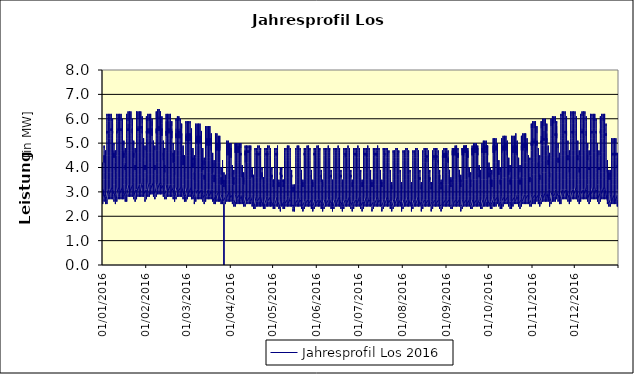
| Category | Jahresprofil Los 2016 |
|---|---|
| 01/01/2016 | 3 |
| 01/01/2016 | 2.9 |
| 01/01/2016 | 2.8 |
| 01/01/2016 | 2.7 |
| 01/01/2016 | 2.6 |
| 01/01/2016 | 2.5 |
| 01/01/2016 | 2.5 |
| 01/01/2016 | 2.5 |
| 01/01/2016 | 2.6 |
| 01/01/2016 | 2.7 |
| 01/01/2016 | 3 |
| 01/01/2016 | 3.2 |
| 01/01/2016 | 3.4 |
| 01/01/2016 | 3.5 |
| 01/01/2016 | 3.5 |
| 01/01/2016 | 3.6 |
| 01/01/2016 | 4 |
| 01/01/2016 | 4.1 |
| 01/01/2016 | 4.2 |
| 01/01/2016 | 4.1 |
| 01/01/2016 | 3.8 |
| 01/01/2016 | 3.5 |
| 01/01/2016 | 3.3 |
| 01/01/2016 | 3 |
| 02/01/2016 | 3.1 |
| 02/01/2016 | 2.8 |
| 02/01/2016 | 2.7 |
| 02/01/2016 | 2.6 |
| 02/01/2016 | 2.6 |
| 02/01/2016 | 2.6 |
| 02/01/2016 | 2.7 |
| 02/01/2016 | 3 |
| 02/01/2016 | 3.5 |
| 02/01/2016 | 3.9 |
| 02/01/2016 | 4.3 |
| 02/01/2016 | 4.4 |
| 02/01/2016 | 4.5 |
| 02/01/2016 | 4.3 |
| 02/01/2016 | 4.2 |
| 02/01/2016 | 4.3 |
| 02/01/2016 | 4.7 |
| 02/01/2016 | 4.9 |
| 02/01/2016 | 4.8 |
| 02/01/2016 | 4.7 |
| 02/01/2016 | 4.2 |
| 02/01/2016 | 3.8 |
| 02/01/2016 | 3.5 |
| 02/01/2016 | 3.2 |
| 03/01/2016 | 2.9 |
| 03/01/2016 | 2.7 |
| 03/01/2016 | 2.6 |
| 03/01/2016 | 2.5 |
| 03/01/2016 | 2.5 |
| 03/01/2016 | 2.5 |
| 03/01/2016 | 2.6 |
| 03/01/2016 | 2.8 |
| 03/01/2016 | 3.1 |
| 03/01/2016 | 3.4 |
| 03/01/2016 | 3.7 |
| 03/01/2016 | 3.9 |
| 03/01/2016 | 4 |
| 03/01/2016 | 3.9 |
| 03/01/2016 | 3.9 |
| 03/01/2016 | 3.9 |
| 03/01/2016 | 4.3 |
| 03/01/2016 | 4.6 |
| 03/01/2016 | 4.7 |
| 03/01/2016 | 4.5 |
| 03/01/2016 | 4.2 |
| 03/01/2016 | 3.8 |
| 03/01/2016 | 3.6 |
| 03/01/2016 | 3.3 |
| 04/01/2016 | 2.9 |
| 04/01/2016 | 2.7 |
| 04/01/2016 | 2.6 |
| 04/01/2016 | 2.5 |
| 04/01/2016 | 2.7 |
| 04/01/2016 | 3 |
| 04/01/2016 | 3.7 |
| 04/01/2016 | 4.5 |
| 04/01/2016 | 4.9 |
| 04/01/2016 | 5.1 |
| 04/01/2016 | 5.3 |
| 04/01/2016 | 5.4 |
| 04/01/2016 | 5.5 |
| 04/01/2016 | 5.4 |
| 04/01/2016 | 5.4 |
| 04/01/2016 | 5.5 |
| 04/01/2016 | 5.9 |
| 04/01/2016 | 6.2 |
| 04/01/2016 | 6.1 |
| 04/01/2016 | 5.8 |
| 04/01/2016 | 5.1 |
| 04/01/2016 | 4.5 |
| 04/01/2016 | 4 |
| 04/01/2016 | 3.5 |
| 05/01/2016 | 3.1 |
| 05/01/2016 | 2.8 |
| 05/01/2016 | 2.7 |
| 05/01/2016 | 2.7 |
| 05/01/2016 | 2.8 |
| 05/01/2016 | 3.1 |
| 05/01/2016 | 3.8 |
| 05/01/2016 | 4.6 |
| 05/01/2016 | 5 |
| 05/01/2016 | 5.2 |
| 05/01/2016 | 5.4 |
| 05/01/2016 | 5.5 |
| 05/01/2016 | 5.5 |
| 05/01/2016 | 5.5 |
| 05/01/2016 | 5.5 |
| 05/01/2016 | 5.5 |
| 05/01/2016 | 5.9 |
| 05/01/2016 | 6.2 |
| 05/01/2016 | 6.1 |
| 05/01/2016 | 5.9 |
| 05/01/2016 | 5.2 |
| 05/01/2016 | 4.5 |
| 05/01/2016 | 4 |
| 05/01/2016 | 3.5 |
| 06/01/2016 | 3.1 |
| 06/01/2016 | 2.9 |
| 06/01/2016 | 2.7 |
| 06/01/2016 | 2.7 |
| 06/01/2016 | 2.8 |
| 06/01/2016 | 3.1 |
| 06/01/2016 | 3.8 |
| 06/01/2016 | 4.6 |
| 06/01/2016 | 5 |
| 06/01/2016 | 5.2 |
| 06/01/2016 | 5.4 |
| 06/01/2016 | 5.5 |
| 06/01/2016 | 5.5 |
| 06/01/2016 | 5.5 |
| 06/01/2016 | 5.5 |
| 06/01/2016 | 5.5 |
| 06/01/2016 | 5.9 |
| 06/01/2016 | 6.2 |
| 06/01/2016 | 6.1 |
| 06/01/2016 | 5.9 |
| 06/01/2016 | 5.2 |
| 06/01/2016 | 4.5 |
| 06/01/2016 | 4 |
| 06/01/2016 | 3.5 |
| 07/01/2016 | 3.2 |
| 07/01/2016 | 2.9 |
| 07/01/2016 | 2.7 |
| 07/01/2016 | 2.7 |
| 07/01/2016 | 2.8 |
| 07/01/2016 | 3.1 |
| 07/01/2016 | 3.8 |
| 07/01/2016 | 4.6 |
| 07/01/2016 | 5 |
| 07/01/2016 | 5.3 |
| 07/01/2016 | 5.4 |
| 07/01/2016 | 5.5 |
| 07/01/2016 | 5.6 |
| 07/01/2016 | 5.5 |
| 07/01/2016 | 5.5 |
| 07/01/2016 | 5.6 |
| 07/01/2016 | 5.9 |
| 07/01/2016 | 6.2 |
| 07/01/2016 | 6.2 |
| 07/01/2016 | 5.9 |
| 07/01/2016 | 5.2 |
| 07/01/2016 | 4.5 |
| 07/01/2016 | 4 |
| 07/01/2016 | 3.6 |
| 08/01/2016 | 3.2 |
| 08/01/2016 | 2.9 |
| 08/01/2016 | 2.8 |
| 08/01/2016 | 2.7 |
| 08/01/2016 | 2.8 |
| 08/01/2016 | 3.1 |
| 08/01/2016 | 3.8 |
| 08/01/2016 | 4.6 |
| 08/01/2016 | 5 |
| 08/01/2016 | 5.3 |
| 08/01/2016 | 5.4 |
| 08/01/2016 | 5.5 |
| 08/01/2016 | 5.5 |
| 08/01/2016 | 5.4 |
| 08/01/2016 | 5.4 |
| 08/01/2016 | 5.4 |
| 08/01/2016 | 5.8 |
| 08/01/2016 | 6 |
| 08/01/2016 | 5.9 |
| 08/01/2016 | 5.6 |
| 08/01/2016 | 4.9 |
| 08/01/2016 | 4.3 |
| 08/01/2016 | 3.9 |
| 08/01/2016 | 3.5 |
| 09/01/2016 | 3.1 |
| 09/01/2016 | 2.9 |
| 09/01/2016 | 2.8 |
| 09/01/2016 | 2.7 |
| 09/01/2016 | 2.6 |
| 09/01/2016 | 2.7 |
| 09/01/2016 | 2.9 |
| 09/01/2016 | 3.3 |
| 09/01/2016 | 3.7 |
| 09/01/2016 | 4.1 |
| 09/01/2016 | 4.4 |
| 09/01/2016 | 4.6 |
| 09/01/2016 | 4.6 |
| 09/01/2016 | 4.4 |
| 09/01/2016 | 4.4 |
| 09/01/2016 | 4.4 |
| 09/01/2016 | 4.7 |
| 09/01/2016 | 5 |
| 09/01/2016 | 5 |
| 09/01/2016 | 4.9 |
| 09/01/2016 | 4.4 |
| 09/01/2016 | 3.9 |
| 09/01/2016 | 3.6 |
| 09/01/2016 | 3.3 |
| 10/01/2016 | 3 |
| 10/01/2016 | 2.7 |
| 10/01/2016 | 2.6 |
| 10/01/2016 | 2.6 |
| 10/01/2016 | 2.5 |
| 10/01/2016 | 2.5 |
| 10/01/2016 | 2.6 |
| 10/01/2016 | 2.9 |
| 10/01/2016 | 3.2 |
| 10/01/2016 | 3.5 |
| 10/01/2016 | 3.7 |
| 10/01/2016 | 3.9 |
| 10/01/2016 | 4 |
| 10/01/2016 | 3.9 |
| 10/01/2016 | 3.9 |
| 10/01/2016 | 3.9 |
| 10/01/2016 | 4.2 |
| 10/01/2016 | 4.6 |
| 10/01/2016 | 4.7 |
| 10/01/2016 | 4.6 |
| 10/01/2016 | 4.2 |
| 10/01/2016 | 3.9 |
| 10/01/2016 | 3.6 |
| 10/01/2016 | 3.3 |
| 11/01/2016 | 3 |
| 11/01/2016 | 2.7 |
| 11/01/2016 | 2.6 |
| 11/01/2016 | 2.6 |
| 11/01/2016 | 2.7 |
| 11/01/2016 | 3 |
| 11/01/2016 | 3.8 |
| 11/01/2016 | 4.5 |
| 11/01/2016 | 5 |
| 11/01/2016 | 5.2 |
| 11/01/2016 | 5.4 |
| 11/01/2016 | 5.5 |
| 11/01/2016 | 5.5 |
| 11/01/2016 | 5.4 |
| 11/01/2016 | 5.4 |
| 11/01/2016 | 5.5 |
| 11/01/2016 | 5.8 |
| 11/01/2016 | 6.2 |
| 11/01/2016 | 6.1 |
| 11/01/2016 | 5.9 |
| 11/01/2016 | 5.2 |
| 11/01/2016 | 4.5 |
| 11/01/2016 | 4 |
| 11/01/2016 | 3.5 |
| 12/01/2016 | 3.2 |
| 12/01/2016 | 2.9 |
| 12/01/2016 | 2.8 |
| 12/01/2016 | 2.7 |
| 12/01/2016 | 2.8 |
| 12/01/2016 | 3.1 |
| 12/01/2016 | 3.9 |
| 12/01/2016 | 4.6 |
| 12/01/2016 | 5.1 |
| 12/01/2016 | 5.3 |
| 12/01/2016 | 5.4 |
| 12/01/2016 | 5.5 |
| 12/01/2016 | 5.6 |
| 12/01/2016 | 5.5 |
| 12/01/2016 | 5.5 |
| 12/01/2016 | 5.5 |
| 12/01/2016 | 5.9 |
| 12/01/2016 | 6.2 |
| 12/01/2016 | 6.2 |
| 12/01/2016 | 5.9 |
| 12/01/2016 | 5.2 |
| 12/01/2016 | 4.5 |
| 12/01/2016 | 4.1 |
| 12/01/2016 | 3.6 |
| 13/01/2016 | 3.2 |
| 13/01/2016 | 2.9 |
| 13/01/2016 | 2.8 |
| 13/01/2016 | 2.7 |
| 13/01/2016 | 2.8 |
| 13/01/2016 | 3.2 |
| 13/01/2016 | 3.9 |
| 13/01/2016 | 4.7 |
| 13/01/2016 | 5.1 |
| 13/01/2016 | 5.3 |
| 13/01/2016 | 5.5 |
| 13/01/2016 | 5.6 |
| 13/01/2016 | 5.6 |
| 13/01/2016 | 5.5 |
| 13/01/2016 | 5.5 |
| 13/01/2016 | 5.5 |
| 13/01/2016 | 5.9 |
| 13/01/2016 | 6.2 |
| 13/01/2016 | 6.2 |
| 13/01/2016 | 5.9 |
| 13/01/2016 | 5.2 |
| 13/01/2016 | 4.5 |
| 13/01/2016 | 4.1 |
| 13/01/2016 | 3.6 |
| 14/01/2016 | 3.2 |
| 14/01/2016 | 2.9 |
| 14/01/2016 | 2.8 |
| 14/01/2016 | 2.7 |
| 14/01/2016 | 2.8 |
| 14/01/2016 | 3.2 |
| 14/01/2016 | 3.9 |
| 14/01/2016 | 4.7 |
| 14/01/2016 | 5.1 |
| 14/01/2016 | 5.3 |
| 14/01/2016 | 5.5 |
| 14/01/2016 | 5.6 |
| 14/01/2016 | 5.6 |
| 14/01/2016 | 5.5 |
| 14/01/2016 | 5.5 |
| 14/01/2016 | 5.6 |
| 14/01/2016 | 5.9 |
| 14/01/2016 | 6.2 |
| 14/01/2016 | 6.2 |
| 14/01/2016 | 5.9 |
| 14/01/2016 | 5.2 |
| 14/01/2016 | 4.6 |
| 14/01/2016 | 4.1 |
| 14/01/2016 | 3.6 |
| 15/01/2016 | 3.2 |
| 15/01/2016 | 2.9 |
| 15/01/2016 | 2.8 |
| 15/01/2016 | 2.7 |
| 15/01/2016 | 2.9 |
| 15/01/2016 | 3.2 |
| 15/01/2016 | 3.9 |
| 15/01/2016 | 4.7 |
| 15/01/2016 | 5.1 |
| 15/01/2016 | 5.3 |
| 15/01/2016 | 5.5 |
| 15/01/2016 | 5.6 |
| 15/01/2016 | 5.6 |
| 15/01/2016 | 5.4 |
| 15/01/2016 | 5.4 |
| 15/01/2016 | 5.4 |
| 15/01/2016 | 5.7 |
| 15/01/2016 | 6 |
| 15/01/2016 | 6 |
| 15/01/2016 | 5.7 |
| 15/01/2016 | 5 |
| 15/01/2016 | 4.3 |
| 15/01/2016 | 3.9 |
| 15/01/2016 | 3.6 |
| 16/01/2016 | 3.2 |
| 16/01/2016 | 2.9 |
| 16/01/2016 | 2.8 |
| 16/01/2016 | 2.7 |
| 16/01/2016 | 2.7 |
| 16/01/2016 | 2.7 |
| 16/01/2016 | 2.9 |
| 16/01/2016 | 3.3 |
| 16/01/2016 | 3.7 |
| 16/01/2016 | 4.2 |
| 16/01/2016 | 4.5 |
| 16/01/2016 | 4.6 |
| 16/01/2016 | 4.6 |
| 16/01/2016 | 4.5 |
| 16/01/2016 | 4.4 |
| 16/01/2016 | 4.4 |
| 16/01/2016 | 4.7 |
| 16/01/2016 | 5 |
| 16/01/2016 | 5.1 |
| 16/01/2016 | 4.9 |
| 16/01/2016 | 4.4 |
| 16/01/2016 | 3.9 |
| 16/01/2016 | 3.6 |
| 16/01/2016 | 3.3 |
| 17/01/2016 | 3 |
| 17/01/2016 | 2.8 |
| 17/01/2016 | 2.7 |
| 17/01/2016 | 2.6 |
| 17/01/2016 | 2.6 |
| 17/01/2016 | 2.6 |
| 17/01/2016 | 2.7 |
| 17/01/2016 | 2.9 |
| 17/01/2016 | 3.2 |
| 17/01/2016 | 3.5 |
| 17/01/2016 | 3.8 |
| 17/01/2016 | 4 |
| 17/01/2016 | 4.1 |
| 17/01/2016 | 4 |
| 17/01/2016 | 3.9 |
| 17/01/2016 | 3.9 |
| 17/01/2016 | 4.2 |
| 17/01/2016 | 4.6 |
| 17/01/2016 | 4.8 |
| 17/01/2016 | 4.6 |
| 17/01/2016 | 4.2 |
| 17/01/2016 | 3.9 |
| 17/01/2016 | 3.7 |
| 17/01/2016 | 3.3 |
| 18/01/2016 | 3 |
| 18/01/2016 | 2.8 |
| 18/01/2016 | 2.7 |
| 18/01/2016 | 2.6 |
| 18/01/2016 | 2.8 |
| 18/01/2016 | 3.1 |
| 18/01/2016 | 3.9 |
| 18/01/2016 | 4.6 |
| 18/01/2016 | 5 |
| 18/01/2016 | 5.2 |
| 18/01/2016 | 5.4 |
| 18/01/2016 | 5.5 |
| 18/01/2016 | 5.5 |
| 18/01/2016 | 5.5 |
| 18/01/2016 | 5.5 |
| 18/01/2016 | 5.5 |
| 18/01/2016 | 5.7 |
| 18/01/2016 | 6.2 |
| 18/01/2016 | 6.2 |
| 18/01/2016 | 5.9 |
| 18/01/2016 | 5.2 |
| 18/01/2016 | 4.5 |
| 18/01/2016 | 4.1 |
| 18/01/2016 | 3.6 |
| 19/01/2016 | 3.2 |
| 19/01/2016 | 2.9 |
| 19/01/2016 | 2.8 |
| 19/01/2016 | 2.8 |
| 19/01/2016 | 2.9 |
| 19/01/2016 | 3.2 |
| 19/01/2016 | 3.9 |
| 19/01/2016 | 4.7 |
| 19/01/2016 | 5.1 |
| 19/01/2016 | 5.3 |
| 19/01/2016 | 5.5 |
| 19/01/2016 | 5.6 |
| 19/01/2016 | 5.6 |
| 19/01/2016 | 5.5 |
| 19/01/2016 | 5.5 |
| 19/01/2016 | 5.5 |
| 19/01/2016 | 5.8 |
| 19/01/2016 | 6.2 |
| 19/01/2016 | 6.3 |
| 19/01/2016 | 5.9 |
| 19/01/2016 | 5.2 |
| 19/01/2016 | 4.6 |
| 19/01/2016 | 4.1 |
| 19/01/2016 | 3.6 |
| 20/01/2016 | 3.3 |
| 20/01/2016 | 3 |
| 20/01/2016 | 2.8 |
| 20/01/2016 | 2.8 |
| 20/01/2016 | 2.9 |
| 20/01/2016 | 3.2 |
| 20/01/2016 | 4 |
| 20/01/2016 | 4.7 |
| 20/01/2016 | 5.1 |
| 20/01/2016 | 5.4 |
| 20/01/2016 | 5.5 |
| 20/01/2016 | 5.6 |
| 20/01/2016 | 5.6 |
| 20/01/2016 | 5.6 |
| 20/01/2016 | 5.5 |
| 20/01/2016 | 5.5 |
| 20/01/2016 | 5.8 |
| 20/01/2016 | 6.2 |
| 20/01/2016 | 6.3 |
| 20/01/2016 | 6 |
| 20/01/2016 | 5.2 |
| 20/01/2016 | 4.6 |
| 20/01/2016 | 4.1 |
| 20/01/2016 | 3.6 |
| 21/01/2016 | 3.3 |
| 21/01/2016 | 3 |
| 21/01/2016 | 2.8 |
| 21/01/2016 | 2.8 |
| 21/01/2016 | 2.9 |
| 21/01/2016 | 3.2 |
| 21/01/2016 | 4 |
| 21/01/2016 | 4.7 |
| 21/01/2016 | 5.2 |
| 21/01/2016 | 5.4 |
| 21/01/2016 | 5.5 |
| 21/01/2016 | 5.6 |
| 21/01/2016 | 5.6 |
| 21/01/2016 | 5.6 |
| 21/01/2016 | 5.6 |
| 21/01/2016 | 5.6 |
| 21/01/2016 | 5.8 |
| 21/01/2016 | 6.2 |
| 21/01/2016 | 6.3 |
| 21/01/2016 | 6 |
| 21/01/2016 | 5.3 |
| 21/01/2016 | 4.6 |
| 21/01/2016 | 4.1 |
| 21/01/2016 | 3.7 |
| 22/01/2016 | 3.3 |
| 22/01/2016 | 3 |
| 22/01/2016 | 2.9 |
| 22/01/2016 | 2.8 |
| 22/01/2016 | 2.9 |
| 22/01/2016 | 3.2 |
| 22/01/2016 | 4 |
| 22/01/2016 | 4.7 |
| 22/01/2016 | 5.2 |
| 22/01/2016 | 5.4 |
| 22/01/2016 | 5.5 |
| 22/01/2016 | 5.6 |
| 22/01/2016 | 5.6 |
| 22/01/2016 | 5.5 |
| 22/01/2016 | 5.4 |
| 22/01/2016 | 5.4 |
| 22/01/2016 | 5.6 |
| 22/01/2016 | 6 |
| 22/01/2016 | 6 |
| 22/01/2016 | 5.7 |
| 22/01/2016 | 5 |
| 22/01/2016 | 4.4 |
| 22/01/2016 | 4 |
| 22/01/2016 | 3.6 |
| 23/01/2016 | 3.3 |
| 23/01/2016 | 3 |
| 23/01/2016 | 2.8 |
| 23/01/2016 | 2.8 |
| 23/01/2016 | 2.7 |
| 23/01/2016 | 2.8 |
| 23/01/2016 | 3 |
| 23/01/2016 | 3.4 |
| 23/01/2016 | 3.8 |
| 23/01/2016 | 4.2 |
| 23/01/2016 | 4.5 |
| 23/01/2016 | 4.6 |
| 23/01/2016 | 4.6 |
| 23/01/2016 | 4.5 |
| 23/01/2016 | 4.4 |
| 23/01/2016 | 4.4 |
| 23/01/2016 | 4.6 |
| 23/01/2016 | 5 |
| 23/01/2016 | 5.1 |
| 23/01/2016 | 4.9 |
| 23/01/2016 | 4.4 |
| 23/01/2016 | 4 |
| 23/01/2016 | 3.7 |
| 23/01/2016 | 3.4 |
| 24/01/2016 | 3.1 |
| 24/01/2016 | 2.8 |
| 24/01/2016 | 2.7 |
| 24/01/2016 | 2.6 |
| 24/01/2016 | 2.6 |
| 24/01/2016 | 2.6 |
| 24/01/2016 | 2.7 |
| 24/01/2016 | 3 |
| 24/01/2016 | 3.2 |
| 24/01/2016 | 3.6 |
| 24/01/2016 | 3.8 |
| 24/01/2016 | 4 |
| 24/01/2016 | 4.1 |
| 24/01/2016 | 4 |
| 24/01/2016 | 3.9 |
| 24/01/2016 | 3.9 |
| 24/01/2016 | 4.1 |
| 24/01/2016 | 4.6 |
| 24/01/2016 | 4.8 |
| 24/01/2016 | 4.6 |
| 24/01/2016 | 4.3 |
| 24/01/2016 | 3.9 |
| 24/01/2016 | 3.7 |
| 24/01/2016 | 3.4 |
| 25/01/2016 | 3.1 |
| 25/01/2016 | 2.9 |
| 25/01/2016 | 2.7 |
| 25/01/2016 | 2.7 |
| 25/01/2016 | 2.8 |
| 25/01/2016 | 3.1 |
| 25/01/2016 | 3.9 |
| 25/01/2016 | 4.7 |
| 25/01/2016 | 5.1 |
| 25/01/2016 | 5.3 |
| 25/01/2016 | 5.5 |
| 25/01/2016 | 5.6 |
| 25/01/2016 | 5.6 |
| 25/01/2016 | 5.5 |
| 25/01/2016 | 5.5 |
| 25/01/2016 | 5.5 |
| 25/01/2016 | 5.7 |
| 25/01/2016 | 6.2 |
| 25/01/2016 | 6.3 |
| 25/01/2016 | 5.9 |
| 25/01/2016 | 5.2 |
| 25/01/2016 | 4.6 |
| 25/01/2016 | 4.1 |
| 25/01/2016 | 3.6 |
| 26/01/2016 | 3.3 |
| 26/01/2016 | 3 |
| 26/01/2016 | 2.9 |
| 26/01/2016 | 2.8 |
| 26/01/2016 | 2.9 |
| 26/01/2016 | 3.2 |
| 26/01/2016 | 4 |
| 26/01/2016 | 4.8 |
| 26/01/2016 | 5.2 |
| 26/01/2016 | 5.4 |
| 26/01/2016 | 5.5 |
| 26/01/2016 | 5.6 |
| 26/01/2016 | 5.6 |
| 26/01/2016 | 5.6 |
| 26/01/2016 | 5.5 |
| 26/01/2016 | 5.5 |
| 26/01/2016 | 5.7 |
| 26/01/2016 | 6.2 |
| 26/01/2016 | 6.3 |
| 26/01/2016 | 6 |
| 26/01/2016 | 5.3 |
| 26/01/2016 | 4.6 |
| 26/01/2016 | 4.1 |
| 26/01/2016 | 3.7 |
| 27/01/2016 | 3.3 |
| 27/01/2016 | 3 |
| 27/01/2016 | 2.9 |
| 27/01/2016 | 2.8 |
| 27/01/2016 | 2.9 |
| 27/01/2016 | 3.3 |
| 27/01/2016 | 4 |
| 27/01/2016 | 4.8 |
| 27/01/2016 | 5.2 |
| 27/01/2016 | 5.4 |
| 27/01/2016 | 5.6 |
| 27/01/2016 | 5.7 |
| 27/01/2016 | 5.7 |
| 27/01/2016 | 5.6 |
| 27/01/2016 | 5.6 |
| 27/01/2016 | 5.5 |
| 27/01/2016 | 5.7 |
| 27/01/2016 | 6.2 |
| 27/01/2016 | 6.3 |
| 27/01/2016 | 6 |
| 27/01/2016 | 5.3 |
| 27/01/2016 | 4.6 |
| 27/01/2016 | 4.2 |
| 27/01/2016 | 3.7 |
| 28/01/2016 | 3.3 |
| 28/01/2016 | 3 |
| 28/01/2016 | 2.9 |
| 28/01/2016 | 2.8 |
| 28/01/2016 | 2.9 |
| 28/01/2016 | 3.3 |
| 28/01/2016 | 4 |
| 28/01/2016 | 4.8 |
| 28/01/2016 | 5.2 |
| 28/01/2016 | 5.4 |
| 28/01/2016 | 5.6 |
| 28/01/2016 | 5.7 |
| 28/01/2016 | 5.7 |
| 28/01/2016 | 5.6 |
| 28/01/2016 | 5.6 |
| 28/01/2016 | 5.6 |
| 28/01/2016 | 5.7 |
| 28/01/2016 | 6.2 |
| 28/01/2016 | 6.3 |
| 28/01/2016 | 6 |
| 28/01/2016 | 5.3 |
| 28/01/2016 | 4.6 |
| 28/01/2016 | 4.2 |
| 28/01/2016 | 3.7 |
| 29/01/2016 | 3.4 |
| 29/01/2016 | 3.1 |
| 29/01/2016 | 2.9 |
| 29/01/2016 | 2.8 |
| 29/01/2016 | 2.9 |
| 29/01/2016 | 3.3 |
| 29/01/2016 | 4 |
| 29/01/2016 | 4.8 |
| 29/01/2016 | 5.2 |
| 29/01/2016 | 5.4 |
| 29/01/2016 | 5.6 |
| 29/01/2016 | 5.7 |
| 29/01/2016 | 5.6 |
| 29/01/2016 | 5.5 |
| 29/01/2016 | 5.4 |
| 29/01/2016 | 5.4 |
| 29/01/2016 | 5.5 |
| 29/01/2016 | 6 |
| 29/01/2016 | 6.1 |
| 29/01/2016 | 5.8 |
| 29/01/2016 | 5.1 |
| 29/01/2016 | 4.4 |
| 29/01/2016 | 4 |
| 29/01/2016 | 3.6 |
| 30/01/2016 | 3.3 |
| 30/01/2016 | 3 |
| 30/01/2016 | 2.9 |
| 30/01/2016 | 2.8 |
| 30/01/2016 | 2.8 |
| 30/01/2016 | 2.8 |
| 30/01/2016 | 3.1 |
| 30/01/2016 | 3.4 |
| 30/01/2016 | 3.8 |
| 30/01/2016 | 4.3 |
| 30/01/2016 | 4.5 |
| 30/01/2016 | 4.7 |
| 30/01/2016 | 4.7 |
| 30/01/2016 | 4.5 |
| 30/01/2016 | 4.4 |
| 30/01/2016 | 4.4 |
| 30/01/2016 | 4.5 |
| 30/01/2016 | 5 |
| 30/01/2016 | 5.2 |
| 30/01/2016 | 5 |
| 30/01/2016 | 4.5 |
| 30/01/2016 | 4 |
| 30/01/2016 | 3.7 |
| 30/01/2016 | 3.4 |
| 31/01/2016 | 3.1 |
| 31/01/2016 | 2.9 |
| 31/01/2016 | 2.8 |
| 31/01/2016 | 2.7 |
| 31/01/2016 | 2.6 |
| 31/01/2016 | 2.7 |
| 31/01/2016 | 2.8 |
| 31/01/2016 | 3 |
| 31/01/2016 | 3.3 |
| 31/01/2016 | 3.6 |
| 31/01/2016 | 3.8 |
| 31/01/2016 | 4 |
| 31/01/2016 | 4.1 |
| 31/01/2016 | 4 |
| 31/01/2016 | 3.9 |
| 31/01/2016 | 3.9 |
| 31/01/2016 | 4.1 |
| 31/01/2016 | 4.6 |
| 31/01/2016 | 4.9 |
| 31/01/2016 | 4.7 |
| 31/01/2016 | 4.3 |
| 31/01/2016 | 4 |
| 31/01/2016 | 3.8 |
| 31/01/2016 | 3.4 |
| 01/02/2016 | 3.1 |
| 01/02/2016 | 2.9 |
| 01/02/2016 | 2.8 |
| 01/02/2016 | 2.7 |
| 01/02/2016 | 2.8 |
| 01/02/2016 | 3.1 |
| 01/02/2016 | 3.8 |
| 01/02/2016 | 4.5 |
| 01/02/2016 | 4.9 |
| 01/02/2016 | 5.2 |
| 01/02/2016 | 5.4 |
| 01/02/2016 | 5.5 |
| 01/02/2016 | 5.5 |
| 01/02/2016 | 5.5 |
| 01/02/2016 | 5.4 |
| 01/02/2016 | 5.4 |
| 01/02/2016 | 5.5 |
| 01/02/2016 | 6 |
| 01/02/2016 | 6.1 |
| 01/02/2016 | 5.9 |
| 01/02/2016 | 5.2 |
| 01/02/2016 | 4.6 |
| 01/02/2016 | 4.1 |
| 01/02/2016 | 3.7 |
| 02/02/2016 | 3.3 |
| 02/02/2016 | 3 |
| 02/02/2016 | 2.9 |
| 02/02/2016 | 2.8 |
| 02/02/2016 | 2.9 |
| 02/02/2016 | 3.2 |
| 02/02/2016 | 3.9 |
| 02/02/2016 | 4.6 |
| 02/02/2016 | 5 |
| 02/02/2016 | 5.3 |
| 02/02/2016 | 5.5 |
| 02/02/2016 | 5.6 |
| 02/02/2016 | 5.6 |
| 02/02/2016 | 5.5 |
| 02/02/2016 | 5.5 |
| 02/02/2016 | 5.4 |
| 02/02/2016 | 5.5 |
| 02/02/2016 | 6.1 |
| 02/02/2016 | 6.2 |
| 02/02/2016 | 5.9 |
| 02/02/2016 | 5.2 |
| 02/02/2016 | 4.6 |
| 02/02/2016 | 4.1 |
| 02/02/2016 | 3.7 |
| 03/02/2016 | 3.4 |
| 03/02/2016 | 3.1 |
| 03/02/2016 | 2.9 |
| 03/02/2016 | 2.8 |
| 03/02/2016 | 3 |
| 03/02/2016 | 3.3 |
| 03/02/2016 | 3.9 |
| 03/02/2016 | 4.6 |
| 03/02/2016 | 5.1 |
| 03/02/2016 | 5.3 |
| 03/02/2016 | 5.5 |
| 03/02/2016 | 5.6 |
| 03/02/2016 | 5.6 |
| 03/02/2016 | 5.5 |
| 03/02/2016 | 5.5 |
| 03/02/2016 | 5.4 |
| 03/02/2016 | 5.5 |
| 03/02/2016 | 6.1 |
| 03/02/2016 | 6.2 |
| 03/02/2016 | 5.9 |
| 03/02/2016 | 5.2 |
| 03/02/2016 | 4.6 |
| 03/02/2016 | 4.2 |
| 03/02/2016 | 3.7 |
| 04/02/2016 | 3.4 |
| 04/02/2016 | 3.1 |
| 04/02/2016 | 2.9 |
| 04/02/2016 | 2.9 |
| 04/02/2016 | 3 |
| 04/02/2016 | 3.3 |
| 04/02/2016 | 3.9 |
| 04/02/2016 | 4.6 |
| 04/02/2016 | 5.1 |
| 04/02/2016 | 5.3 |
| 04/02/2016 | 5.5 |
| 04/02/2016 | 5.6 |
| 04/02/2016 | 5.6 |
| 04/02/2016 | 5.6 |
| 04/02/2016 | 5.5 |
| 04/02/2016 | 5.4 |
| 04/02/2016 | 5.5 |
| 04/02/2016 | 6.1 |
| 04/02/2016 | 6.2 |
| 04/02/2016 | 6 |
| 04/02/2016 | 5.2 |
| 04/02/2016 | 4.6 |
| 04/02/2016 | 4.2 |
| 04/02/2016 | 3.7 |
| 05/02/2016 | 3.4 |
| 05/02/2016 | 3.1 |
| 05/02/2016 | 2.9 |
| 05/02/2016 | 2.9 |
| 05/02/2016 | 3 |
| 05/02/2016 | 3.3 |
| 05/02/2016 | 3.9 |
| 05/02/2016 | 4.6 |
| 05/02/2016 | 5.1 |
| 05/02/2016 | 5.3 |
| 05/02/2016 | 5.5 |
| 05/02/2016 | 5.6 |
| 05/02/2016 | 5.6 |
| 05/02/2016 | 5.5 |
| 05/02/2016 | 5.4 |
| 05/02/2016 | 5.3 |
| 05/02/2016 | 5.3 |
| 05/02/2016 | 5.9 |
| 05/02/2016 | 6 |
| 05/02/2016 | 5.7 |
| 05/02/2016 | 5 |
| 05/02/2016 | 4.4 |
| 05/02/2016 | 4 |
| 05/02/2016 | 3.7 |
| 06/02/2016 | 3.4 |
| 06/02/2016 | 3.1 |
| 06/02/2016 | 2.9 |
| 06/02/2016 | 2.8 |
| 06/02/2016 | 2.8 |
| 06/02/2016 | 2.8 |
| 06/02/2016 | 3 |
| 06/02/2016 | 3.3 |
| 06/02/2016 | 3.7 |
| 06/02/2016 | 4.2 |
| 06/02/2016 | 4.5 |
| 06/02/2016 | 4.6 |
| 06/02/2016 | 4.6 |
| 06/02/2016 | 4.5 |
| 06/02/2016 | 4.4 |
| 06/02/2016 | 4.3 |
| 06/02/2016 | 4.3 |
| 06/02/2016 | 4.9 |
| 06/02/2016 | 5.1 |
| 06/02/2016 | 4.9 |
| 06/02/2016 | 4.4 |
| 06/02/2016 | 4 |
| 06/02/2016 | 3.7 |
| 06/02/2016 | 3.5 |
| 07/02/2016 | 3.2 |
| 07/02/2016 | 2.9 |
| 07/02/2016 | 2.8 |
| 07/02/2016 | 2.7 |
| 07/02/2016 | 2.7 |
| 07/02/2016 | 2.7 |
| 07/02/2016 | 2.8 |
| 07/02/2016 | 3 |
| 07/02/2016 | 3.3 |
| 07/02/2016 | 3.6 |
| 07/02/2016 | 3.9 |
| 07/02/2016 | 4.1 |
| 07/02/2016 | 4.1 |
| 07/02/2016 | 4 |
| 07/02/2016 | 3.9 |
| 07/02/2016 | 3.9 |
| 07/02/2016 | 4 |
| 07/02/2016 | 4.6 |
| 07/02/2016 | 4.9 |
| 07/02/2016 | 4.7 |
| 07/02/2016 | 4.3 |
| 07/02/2016 | 4 |
| 07/02/2016 | 3.8 |
| 07/02/2016 | 3.5 |
| 08/02/2016 | 3.2 |
| 08/02/2016 | 2.9 |
| 08/02/2016 | 2.8 |
| 08/02/2016 | 2.8 |
| 08/02/2016 | 2.9 |
| 08/02/2016 | 3.2 |
| 08/02/2016 | 4 |
| 08/02/2016 | 4.8 |
| 08/02/2016 | 5.2 |
| 08/02/2016 | 5.4 |
| 08/02/2016 | 5.5 |
| 08/02/2016 | 5.6 |
| 08/02/2016 | 5.6 |
| 08/02/2016 | 5.6 |
| 08/02/2016 | 5.5 |
| 08/02/2016 | 5.4 |
| 08/02/2016 | 5.5 |
| 08/02/2016 | 6.1 |
| 08/02/2016 | 6.3 |
| 08/02/2016 | 6 |
| 08/02/2016 | 5.3 |
| 08/02/2016 | 4.7 |
| 08/02/2016 | 4.2 |
| 08/02/2016 | 3.7 |
| 09/02/2016 | 3.4 |
| 09/02/2016 | 3.1 |
| 09/02/2016 | 2.9 |
| 09/02/2016 | 2.9 |
| 09/02/2016 | 3 |
| 09/02/2016 | 3.3 |
| 09/02/2016 | 4.1 |
| 09/02/2016 | 4.8 |
| 09/02/2016 | 5.2 |
| 09/02/2016 | 5.5 |
| 09/02/2016 | 5.6 |
| 09/02/2016 | 5.7 |
| 09/02/2016 | 5.7 |
| 09/02/2016 | 5.6 |
| 09/02/2016 | 5.5 |
| 09/02/2016 | 5.5 |
| 09/02/2016 | 5.5 |
| 09/02/2016 | 6.1 |
| 09/02/2016 | 6.4 |
| 09/02/2016 | 6 |
| 09/02/2016 | 5.3 |
| 09/02/2016 | 4.7 |
| 09/02/2016 | 4.2 |
| 09/02/2016 | 3.7 |
| 10/02/2016 | 3.4 |
| 10/02/2016 | 3.1 |
| 10/02/2016 | 2.9 |
| 10/02/2016 | 2.9 |
| 10/02/2016 | 3 |
| 10/02/2016 | 3.3 |
| 10/02/2016 | 4.1 |
| 10/02/2016 | 4.9 |
| 10/02/2016 | 5.3 |
| 10/02/2016 | 5.5 |
| 10/02/2016 | 5.6 |
| 10/02/2016 | 5.7 |
| 10/02/2016 | 5.7 |
| 10/02/2016 | 5.6 |
| 10/02/2016 | 5.5 |
| 10/02/2016 | 5.5 |
| 10/02/2016 | 5.5 |
| 10/02/2016 | 6.1 |
| 10/02/2016 | 6.4 |
| 10/02/2016 | 6 |
| 10/02/2016 | 5.3 |
| 10/02/2016 | 4.7 |
| 10/02/2016 | 4.2 |
| 10/02/2016 | 3.7 |
| 11/02/2016 | 3.4 |
| 11/02/2016 | 3.1 |
| 11/02/2016 | 2.9 |
| 11/02/2016 | 2.9 |
| 11/02/2016 | 3 |
| 11/02/2016 | 3.3 |
| 11/02/2016 | 4.1 |
| 11/02/2016 | 4.8 |
| 11/02/2016 | 5.2 |
| 11/02/2016 | 5.5 |
| 11/02/2016 | 5.6 |
| 11/02/2016 | 5.7 |
| 11/02/2016 | 5.7 |
| 11/02/2016 | 5.6 |
| 11/02/2016 | 5.5 |
| 11/02/2016 | 5.5 |
| 11/02/2016 | 5.5 |
| 11/02/2016 | 6.1 |
| 11/02/2016 | 6.3 |
| 11/02/2016 | 6 |
| 11/02/2016 | 5.3 |
| 11/02/2016 | 4.7 |
| 11/02/2016 | 4.2 |
| 11/02/2016 | 3.7 |
| 12/02/2016 | 3.4 |
| 12/02/2016 | 3.1 |
| 12/02/2016 | 2.9 |
| 12/02/2016 | 2.9 |
| 12/02/2016 | 3 |
| 12/02/2016 | 3.3 |
| 12/02/2016 | 4.1 |
| 12/02/2016 | 4.8 |
| 12/02/2016 | 5.2 |
| 12/02/2016 | 5.4 |
| 12/02/2016 | 5.6 |
| 12/02/2016 | 5.6 |
| 12/02/2016 | 5.6 |
| 12/02/2016 | 5.5 |
| 12/02/2016 | 5.4 |
| 12/02/2016 | 5.3 |
| 12/02/2016 | 5.3 |
| 12/02/2016 | 5.8 |
| 12/02/2016 | 6.1 |
| 12/02/2016 | 5.8 |
| 12/02/2016 | 5.1 |
| 12/02/2016 | 4.4 |
| 12/02/2016 | 4 |
| 12/02/2016 | 3.6 |
| 13/02/2016 | 3.3 |
| 13/02/2016 | 3.1 |
| 13/02/2016 | 2.9 |
| 13/02/2016 | 2.8 |
| 13/02/2016 | 2.8 |
| 13/02/2016 | 2.9 |
| 13/02/2016 | 3.1 |
| 13/02/2016 | 3.4 |
| 13/02/2016 | 3.8 |
| 13/02/2016 | 4.2 |
| 13/02/2016 | 4.5 |
| 13/02/2016 | 4.6 |
| 13/02/2016 | 4.6 |
| 13/02/2016 | 4.5 |
| 13/02/2016 | 4.4 |
| 13/02/2016 | 4.3 |
| 13/02/2016 | 4.3 |
| 13/02/2016 | 4.8 |
| 13/02/2016 | 5.1 |
| 13/02/2016 | 5 |
| 13/02/2016 | 4.5 |
| 13/02/2016 | 4 |
| 13/02/2016 | 3.7 |
| 13/02/2016 | 3.4 |
| 14/02/2016 | 3.1 |
| 14/02/2016 | 2.9 |
| 14/02/2016 | 2.8 |
| 14/02/2016 | 2.7 |
| 14/02/2016 | 2.7 |
| 14/02/2016 | 2.7 |
| 14/02/2016 | 2.8 |
| 14/02/2016 | 3 |
| 14/02/2016 | 3.3 |
| 14/02/2016 | 3.6 |
| 14/02/2016 | 3.8 |
| 14/02/2016 | 4 |
| 14/02/2016 | 4.1 |
| 14/02/2016 | 4 |
| 14/02/2016 | 3.9 |
| 14/02/2016 | 3.8 |
| 14/02/2016 | 3.9 |
| 14/02/2016 | 4.4 |
| 14/02/2016 | 4.8 |
| 14/02/2016 | 4.7 |
| 14/02/2016 | 4.3 |
| 14/02/2016 | 3.9 |
| 14/02/2016 | 3.7 |
| 14/02/2016 | 3.4 |
| 15/02/2016 | 3.1 |
| 15/02/2016 | 2.9 |
| 15/02/2016 | 2.8 |
| 15/02/2016 | 2.7 |
| 15/02/2016 | 2.8 |
| 15/02/2016 | 3.2 |
| 15/02/2016 | 4 |
| 15/02/2016 | 4.7 |
| 15/02/2016 | 5.1 |
| 15/02/2016 | 5.3 |
| 15/02/2016 | 5.4 |
| 15/02/2016 | 5.5 |
| 15/02/2016 | 5.5 |
| 15/02/2016 | 5.4 |
| 15/02/2016 | 5.4 |
| 15/02/2016 | 5.3 |
| 15/02/2016 | 5.3 |
| 15/02/2016 | 5.9 |
| 15/02/2016 | 6.2 |
| 15/02/2016 | 6 |
| 15/02/2016 | 5.2 |
| 15/02/2016 | 4.6 |
| 15/02/2016 | 4.1 |
| 15/02/2016 | 3.6 |
| 16/02/2016 | 3.3 |
| 16/02/2016 | 3 |
| 16/02/2016 | 2.9 |
| 16/02/2016 | 2.8 |
| 16/02/2016 | 2.9 |
| 16/02/2016 | 3.3 |
| 16/02/2016 | 4 |
| 16/02/2016 | 4.7 |
| 16/02/2016 | 5.2 |
| 16/02/2016 | 5.4 |
| 16/02/2016 | 5.5 |
| 16/02/2016 | 5.6 |
| 16/02/2016 | 5.6 |
| 16/02/2016 | 5.5 |
| 16/02/2016 | 5.4 |
| 16/02/2016 | 5.4 |
| 16/02/2016 | 5.4 |
| 16/02/2016 | 5.9 |
| 16/02/2016 | 6.2 |
| 16/02/2016 | 6 |
| 16/02/2016 | 5.3 |
| 16/02/2016 | 4.6 |
| 16/02/2016 | 4.1 |
| 16/02/2016 | 3.7 |
| 17/02/2016 | 3.3 |
| 17/02/2016 | 3 |
| 17/02/2016 | 2.9 |
| 17/02/2016 | 2.8 |
| 17/02/2016 | 2.9 |
| 17/02/2016 | 3.3 |
| 17/02/2016 | 4 |
| 17/02/2016 | 4.8 |
| 17/02/2016 | 5.2 |
| 17/02/2016 | 5.4 |
| 17/02/2016 | 5.5 |
| 17/02/2016 | 5.6 |
| 17/02/2016 | 5.6 |
| 17/02/2016 | 5.5 |
| 17/02/2016 | 5.4 |
| 17/02/2016 | 5.4 |
| 17/02/2016 | 5.4 |
| 17/02/2016 | 5.9 |
| 17/02/2016 | 6.2 |
| 17/02/2016 | 6 |
| 17/02/2016 | 5.3 |
| 17/02/2016 | 4.6 |
| 17/02/2016 | 4.1 |
| 17/02/2016 | 3.7 |
| 18/02/2016 | 3.3 |
| 18/02/2016 | 3 |
| 18/02/2016 | 2.9 |
| 18/02/2016 | 2.8 |
| 18/02/2016 | 2.9 |
| 18/02/2016 | 3.3 |
| 18/02/2016 | 4 |
| 18/02/2016 | 4.7 |
| 18/02/2016 | 5.2 |
| 18/02/2016 | 5.4 |
| 18/02/2016 | 5.5 |
| 18/02/2016 | 5.6 |
| 18/02/2016 | 5.6 |
| 18/02/2016 | 5.5 |
| 18/02/2016 | 5.4 |
| 18/02/2016 | 5.4 |
| 18/02/2016 | 5.4 |
| 18/02/2016 | 5.8 |
| 18/02/2016 | 6.2 |
| 18/02/2016 | 6 |
| 18/02/2016 | 5.3 |
| 18/02/2016 | 4.6 |
| 18/02/2016 | 4.1 |
| 18/02/2016 | 3.7 |
| 19/02/2016 | 3.3 |
| 19/02/2016 | 3 |
| 19/02/2016 | 2.9 |
| 19/02/2016 | 2.8 |
| 19/02/2016 | 2.9 |
| 19/02/2016 | 3.3 |
| 19/02/2016 | 4 |
| 19/02/2016 | 4.7 |
| 19/02/2016 | 5.1 |
| 19/02/2016 | 5.4 |
| 19/02/2016 | 5.5 |
| 19/02/2016 | 5.5 |
| 19/02/2016 | 5.5 |
| 19/02/2016 | 5.4 |
| 19/02/2016 | 5.3 |
| 19/02/2016 | 5.2 |
| 19/02/2016 | 5.2 |
| 19/02/2016 | 5.6 |
| 19/02/2016 | 5.9 |
| 19/02/2016 | 5.7 |
| 19/02/2016 | 5 |
| 19/02/2016 | 4.4 |
| 19/02/2016 | 4 |
| 19/02/2016 | 3.6 |
| 20/02/2016 | 3.2 |
| 20/02/2016 | 3 |
| 20/02/2016 | 2.9 |
| 20/02/2016 | 2.8 |
| 20/02/2016 | 2.7 |
| 20/02/2016 | 2.8 |
| 20/02/2016 | 3 |
| 20/02/2016 | 3.3 |
| 20/02/2016 | 3.8 |
| 20/02/2016 | 4.2 |
| 20/02/2016 | 4.4 |
| 20/02/2016 | 4.6 |
| 20/02/2016 | 4.5 |
| 20/02/2016 | 4.4 |
| 20/02/2016 | 4.3 |
| 20/02/2016 | 4.2 |
| 20/02/2016 | 4.2 |
| 20/02/2016 | 4.6 |
| 20/02/2016 | 5 |
| 20/02/2016 | 4.9 |
| 20/02/2016 | 4.4 |
| 20/02/2016 | 3.9 |
| 20/02/2016 | 3.6 |
| 20/02/2016 | 3.3 |
| 21/02/2016 | 3.1 |
| 21/02/2016 | 2.8 |
| 21/02/2016 | 2.7 |
| 21/02/2016 | 2.6 |
| 21/02/2016 | 2.6 |
| 21/02/2016 | 2.6 |
| 21/02/2016 | 2.7 |
| 21/02/2016 | 2.9 |
| 21/02/2016 | 3.2 |
| 21/02/2016 | 3.5 |
| 21/02/2016 | 3.7 |
| 21/02/2016 | 3.9 |
| 21/02/2016 | 4 |
| 21/02/2016 | 3.9 |
| 21/02/2016 | 3.8 |
| 21/02/2016 | 3.7 |
| 21/02/2016 | 3.8 |
| 21/02/2016 | 4.2 |
| 21/02/2016 | 4.7 |
| 21/02/2016 | 4.6 |
| 21/02/2016 | 4.2 |
| 21/02/2016 | 3.9 |
| 21/02/2016 | 3.7 |
| 21/02/2016 | 3.3 |
| 22/02/2016 | 3.1 |
| 22/02/2016 | 2.8 |
| 22/02/2016 | 2.7 |
| 22/02/2016 | 2.7 |
| 22/02/2016 | 2.8 |
| 22/02/2016 | 3.1 |
| 22/02/2016 | 3.9 |
| 22/02/2016 | 4.6 |
| 22/02/2016 | 5 |
| 22/02/2016 | 5.2 |
| 22/02/2016 | 5.4 |
| 22/02/2016 | 5.4 |
| 22/02/2016 | 5.4 |
| 22/02/2016 | 5.3 |
| 22/02/2016 | 5.3 |
| 22/02/2016 | 5.2 |
| 22/02/2016 | 5.2 |
| 22/02/2016 | 5.6 |
| 22/02/2016 | 6 |
| 22/02/2016 | 5.9 |
| 22/02/2016 | 5.2 |
| 22/02/2016 | 4.5 |
| 22/02/2016 | 4 |
| 22/02/2016 | 3.6 |
| 23/02/2016 | 3.2 |
| 23/02/2016 | 3 |
| 23/02/2016 | 2.8 |
| 23/02/2016 | 2.8 |
| 23/02/2016 | 2.9 |
| 23/02/2016 | 3.2 |
| 23/02/2016 | 4 |
| 23/02/2016 | 4.7 |
| 23/02/2016 | 5.1 |
| 23/02/2016 | 5.3 |
| 23/02/2016 | 5.4 |
| 23/02/2016 | 5.5 |
| 23/02/2016 | 5.5 |
| 23/02/2016 | 5.4 |
| 23/02/2016 | 5.3 |
| 23/02/2016 | 5.2 |
| 23/02/2016 | 5.2 |
| 23/02/2016 | 5.7 |
| 23/02/2016 | 6.1 |
| 23/02/2016 | 5.9 |
| 23/02/2016 | 5.2 |
| 23/02/2016 | 4.5 |
| 23/02/2016 | 4.1 |
| 23/02/2016 | 3.6 |
| 24/02/2016 | 3.2 |
| 24/02/2016 | 3 |
| 24/02/2016 | 2.8 |
| 24/02/2016 | 2.8 |
| 24/02/2016 | 2.9 |
| 24/02/2016 | 3.2 |
| 24/02/2016 | 4 |
| 24/02/2016 | 4.7 |
| 24/02/2016 | 5.1 |
| 24/02/2016 | 5.3 |
| 24/02/2016 | 5.4 |
| 24/02/2016 | 5.5 |
| 24/02/2016 | 5.5 |
| 24/02/2016 | 5.4 |
| 24/02/2016 | 5.3 |
| 24/02/2016 | 5.2 |
| 24/02/2016 | 5.2 |
| 24/02/2016 | 5.6 |
| 24/02/2016 | 6.1 |
| 24/02/2016 | 5.9 |
| 24/02/2016 | 5.2 |
| 24/02/2016 | 4.5 |
| 24/02/2016 | 4.1 |
| 24/02/2016 | 3.6 |
| 25/02/2016 | 3.2 |
| 25/02/2016 | 3 |
| 25/02/2016 | 2.8 |
| 25/02/2016 | 2.8 |
| 25/02/2016 | 2.9 |
| 25/02/2016 | 3.2 |
| 25/02/2016 | 4 |
| 25/02/2016 | 4.7 |
| 25/02/2016 | 5.1 |
| 25/02/2016 | 5.3 |
| 25/02/2016 | 5.4 |
| 25/02/2016 | 5.5 |
| 25/02/2016 | 5.5 |
| 25/02/2016 | 5.4 |
| 25/02/2016 | 5.3 |
| 25/02/2016 | 5.2 |
| 25/02/2016 | 5.2 |
| 25/02/2016 | 5.6 |
| 25/02/2016 | 6 |
| 25/02/2016 | 5.9 |
| 25/02/2016 | 5.2 |
| 25/02/2016 | 4.5 |
| 25/02/2016 | 4.1 |
| 25/02/2016 | 3.6 |
| 26/02/2016 | 3.2 |
| 26/02/2016 | 3 |
| 26/02/2016 | 2.8 |
| 26/02/2016 | 2.8 |
| 26/02/2016 | 2.9 |
| 26/02/2016 | 3.2 |
| 26/02/2016 | 3.9 |
| 26/02/2016 | 4.6 |
| 26/02/2016 | 5 |
| 26/02/2016 | 5.3 |
| 26/02/2016 | 5.4 |
| 26/02/2016 | 5.4 |
| 26/02/2016 | 5.4 |
| 26/02/2016 | 5.3 |
| 26/02/2016 | 5.2 |
| 26/02/2016 | 5.1 |
| 26/02/2016 | 5 |
| 26/02/2016 | 5.4 |
| 26/02/2016 | 5.8 |
| 26/02/2016 | 5.6 |
| 26/02/2016 | 5 |
| 26/02/2016 | 4.3 |
| 26/02/2016 | 3.9 |
| 26/02/2016 | 3.5 |
| 27/02/2016 | 3.2 |
| 27/02/2016 | 3 |
| 27/02/2016 | 2.8 |
| 27/02/2016 | 2.7 |
| 27/02/2016 | 2.7 |
| 27/02/2016 | 2.8 |
| 27/02/2016 | 3 |
| 27/02/2016 | 3.3 |
| 27/02/2016 | 3.7 |
| 27/02/2016 | 4.1 |
| 27/02/2016 | 4.4 |
| 27/02/2016 | 4.5 |
| 27/02/2016 | 4.4 |
| 27/02/2016 | 4.3 |
| 27/02/2016 | 4.2 |
| 27/02/2016 | 4.1 |
| 27/02/2016 | 4.1 |
| 27/02/2016 | 4.4 |
| 27/02/2016 | 4.9 |
| 27/02/2016 | 4.9 |
| 27/02/2016 | 4.4 |
| 27/02/2016 | 3.9 |
| 27/02/2016 | 3.6 |
| 27/02/2016 | 3.3 |
| 28/02/2016 | 3 |
| 28/02/2016 | 2.8 |
| 28/02/2016 | 2.7 |
| 28/02/2016 | 2.6 |
| 28/02/2016 | 2.6 |
| 28/02/2016 | 2.6 |
| 28/02/2016 | 2.7 |
| 28/02/2016 | 2.9 |
| 28/02/2016 | 3.1 |
| 28/02/2016 | 3.5 |
| 28/02/2016 | 3.7 |
| 28/02/2016 | 3.8 |
| 28/02/2016 | 3.9 |
| 28/02/2016 | 3.8 |
| 28/02/2016 | 3.7 |
| 28/02/2016 | 3.6 |
| 28/02/2016 | 3.7 |
| 28/02/2016 | 4 |
| 28/02/2016 | 4.5 |
| 28/02/2016 | 4.5 |
| 28/02/2016 | 4.2 |
| 28/02/2016 | 3.8 |
| 28/02/2016 | 3.6 |
| 28/02/2016 | 3.3 |
| 29/02/2016 | 3 |
| 29/02/2016 | 2.8 |
| 29/02/2016 | 2.7 |
| 29/02/2016 | 2.6 |
| 29/02/2016 | 2.8 |
| 29/02/2016 | 3.1 |
| 29/02/2016 | 3.8 |
| 29/02/2016 | 4.5 |
| 29/02/2016 | 4.9 |
| 29/02/2016 | 5.1 |
| 29/02/2016 | 5.3 |
| 29/02/2016 | 5.3 |
| 29/02/2016 | 5.3 |
| 29/02/2016 | 5.2 |
| 29/02/2016 | 5.2 |
| 29/02/2016 | 5.1 |
| 29/02/2016 | 5.1 |
| 29/02/2016 | 5.4 |
| 29/02/2016 | 5.9 |
| 29/02/2016 | 5.8 |
| 29/02/2016 | 5.1 |
| 29/02/2016 | 4.5 |
| 29/02/2016 | 4 |
| 29/02/2016 | 3.5 |
| 01/03/2016 | 3.2 |
| 01/03/2016 | 2.9 |
| 01/03/2016 | 2.8 |
| 01/03/2016 | 2.7 |
| 01/03/2016 | 2.9 |
| 01/03/2016 | 3.2 |
| 01/03/2016 | 3.9 |
| 01/03/2016 | 4.6 |
| 01/03/2016 | 5 |
| 01/03/2016 | 5.2 |
| 01/03/2016 | 5.3 |
| 01/03/2016 | 5.4 |
| 01/03/2016 | 5.4 |
| 01/03/2016 | 5.3 |
| 01/03/2016 | 5.2 |
| 01/03/2016 | 5.1 |
| 01/03/2016 | 5.1 |
| 01/03/2016 | 5.4 |
| 01/03/2016 | 5.9 |
| 01/03/2016 | 5.9 |
| 01/03/2016 | 5.2 |
| 01/03/2016 | 4.5 |
| 01/03/2016 | 4 |
| 01/03/2016 | 3.5 |
| 02/03/2016 | 3.2 |
| 02/03/2016 | 2.9 |
| 02/03/2016 | 2.8 |
| 02/03/2016 | 2.8 |
| 02/03/2016 | 2.9 |
| 02/03/2016 | 3.2 |
| 02/03/2016 | 3.9 |
| 02/03/2016 | 4.6 |
| 02/03/2016 | 5 |
| 02/03/2016 | 5.2 |
| 02/03/2016 | 5.3 |
| 02/03/2016 | 5.4 |
| 02/03/2016 | 5.4 |
| 02/03/2016 | 5.3 |
| 02/03/2016 | 5.2 |
| 02/03/2016 | 5.1 |
| 02/03/2016 | 5.1 |
| 02/03/2016 | 5.4 |
| 02/03/2016 | 5.9 |
| 02/03/2016 | 5.8 |
| 02/03/2016 | 5.2 |
| 02/03/2016 | 4.5 |
| 02/03/2016 | 4 |
| 02/03/2016 | 3.5 |
| 03/03/2016 | 3.2 |
| 03/03/2016 | 2.9 |
| 03/03/2016 | 2.8 |
| 03/03/2016 | 2.8 |
| 03/03/2016 | 2.9 |
| 03/03/2016 | 3.2 |
| 03/03/2016 | 3.9 |
| 03/03/2016 | 4.6 |
| 03/03/2016 | 5 |
| 03/03/2016 | 5.2 |
| 03/03/2016 | 5.3 |
| 03/03/2016 | 5.4 |
| 03/03/2016 | 5.4 |
| 03/03/2016 | 5.3 |
| 03/03/2016 | 5.2 |
| 03/03/2016 | 5.1 |
| 03/03/2016 | 5.1 |
| 03/03/2016 | 5.4 |
| 03/03/2016 | 5.9 |
| 03/03/2016 | 5.8 |
| 03/03/2016 | 5.2 |
| 03/03/2016 | 4.5 |
| 03/03/2016 | 4 |
| 03/03/2016 | 3.5 |
| 04/03/2016 | 3.2 |
| 04/03/2016 | 2.9 |
| 04/03/2016 | 2.8 |
| 04/03/2016 | 2.7 |
| 04/03/2016 | 2.9 |
| 04/03/2016 | 3.2 |
| 04/03/2016 | 3.9 |
| 04/03/2016 | 4.5 |
| 04/03/2016 | 5 |
| 04/03/2016 | 5.2 |
| 04/03/2016 | 5.3 |
| 04/03/2016 | 5.3 |
| 04/03/2016 | 5.3 |
| 04/03/2016 | 5.2 |
| 04/03/2016 | 5.1 |
| 04/03/2016 | 4.9 |
| 04/03/2016 | 4.9 |
| 04/03/2016 | 5.2 |
| 04/03/2016 | 5.6 |
| 04/03/2016 | 5.6 |
| 04/03/2016 | 4.9 |
| 04/03/2016 | 4.2 |
| 04/03/2016 | 3.8 |
| 04/03/2016 | 3.4 |
| 05/03/2016 | 3.1 |
| 05/03/2016 | 2.9 |
| 05/03/2016 | 2.8 |
| 05/03/2016 | 2.7 |
| 05/03/2016 | 2.7 |
| 05/03/2016 | 2.8 |
| 05/03/2016 | 2.9 |
| 05/03/2016 | 3.2 |
| 05/03/2016 | 3.6 |
| 05/03/2016 | 4 |
| 05/03/2016 | 4.3 |
| 05/03/2016 | 4.4 |
| 05/03/2016 | 4.3 |
| 05/03/2016 | 4.2 |
| 05/03/2016 | 4.1 |
| 05/03/2016 | 4 |
| 05/03/2016 | 4 |
| 05/03/2016 | 4.2 |
| 05/03/2016 | 4.7 |
| 05/03/2016 | 4.8 |
| 05/03/2016 | 4.3 |
| 05/03/2016 | 3.8 |
| 05/03/2016 | 3.5 |
| 05/03/2016 | 3.2 |
| 06/03/2016 | 2.9 |
| 06/03/2016 | 2.7 |
| 06/03/2016 | 2.6 |
| 06/03/2016 | 2.6 |
| 06/03/2016 | 2.5 |
| 06/03/2016 | 2.6 |
| 06/03/2016 | 2.6 |
| 06/03/2016 | 2.8 |
| 06/03/2016 | 3.1 |
| 06/03/2016 | 3.4 |
| 06/03/2016 | 3.6 |
| 06/03/2016 | 3.8 |
| 06/03/2016 | 3.8 |
| 06/03/2016 | 3.7 |
| 06/03/2016 | 3.6 |
| 06/03/2016 | 3.5 |
| 06/03/2016 | 3.6 |
| 06/03/2016 | 3.9 |
| 06/03/2016 | 4.4 |
| 06/03/2016 | 4.5 |
| 06/03/2016 | 4.1 |
| 06/03/2016 | 3.8 |
| 06/03/2016 | 3.6 |
| 06/03/2016 | 3.2 |
| 07/03/2016 | 2.9 |
| 07/03/2016 | 2.7 |
| 07/03/2016 | 2.6 |
| 07/03/2016 | 2.6 |
| 07/03/2016 | 2.7 |
| 07/03/2016 | 3.1 |
| 07/03/2016 | 3.8 |
| 07/03/2016 | 4.4 |
| 07/03/2016 | 4.8 |
| 07/03/2016 | 5 |
| 07/03/2016 | 5.2 |
| 07/03/2016 | 5.2 |
| 07/03/2016 | 5.2 |
| 07/03/2016 | 5.1 |
| 07/03/2016 | 5.1 |
| 07/03/2016 | 5 |
| 07/03/2016 | 5 |
| 07/03/2016 | 5.2 |
| 07/03/2016 | 5.8 |
| 07/03/2016 | 5.8 |
| 07/03/2016 | 5.1 |
| 07/03/2016 | 4.4 |
| 07/03/2016 | 3.9 |
| 07/03/2016 | 3.4 |
| 08/03/2016 | 3.1 |
| 08/03/2016 | 2.9 |
| 08/03/2016 | 2.7 |
| 08/03/2016 | 2.7 |
| 08/03/2016 | 2.8 |
| 08/03/2016 | 3.2 |
| 08/03/2016 | 3.9 |
| 08/03/2016 | 4.5 |
| 08/03/2016 | 4.9 |
| 08/03/2016 | 5.1 |
| 08/03/2016 | 5.2 |
| 08/03/2016 | 5.3 |
| 08/03/2016 | 5.3 |
| 08/03/2016 | 5.2 |
| 08/03/2016 | 5.1 |
| 08/03/2016 | 5 |
| 08/03/2016 | 5 |
| 08/03/2016 | 5.2 |
| 08/03/2016 | 5.8 |
| 08/03/2016 | 5.8 |
| 08/03/2016 | 5.1 |
| 08/03/2016 | 4.4 |
| 08/03/2016 | 3.9 |
| 08/03/2016 | 3.4 |
| 09/03/2016 | 3.1 |
| 09/03/2016 | 2.9 |
| 09/03/2016 | 2.8 |
| 09/03/2016 | 2.7 |
| 09/03/2016 | 2.8 |
| 09/03/2016 | 3.2 |
| 09/03/2016 | 3.9 |
| 09/03/2016 | 4.5 |
| 09/03/2016 | 4.9 |
| 09/03/2016 | 5.1 |
| 09/03/2016 | 5.2 |
| 09/03/2016 | 5.3 |
| 09/03/2016 | 5.3 |
| 09/03/2016 | 5.2 |
| 09/03/2016 | 5.1 |
| 09/03/2016 | 5 |
| 09/03/2016 | 5 |
| 09/03/2016 | 5.2 |
| 09/03/2016 | 5.8 |
| 09/03/2016 | 5.8 |
| 09/03/2016 | 5.1 |
| 09/03/2016 | 4.4 |
| 09/03/2016 | 3.9 |
| 09/03/2016 | 3.5 |
| 10/03/2016 | 3.1 |
| 10/03/2016 | 2.9 |
| 10/03/2016 | 2.8 |
| 10/03/2016 | 2.7 |
| 10/03/2016 | 2.8 |
| 10/03/2016 | 3.2 |
| 10/03/2016 | 3.8 |
| 10/03/2016 | 4.5 |
| 10/03/2016 | 4.9 |
| 10/03/2016 | 5.1 |
| 10/03/2016 | 5.2 |
| 10/03/2016 | 5.3 |
| 10/03/2016 | 5.3 |
| 10/03/2016 | 5.2 |
| 10/03/2016 | 5.1 |
| 10/03/2016 | 5 |
| 10/03/2016 | 5 |
| 10/03/2016 | 5.2 |
| 10/03/2016 | 5.7 |
| 10/03/2016 | 5.8 |
| 10/03/2016 | 5.1 |
| 10/03/2016 | 4.4 |
| 10/03/2016 | 3.9 |
| 10/03/2016 | 3.5 |
| 11/03/2016 | 3.1 |
| 11/03/2016 | 2.9 |
| 11/03/2016 | 2.7 |
| 11/03/2016 | 2.7 |
| 11/03/2016 | 2.8 |
| 11/03/2016 | 3.1 |
| 11/03/2016 | 3.8 |
| 11/03/2016 | 4.4 |
| 11/03/2016 | 4.9 |
| 11/03/2016 | 5.1 |
| 11/03/2016 | 5.2 |
| 11/03/2016 | 5.2 |
| 11/03/2016 | 5.2 |
| 11/03/2016 | 5 |
| 11/03/2016 | 4.9 |
| 11/03/2016 | 4.8 |
| 11/03/2016 | 4.8 |
| 11/03/2016 | 5 |
| 11/03/2016 | 5.5 |
| 11/03/2016 | 5.5 |
| 11/03/2016 | 4.9 |
| 11/03/2016 | 4.2 |
| 11/03/2016 | 3.8 |
| 11/03/2016 | 3.4 |
| 12/03/2016 | 3.1 |
| 12/03/2016 | 2.9 |
| 12/03/2016 | 2.7 |
| 12/03/2016 | 2.7 |
| 12/03/2016 | 2.6 |
| 12/03/2016 | 2.7 |
| 12/03/2016 | 2.9 |
| 12/03/2016 | 3.1 |
| 12/03/2016 | 3.6 |
| 12/03/2016 | 4 |
| 12/03/2016 | 4.2 |
| 12/03/2016 | 4.3 |
| 12/03/2016 | 4.3 |
| 12/03/2016 | 4.1 |
| 12/03/2016 | 4 |
| 12/03/2016 | 3.9 |
| 12/03/2016 | 3.9 |
| 12/03/2016 | 4.1 |
| 12/03/2016 | 4.6 |
| 12/03/2016 | 4.8 |
| 12/03/2016 | 4.3 |
| 12/03/2016 | 3.8 |
| 12/03/2016 | 3.5 |
| 12/03/2016 | 3.2 |
| 13/03/2016 | 2.9 |
| 13/03/2016 | 2.7 |
| 13/03/2016 | 2.6 |
| 13/03/2016 | 2.5 |
| 13/03/2016 | 2.5 |
| 13/03/2016 | 2.5 |
| 13/03/2016 | 2.6 |
| 13/03/2016 | 2.7 |
| 13/03/2016 | 3 |
| 13/03/2016 | 3.3 |
| 13/03/2016 | 3.5 |
| 13/03/2016 | 3.7 |
| 13/03/2016 | 3.7 |
| 13/03/2016 | 3.6 |
| 13/03/2016 | 3.5 |
| 13/03/2016 | 3.5 |
| 13/03/2016 | 3.5 |
| 13/03/2016 | 3.7 |
| 13/03/2016 | 4.3 |
| 13/03/2016 | 4.4 |
| 13/03/2016 | 4.1 |
| 13/03/2016 | 3.7 |
| 13/03/2016 | 3.5 |
| 13/03/2016 | 3.2 |
| 14/03/2016 | 2.9 |
| 14/03/2016 | 2.7 |
| 14/03/2016 | 2.6 |
| 14/03/2016 | 2.6 |
| 14/03/2016 | 2.7 |
| 14/03/2016 | 3 |
| 14/03/2016 | 3.7 |
| 14/03/2016 | 4.3 |
| 14/03/2016 | 4.8 |
| 14/03/2016 | 5 |
| 14/03/2016 | 5.1 |
| 14/03/2016 | 5.1 |
| 14/03/2016 | 5.1 |
| 14/03/2016 | 5 |
| 14/03/2016 | 5 |
| 14/03/2016 | 4.9 |
| 14/03/2016 | 4.8 |
| 14/03/2016 | 5 |
| 14/03/2016 | 5.6 |
| 14/03/2016 | 5.7 |
| 14/03/2016 | 5 |
| 14/03/2016 | 4.3 |
| 14/03/2016 | 3.9 |
| 14/03/2016 | 3.4 |
| 15/03/2016 | 3 |
| 15/03/2016 | 2.8 |
| 15/03/2016 | 2.7 |
| 15/03/2016 | 2.7 |
| 15/03/2016 | 2.8 |
| 15/03/2016 | 3.1 |
| 15/03/2016 | 3.8 |
| 15/03/2016 | 4.4 |
| 15/03/2016 | 4.8 |
| 15/03/2016 | 5 |
| 15/03/2016 | 5.1 |
| 15/03/2016 | 5.2 |
| 15/03/2016 | 5.2 |
| 15/03/2016 | 5.1 |
| 15/03/2016 | 5 |
| 15/03/2016 | 4.9 |
| 15/03/2016 | 4.9 |
| 15/03/2016 | 5 |
| 15/03/2016 | 5.6 |
| 15/03/2016 | 5.7 |
| 15/03/2016 | 5 |
| 15/03/2016 | 4.3 |
| 15/03/2016 | 3.9 |
| 15/03/2016 | 3.4 |
| 16/03/2016 | 3.1 |
| 16/03/2016 | 2.8 |
| 16/03/2016 | 2.7 |
| 16/03/2016 | 2.7 |
| 16/03/2016 | 2.8 |
| 16/03/2016 | 3.1 |
| 16/03/2016 | 3.8 |
| 16/03/2016 | 4.4 |
| 16/03/2016 | 4.8 |
| 16/03/2016 | 5 |
| 16/03/2016 | 5.1 |
| 16/03/2016 | 5.2 |
| 16/03/2016 | 5.2 |
| 16/03/2016 | 5.1 |
| 16/03/2016 | 5 |
| 16/03/2016 | 4.9 |
| 16/03/2016 | 4.9 |
| 16/03/2016 | 5 |
| 16/03/2016 | 5.6 |
| 16/03/2016 | 5.7 |
| 16/03/2016 | 5 |
| 16/03/2016 | 4.3 |
| 16/03/2016 | 3.9 |
| 16/03/2016 | 3.4 |
| 17/03/2016 | 3.1 |
| 17/03/2016 | 2.8 |
| 17/03/2016 | 2.7 |
| 17/03/2016 | 2.7 |
| 17/03/2016 | 2.8 |
| 17/03/2016 | 3.1 |
| 17/03/2016 | 3.8 |
| 17/03/2016 | 4.4 |
| 17/03/2016 | 4.8 |
| 17/03/2016 | 5 |
| 17/03/2016 | 5.1 |
| 17/03/2016 | 5.2 |
| 17/03/2016 | 5.2 |
| 17/03/2016 | 5.1 |
| 17/03/2016 | 5 |
| 17/03/2016 | 4.9 |
| 17/03/2016 | 4.9 |
| 17/03/2016 | 5 |
| 17/03/2016 | 5.6 |
| 17/03/2016 | 5.7 |
| 17/03/2016 | 5 |
| 17/03/2016 | 4.3 |
| 17/03/2016 | 3.9 |
| 17/03/2016 | 3.4 |
| 18/03/2016 | 3.1 |
| 18/03/2016 | 2.8 |
| 18/03/2016 | 2.7 |
| 18/03/2016 | 2.7 |
| 18/03/2016 | 2.8 |
| 18/03/2016 | 3.1 |
| 18/03/2016 | 3.7 |
| 18/03/2016 | 4.4 |
| 18/03/2016 | 4.8 |
| 18/03/2016 | 5 |
| 18/03/2016 | 5.1 |
| 18/03/2016 | 5.2 |
| 18/03/2016 | 5.1 |
| 18/03/2016 | 5 |
| 18/03/2016 | 4.9 |
| 18/03/2016 | 4.7 |
| 18/03/2016 | 4.7 |
| 18/03/2016 | 4.8 |
| 18/03/2016 | 5.3 |
| 18/03/2016 | 5.4 |
| 18/03/2016 | 4.8 |
| 18/03/2016 | 4.1 |
| 18/03/2016 | 3.7 |
| 18/03/2016 | 3.3 |
| 19/03/2016 | 3 |
| 19/03/2016 | 2.8 |
| 19/03/2016 | 2.7 |
| 19/03/2016 | 2.6 |
| 19/03/2016 | 2.6 |
| 19/03/2016 | 2.7 |
| 19/03/2016 | 2.8 |
| 19/03/2016 | 3.1 |
| 19/03/2016 | 3.5 |
| 19/03/2016 | 3.9 |
| 19/03/2016 | 4.1 |
| 19/03/2016 | 4.2 |
| 19/03/2016 | 4.2 |
| 19/03/2016 | 4 |
| 19/03/2016 | 3.9 |
| 19/03/2016 | 3.8 |
| 19/03/2016 | 3.8 |
| 19/03/2016 | 4 |
| 19/03/2016 | 4.5 |
| 19/03/2016 | 4.6 |
| 19/03/2016 | 4.2 |
| 19/03/2016 | 3.7 |
| 19/03/2016 | 3.4 |
| 19/03/2016 | 3.1 |
| 20/03/2016 | 2.8 |
| 20/03/2016 | 2.6 |
| 20/03/2016 | 2.5 |
| 20/03/2016 | 2.5 |
| 20/03/2016 | 2.5 |
| 20/03/2016 | 2.5 |
| 20/03/2016 | 2.5 |
| 20/03/2016 | 2.7 |
| 20/03/2016 | 3 |
| 20/03/2016 | 3.3 |
| 20/03/2016 | 3.5 |
| 20/03/2016 | 3.6 |
| 20/03/2016 | 3.7 |
| 20/03/2016 | 3.6 |
| 20/03/2016 | 3.5 |
| 20/03/2016 | 3.4 |
| 20/03/2016 | 3.4 |
| 20/03/2016 | 3.6 |
| 20/03/2016 | 4.2 |
| 20/03/2016 | 4.3 |
| 20/03/2016 | 4 |
| 20/03/2016 | 3.7 |
| 20/03/2016 | 3.4 |
| 20/03/2016 | 3.1 |
| 21/03/2016 | 2.8 |
| 21/03/2016 | 2.6 |
| 21/03/2016 | 2.5 |
| 21/03/2016 | 2.5 |
| 21/03/2016 | 2.6 |
| 21/03/2016 | 2.9 |
| 21/03/2016 | 3.5 |
| 21/03/2016 | 4 |
| 21/03/2016 | 4.5 |
| 21/03/2016 | 4.8 |
| 21/03/2016 | 4.9 |
| 21/03/2016 | 5 |
| 21/03/2016 | 5 |
| 21/03/2016 | 4.9 |
| 21/03/2016 | 4.8 |
| 21/03/2016 | 4.7 |
| 21/03/2016 | 4.7 |
| 21/03/2016 | 4.8 |
| 21/03/2016 | 5.3 |
| 21/03/2016 | 5.4 |
| 21/03/2016 | 4.8 |
| 21/03/2016 | 4.2 |
| 21/03/2016 | 3.7 |
| 21/03/2016 | 3.3 |
| 22/03/2016 | 3 |
| 22/03/2016 | 2.7 |
| 22/03/2016 | 2.6 |
| 22/03/2016 | 2.6 |
| 22/03/2016 | 2.7 |
| 22/03/2016 | 3 |
| 22/03/2016 | 3.6 |
| 22/03/2016 | 4.1 |
| 22/03/2016 | 4.6 |
| 22/03/2016 | 4.8 |
| 22/03/2016 | 4.9 |
| 22/03/2016 | 5 |
| 22/03/2016 | 5 |
| 22/03/2016 | 4.9 |
| 22/03/2016 | 4.8 |
| 22/03/2016 | 4.7 |
| 22/03/2016 | 4.7 |
| 22/03/2016 | 4.9 |
| 22/03/2016 | 5.3 |
| 22/03/2016 | 5.4 |
| 22/03/2016 | 4.8 |
| 22/03/2016 | 4.2 |
| 22/03/2016 | 3.7 |
| 22/03/2016 | 3.3 |
| 23/03/2016 | 3 |
| 23/03/2016 | 2.8 |
| 23/03/2016 | 2.6 |
| 23/03/2016 | 2.6 |
| 23/03/2016 | 2.7 |
| 23/03/2016 | 3 |
| 23/03/2016 | 3.6 |
| 23/03/2016 | 4.1 |
| 23/03/2016 | 4.6 |
| 23/03/2016 | 4.8 |
| 23/03/2016 | 5 |
| 23/03/2016 | 5 |
| 23/03/2016 | 5 |
| 23/03/2016 | 4.9 |
| 23/03/2016 | 4.8 |
| 23/03/2016 | 4.7 |
| 23/03/2016 | 4.7 |
| 23/03/2016 | 4.9 |
| 23/03/2016 | 5.3 |
| 23/03/2016 | 5.3 |
| 23/03/2016 | 4.8 |
| 23/03/2016 | 4.2 |
| 23/03/2016 | 3.7 |
| 23/03/2016 | 3.3 |
| 24/03/2016 | 3 |
| 24/03/2016 | 2.8 |
| 24/03/2016 | 2.6 |
| 24/03/2016 | 2.6 |
| 24/03/2016 | 2.7 |
| 24/03/2016 | 3 |
| 24/03/2016 | 3.5 |
| 24/03/2016 | 4.1 |
| 24/03/2016 | 4.6 |
| 24/03/2016 | 4.8 |
| 24/03/2016 | 5 |
| 24/03/2016 | 5 |
| 24/03/2016 | 5 |
| 24/03/2016 | 4.9 |
| 24/03/2016 | 4.8 |
| 24/03/2016 | 4.7 |
| 24/03/2016 | 4.7 |
| 24/03/2016 | 4.9 |
| 24/03/2016 | 5.3 |
| 24/03/2016 | 5.3 |
| 24/03/2016 | 4.8 |
| 24/03/2016 | 4.2 |
| 24/03/2016 | 3.7 |
| 24/03/2016 | 3.3 |
| 25/03/2016 | 2.8 |
| 25/03/2016 | 2.6 |
| 25/03/2016 | 2.5 |
| 25/03/2016 | 2.5 |
| 25/03/2016 | 2.5 |
| 25/03/2016 | 2.5 |
| 25/03/2016 | 2.5 |
| 25/03/2016 | 2.7 |
| 25/03/2016 | 3 |
| 25/03/2016 | 3.3 |
| 25/03/2016 | 3.5 |
| 25/03/2016 | 3.6 |
| 25/03/2016 | 3.6 |
| 25/03/2016 | 3.4 |
| 25/03/2016 | 3.3 |
| 25/03/2016 | 3.3 |
| 25/03/2016 | 3.3 |
| 25/03/2016 | 3.4 |
| 25/03/2016 | 3.8 |
| 25/03/2016 | 4 |
| 25/03/2016 | 3.7 |
| 25/03/2016 | 3.4 |
| 25/03/2016 | 3.2 |
| 25/03/2016 | 3 |
| 26/03/2016 | 2.9 |
| 26/03/2016 | 2.7 |
| 26/03/2016 | 2.6 |
| 26/03/2016 | 2.5 |
| 26/03/2016 | 2.5 |
| 26/03/2016 | 2.6 |
| 26/03/2016 | 2.6 |
| 26/03/2016 | 2.9 |
| 26/03/2016 | 3.3 |
| 26/03/2016 | 3.7 |
| 26/03/2016 | 4 |
| 26/03/2016 | 4.1 |
| 26/03/2016 | 4 |
| 26/03/2016 | 3.9 |
| 26/03/2016 | 3.8 |
| 26/03/2016 | 3.7 |
| 26/03/2016 | 3.7 |
| 26/03/2016 | 3.8 |
| 26/03/2016 | 4.2 |
| 26/03/2016 | 4.3 |
| 26/03/2016 | 4 |
| 26/03/2016 | 3.6 |
| 26/03/2016 | 3.3 |
| 26/03/2016 | 3 |
| 27/03/2016 | 2.8 |
| 27/03/2016 | 2.6 |
| 27/03/2016 | 0 |
| 27/03/2016 | 2.5 |
| 27/03/2016 | 2.5 |
| 27/03/2016 | 2.5 |
| 27/03/2016 | 2.5 |
| 27/03/2016 | 2.6 |
| 27/03/2016 | 2.9 |
| 27/03/2016 | 3.2 |
| 27/03/2016 | 3.4 |
| 27/03/2016 | 3.5 |
| 27/03/2016 | 3.5 |
| 27/03/2016 | 3.4 |
| 27/03/2016 | 3.2 |
| 27/03/2016 | 3.2 |
| 27/03/2016 | 3.2 |
| 27/03/2016 | 3.2 |
| 27/03/2016 | 3.5 |
| 27/03/2016 | 3.7 |
| 27/03/2016 | 3.8 |
| 27/03/2016 | 3.5 |
| 27/03/2016 | 3.3 |
| 27/03/2016 | 3 |
| 28/03/2016 | 2.8 |
| 28/03/2016 | 2.6 |
| 28/03/2016 | 2.5 |
| 28/03/2016 | 2.5 |
| 28/03/2016 | 2.5 |
| 28/03/2016 | 2.5 |
| 28/03/2016 | 2.5 |
| 28/03/2016 | 2.6 |
| 28/03/2016 | 2.9 |
| 28/03/2016 | 3.2 |
| 28/03/2016 | 3.4 |
| 28/03/2016 | 3.5 |
| 28/03/2016 | 3.5 |
| 28/03/2016 | 3.4 |
| 28/03/2016 | 3.2 |
| 28/03/2016 | 3.2 |
| 28/03/2016 | 3.1 |
| 28/03/2016 | 3.2 |
| 28/03/2016 | 3.4 |
| 28/03/2016 | 3.7 |
| 28/03/2016 | 3.7 |
| 28/03/2016 | 3.5 |
| 28/03/2016 | 3.3 |
| 28/03/2016 | 3 |
| 29/03/2016 | 3 |
| 29/03/2016 | 2.7 |
| 29/03/2016 | 2.6 |
| 29/03/2016 | 2.6 |
| 29/03/2016 | 2.7 |
| 29/03/2016 | 3 |
| 29/03/2016 | 3.5 |
| 29/03/2016 | 4.1 |
| 29/03/2016 | 4.5 |
| 29/03/2016 | 4.8 |
| 29/03/2016 | 5 |
| 29/03/2016 | 5 |
| 29/03/2016 | 5 |
| 29/03/2016 | 4.9 |
| 29/03/2016 | 4.8 |
| 29/03/2016 | 4.7 |
| 29/03/2016 | 4.6 |
| 29/03/2016 | 4.5 |
| 29/03/2016 | 4.9 |
| 29/03/2016 | 5.1 |
| 29/03/2016 | 4.8 |
| 29/03/2016 | 4.3 |
| 29/03/2016 | 3.8 |
| 29/03/2016 | 3.3 |
| 30/03/2016 | 3 |
| 30/03/2016 | 2.7 |
| 30/03/2016 | 2.6 |
| 30/03/2016 | 2.6 |
| 30/03/2016 | 2.7 |
| 30/03/2016 | 3 |
| 30/03/2016 | 3.5 |
| 30/03/2016 | 4.1 |
| 30/03/2016 | 4.5 |
| 30/03/2016 | 4.8 |
| 30/03/2016 | 5 |
| 30/03/2016 | 5 |
| 30/03/2016 | 5 |
| 30/03/2016 | 4.9 |
| 30/03/2016 | 4.8 |
| 30/03/2016 | 4.7 |
| 30/03/2016 | 4.6 |
| 30/03/2016 | 4.5 |
| 30/03/2016 | 4.8 |
| 30/03/2016 | 5.1 |
| 30/03/2016 | 4.8 |
| 30/03/2016 | 4.3 |
| 30/03/2016 | 3.8 |
| 30/03/2016 | 3.3 |
| 31/03/2016 | 3 |
| 31/03/2016 | 2.7 |
| 31/03/2016 | 2.6 |
| 31/03/2016 | 2.6 |
| 31/03/2016 | 2.7 |
| 31/03/2016 | 3 |
| 31/03/2016 | 3.5 |
| 31/03/2016 | 4.1 |
| 31/03/2016 | 4.5 |
| 31/03/2016 | 4.8 |
| 31/03/2016 | 5 |
| 31/03/2016 | 5 |
| 31/03/2016 | 5 |
| 31/03/2016 | 4.9 |
| 31/03/2016 | 4.8 |
| 31/03/2016 | 4.7 |
| 31/03/2016 | 4.6 |
| 31/03/2016 | 4.5 |
| 31/03/2016 | 4.8 |
| 31/03/2016 | 5 |
| 31/03/2016 | 4.8 |
| 31/03/2016 | 4.3 |
| 31/03/2016 | 3.8 |
| 31/03/2016 | 3.3 |
| 01/04/2016 | 3 |
| 01/04/2016 | 2.7 |
| 01/04/2016 | 2.6 |
| 01/04/2016 | 2.6 |
| 01/04/2016 | 2.7 |
| 01/04/2016 | 2.9 |
| 01/04/2016 | 3.5 |
| 01/04/2016 | 4 |
| 01/04/2016 | 4.5 |
| 01/04/2016 | 4.8 |
| 01/04/2016 | 4.9 |
| 01/04/2016 | 5 |
| 01/04/2016 | 5 |
| 01/04/2016 | 4.8 |
| 01/04/2016 | 4.7 |
| 01/04/2016 | 4.6 |
| 01/04/2016 | 4.4 |
| 01/04/2016 | 4.4 |
| 01/04/2016 | 4.6 |
| 01/04/2016 | 4.8 |
| 01/04/2016 | 4.6 |
| 01/04/2016 | 4 |
| 01/04/2016 | 3.6 |
| 01/04/2016 | 3.3 |
| 02/04/2016 | 2.9 |
| 02/04/2016 | 2.7 |
| 02/04/2016 | 2.6 |
| 02/04/2016 | 2.5 |
| 02/04/2016 | 2.5 |
| 02/04/2016 | 2.6 |
| 02/04/2016 | 2.6 |
| 02/04/2016 | 2.8 |
| 02/04/2016 | 3.3 |
| 02/04/2016 | 3.7 |
| 02/04/2016 | 4 |
| 02/04/2016 | 4.1 |
| 02/04/2016 | 4.1 |
| 02/04/2016 | 3.9 |
| 02/04/2016 | 3.8 |
| 02/04/2016 | 3.7 |
| 02/04/2016 | 3.6 |
| 02/04/2016 | 3.6 |
| 02/04/2016 | 3.8 |
| 02/04/2016 | 4.1 |
| 02/04/2016 | 4 |
| 02/04/2016 | 3.6 |
| 02/04/2016 | 3.3 |
| 02/04/2016 | 3 |
| 03/04/2016 | 2.7 |
| 03/04/2016 | 2.6 |
| 03/04/2016 | 2.5 |
| 03/04/2016 | 2.4 |
| 03/04/2016 | 2.4 |
| 03/04/2016 | 2.4 |
| 03/04/2016 | 2.5 |
| 03/04/2016 | 2.6 |
| 03/04/2016 | 2.9 |
| 03/04/2016 | 3.2 |
| 03/04/2016 | 3.4 |
| 03/04/2016 | 3.6 |
| 03/04/2016 | 3.6 |
| 03/04/2016 | 3.5 |
| 03/04/2016 | 3.4 |
| 03/04/2016 | 3.3 |
| 03/04/2016 | 3.3 |
| 03/04/2016 | 3.4 |
| 03/04/2016 | 3.7 |
| 03/04/2016 | 3.8 |
| 03/04/2016 | 3.9 |
| 03/04/2016 | 3.7 |
| 03/04/2016 | 3.4 |
| 03/04/2016 | 3 |
| 04/04/2016 | 2.7 |
| 04/04/2016 | 2.5 |
| 04/04/2016 | 2.5 |
| 04/04/2016 | 2.4 |
| 04/04/2016 | 2.6 |
| 04/04/2016 | 2.9 |
| 04/04/2016 | 3.5 |
| 04/04/2016 | 4.1 |
| 04/04/2016 | 4.6 |
| 04/04/2016 | 4.8 |
| 04/04/2016 | 4.9 |
| 04/04/2016 | 5 |
| 04/04/2016 | 5 |
| 04/04/2016 | 4.9 |
| 04/04/2016 | 4.8 |
| 04/04/2016 | 4.7 |
| 04/04/2016 | 4.6 |
| 04/04/2016 | 4.6 |
| 04/04/2016 | 4.8 |
| 04/04/2016 | 5 |
| 04/04/2016 | 4.8 |
| 04/04/2016 | 4.3 |
| 04/04/2016 | 3.7 |
| 04/04/2016 | 3.2 |
| 05/04/2016 | 2.9 |
| 05/04/2016 | 2.7 |
| 05/04/2016 | 2.6 |
| 05/04/2016 | 2.5 |
| 05/04/2016 | 2.7 |
| 05/04/2016 | 3 |
| 05/04/2016 | 3.6 |
| 05/04/2016 | 4.2 |
| 05/04/2016 | 4.6 |
| 05/04/2016 | 4.9 |
| 05/04/2016 | 5 |
| 05/04/2016 | 5 |
| 05/04/2016 | 5 |
| 05/04/2016 | 4.9 |
| 05/04/2016 | 4.8 |
| 05/04/2016 | 4.7 |
| 05/04/2016 | 4.6 |
| 05/04/2016 | 4.6 |
| 05/04/2016 | 4.8 |
| 05/04/2016 | 5 |
| 05/04/2016 | 4.8 |
| 05/04/2016 | 4.3 |
| 05/04/2016 | 3.7 |
| 05/04/2016 | 3.3 |
| 06/04/2016 | 2.9 |
| 06/04/2016 | 2.7 |
| 06/04/2016 | 2.6 |
| 06/04/2016 | 2.5 |
| 06/04/2016 | 2.7 |
| 06/04/2016 | 3 |
| 06/04/2016 | 3.6 |
| 06/04/2016 | 4.2 |
| 06/04/2016 | 4.7 |
| 06/04/2016 | 4.9 |
| 06/04/2016 | 5 |
| 06/04/2016 | 5 |
| 06/04/2016 | 5 |
| 06/04/2016 | 4.9 |
| 06/04/2016 | 4.8 |
| 06/04/2016 | 4.7 |
| 06/04/2016 | 4.6 |
| 06/04/2016 | 4.6 |
| 06/04/2016 | 4.8 |
| 06/04/2016 | 4.9 |
| 06/04/2016 | 4.8 |
| 06/04/2016 | 4.3 |
| 06/04/2016 | 3.7 |
| 06/04/2016 | 3.3 |
| 07/04/2016 | 2.9 |
| 07/04/2016 | 2.7 |
| 07/04/2016 | 2.6 |
| 07/04/2016 | 2.5 |
| 07/04/2016 | 2.7 |
| 07/04/2016 | 3 |
| 07/04/2016 | 3.6 |
| 07/04/2016 | 4.2 |
| 07/04/2016 | 4.6 |
| 07/04/2016 | 4.9 |
| 07/04/2016 | 5 |
| 07/04/2016 | 5 |
| 07/04/2016 | 5 |
| 07/04/2016 | 4.9 |
| 07/04/2016 | 4.8 |
| 07/04/2016 | 4.7 |
| 07/04/2016 | 4.7 |
| 07/04/2016 | 4.6 |
| 07/04/2016 | 4.8 |
| 07/04/2016 | 4.9 |
| 07/04/2016 | 4.8 |
| 07/04/2016 | 4.3 |
| 07/04/2016 | 3.7 |
| 07/04/2016 | 3.3 |
| 08/04/2016 | 2.9 |
| 08/04/2016 | 2.7 |
| 08/04/2016 | 2.6 |
| 08/04/2016 | 2.5 |
| 08/04/2016 | 2.6 |
| 08/04/2016 | 2.9 |
| 08/04/2016 | 3.6 |
| 08/04/2016 | 4.2 |
| 08/04/2016 | 4.6 |
| 08/04/2016 | 4.8 |
| 08/04/2016 | 5 |
| 08/04/2016 | 5 |
| 08/04/2016 | 5 |
| 08/04/2016 | 4.8 |
| 08/04/2016 | 4.7 |
| 08/04/2016 | 4.6 |
| 08/04/2016 | 4.5 |
| 08/04/2016 | 4.5 |
| 08/04/2016 | 4.6 |
| 08/04/2016 | 4.6 |
| 08/04/2016 | 4.5 |
| 08/04/2016 | 4.1 |
| 08/04/2016 | 3.6 |
| 08/04/2016 | 3.2 |
| 09/04/2016 | 2.9 |
| 09/04/2016 | 2.6 |
| 09/04/2016 | 2.5 |
| 09/04/2016 | 2.5 |
| 09/04/2016 | 2.5 |
| 09/04/2016 | 2.5 |
| 09/04/2016 | 2.7 |
| 09/04/2016 | 2.9 |
| 09/04/2016 | 3.4 |
| 09/04/2016 | 3.7 |
| 09/04/2016 | 4 |
| 09/04/2016 | 4.1 |
| 09/04/2016 | 4.1 |
| 09/04/2016 | 3.9 |
| 09/04/2016 | 3.8 |
| 09/04/2016 | 3.7 |
| 09/04/2016 | 3.6 |
| 09/04/2016 | 3.6 |
| 09/04/2016 | 3.8 |
| 09/04/2016 | 4 |
| 09/04/2016 | 4 |
| 09/04/2016 | 3.6 |
| 09/04/2016 | 3.3 |
| 09/04/2016 | 3 |
| 09/04/2016 | 2.7 |
| 10/04/2016 | 2.5 |
| 10/04/2016 | 2.4 |
| 10/04/2016 | 2.4 |
| 10/04/2016 | 2.4 |
| 10/04/2016 | 2.4 |
| 10/04/2016 | 2.4 |
| 10/04/2016 | 2.6 |
| 10/04/2016 | 2.9 |
| 10/04/2016 | 3.1 |
| 10/04/2016 | 3.3 |
| 10/04/2016 | 3.5 |
| 10/04/2016 | 3.6 |
| 10/04/2016 | 3.4 |
| 10/04/2016 | 3.3 |
| 10/04/2016 | 3.3 |
| 10/04/2016 | 3.3 |
| 10/04/2016 | 3.3 |
| 10/04/2016 | 3.5 |
| 10/04/2016 | 3.7 |
| 10/04/2016 | 3.8 |
| 10/04/2016 | 3.6 |
| 10/04/2016 | 3.3 |
| 10/04/2016 | 3 |
| 10/04/2016 | 2.7 |
| 11/04/2016 | 2.5 |
| 11/04/2016 | 2.4 |
| 11/04/2016 | 2.4 |
| 11/04/2016 | 2.5 |
| 11/04/2016 | 2.8 |
| 11/04/2016 | 3.5 |
| 11/04/2016 | 4.1 |
| 11/04/2016 | 4.5 |
| 11/04/2016 | 4.7 |
| 11/04/2016 | 4.8 |
| 11/04/2016 | 4.9 |
| 11/04/2016 | 4.9 |
| 11/04/2016 | 4.8 |
| 11/04/2016 | 4.7 |
| 11/04/2016 | 4.6 |
| 11/04/2016 | 4.5 |
| 11/04/2016 | 4.6 |
| 11/04/2016 | 4.7 |
| 11/04/2016 | 4.7 |
| 11/04/2016 | 4.7 |
| 11/04/2016 | 4.2 |
| 11/04/2016 | 3.6 |
| 11/04/2016 | 3.2 |
| 11/04/2016 | 2.8 |
| 12/04/2016 | 2.6 |
| 12/04/2016 | 2.5 |
| 12/04/2016 | 2.5 |
| 12/04/2016 | 2.6 |
| 12/04/2016 | 2.9 |
| 12/04/2016 | 3.5 |
| 12/04/2016 | 4.1 |
| 12/04/2016 | 4.6 |
| 12/04/2016 | 4.8 |
| 12/04/2016 | 4.9 |
| 12/04/2016 | 4.9 |
| 12/04/2016 | 4.9 |
| 12/04/2016 | 4.8 |
| 12/04/2016 | 4.7 |
| 12/04/2016 | 4.7 |
| 12/04/2016 | 4.6 |
| 12/04/2016 | 4.6 |
| 12/04/2016 | 4.7 |
| 12/04/2016 | 4.7 |
| 12/04/2016 | 4.7 |
| 12/04/2016 | 4.2 |
| 12/04/2016 | 3.6 |
| 12/04/2016 | 3.2 |
| 12/04/2016 | 2.8 |
| 13/04/2016 | 2.6 |
| 13/04/2016 | 2.5 |
| 13/04/2016 | 2.5 |
| 13/04/2016 | 2.6 |
| 13/04/2016 | 2.9 |
| 13/04/2016 | 3.5 |
| 13/04/2016 | 4.2 |
| 13/04/2016 | 4.6 |
| 13/04/2016 | 4.8 |
| 13/04/2016 | 4.9 |
| 13/04/2016 | 4.9 |
| 13/04/2016 | 4.9 |
| 13/04/2016 | 4.8 |
| 13/04/2016 | 4.7 |
| 13/04/2016 | 4.7 |
| 13/04/2016 | 4.6 |
| 13/04/2016 | 4.6 |
| 13/04/2016 | 4.7 |
| 13/04/2016 | 4.7 |
| 13/04/2016 | 4.6 |
| 13/04/2016 | 4.2 |
| 13/04/2016 | 3.7 |
| 13/04/2016 | 3.2 |
| 13/04/2016 | 2.8 |
| 14/04/2016 | 2.6 |
| 14/04/2016 | 2.5 |
| 14/04/2016 | 2.5 |
| 14/04/2016 | 2.6 |
| 14/04/2016 | 2.9 |
| 14/04/2016 | 3.5 |
| 14/04/2016 | 4.1 |
| 14/04/2016 | 4.6 |
| 14/04/2016 | 4.8 |
| 14/04/2016 | 4.9 |
| 14/04/2016 | 4.9 |
| 14/04/2016 | 4.9 |
| 14/04/2016 | 4.8 |
| 14/04/2016 | 4.8 |
| 14/04/2016 | 4.7 |
| 14/04/2016 | 4.6 |
| 14/04/2016 | 4.6 |
| 14/04/2016 | 4.6 |
| 14/04/2016 | 4.7 |
| 14/04/2016 | 4.6 |
| 14/04/2016 | 4.2 |
| 14/04/2016 | 3.6 |
| 14/04/2016 | 3.2 |
| 14/04/2016 | 2.8 |
| 15/04/2016 | 2.6 |
| 15/04/2016 | 2.5 |
| 15/04/2016 | 2.5 |
| 15/04/2016 | 2.6 |
| 15/04/2016 | 2.9 |
| 15/04/2016 | 3.5 |
| 15/04/2016 | 4.1 |
| 15/04/2016 | 4.6 |
| 15/04/2016 | 4.8 |
| 15/04/2016 | 4.9 |
| 15/04/2016 | 4.9 |
| 15/04/2016 | 4.9 |
| 15/04/2016 | 4.7 |
| 15/04/2016 | 4.6 |
| 15/04/2016 | 4.5 |
| 15/04/2016 | 4.4 |
| 15/04/2016 | 4.4 |
| 15/04/2016 | 4.4 |
| 15/04/2016 | 4.4 |
| 15/04/2016 | 4.4 |
| 15/04/2016 | 4 |
| 15/04/2016 | 3.5 |
| 15/04/2016 | 3.1 |
| 15/04/2016 | 2.8 |
| 16/04/2016 | 2.6 |
| 16/04/2016 | 2.5 |
| 16/04/2016 | 2.4 |
| 16/04/2016 | 2.4 |
| 16/04/2016 | 2.5 |
| 16/04/2016 | 2.6 |
| 16/04/2016 | 2.9 |
| 16/04/2016 | 3.3 |
| 16/04/2016 | 3.7 |
| 16/04/2016 | 3.9 |
| 16/04/2016 | 4 |
| 16/04/2016 | 4 |
| 16/04/2016 | 3.8 |
| 16/04/2016 | 3.7 |
| 16/04/2016 | 3.6 |
| 16/04/2016 | 3.6 |
| 16/04/2016 | 3.6 |
| 16/04/2016 | 3.7 |
| 16/04/2016 | 3.8 |
| 16/04/2016 | 3.9 |
| 16/04/2016 | 3.6 |
| 16/04/2016 | 3.2 |
| 16/04/2016 | 2.9 |
| 16/04/2016 | 2.6 |
| 17/04/2016 | 2.4 |
| 17/04/2016 | 2.4 |
| 17/04/2016 | 2.3 |
| 17/04/2016 | 2.3 |
| 17/04/2016 | 2.3 |
| 17/04/2016 | 2.4 |
| 17/04/2016 | 2.5 |
| 17/04/2016 | 2.8 |
| 17/04/2016 | 3.1 |
| 17/04/2016 | 3.3 |
| 17/04/2016 | 3.4 |
| 17/04/2016 | 3.5 |
| 17/04/2016 | 3.4 |
| 17/04/2016 | 3.3 |
| 17/04/2016 | 3.2 |
| 17/04/2016 | 3.2 |
| 17/04/2016 | 3.3 |
| 17/04/2016 | 3.4 |
| 17/04/2016 | 3.5 |
| 17/04/2016 | 3.7 |
| 17/04/2016 | 3.5 |
| 17/04/2016 | 3.2 |
| 17/04/2016 | 2.9 |
| 17/04/2016 | 2.6 |
| 18/04/2016 | 2.4 |
| 18/04/2016 | 2.3 |
| 18/04/2016 | 2.3 |
| 18/04/2016 | 2.5 |
| 18/04/2016 | 2.8 |
| 18/04/2016 | 3.4 |
| 18/04/2016 | 4 |
| 18/04/2016 | 4.4 |
| 18/04/2016 | 4.6 |
| 18/04/2016 | 4.8 |
| 18/04/2016 | 4.8 |
| 18/04/2016 | 4.8 |
| 18/04/2016 | 4.7 |
| 18/04/2016 | 4.6 |
| 18/04/2016 | 4.6 |
| 18/04/2016 | 4.5 |
| 18/04/2016 | 4.5 |
| 18/04/2016 | 4.5 |
| 18/04/2016 | 4.5 |
| 18/04/2016 | 4.5 |
| 18/04/2016 | 4.1 |
| 18/04/2016 | 3.6 |
| 18/04/2016 | 3.1 |
| 18/04/2016 | 2.8 |
| 19/04/2016 | 2.5 |
| 19/04/2016 | 2.4 |
| 19/04/2016 | 2.4 |
| 19/04/2016 | 2.6 |
| 19/04/2016 | 2.9 |
| 19/04/2016 | 3.4 |
| 19/04/2016 | 4.1 |
| 19/04/2016 | 4.5 |
| 19/04/2016 | 4.7 |
| 19/04/2016 | 4.8 |
| 19/04/2016 | 4.8 |
| 19/04/2016 | 4.8 |
| 19/04/2016 | 4.8 |
| 19/04/2016 | 4.7 |
| 19/04/2016 | 4.6 |
| 19/04/2016 | 4.5 |
| 19/04/2016 | 4.6 |
| 19/04/2016 | 4.5 |
| 19/04/2016 | 4.5 |
| 19/04/2016 | 4.5 |
| 19/04/2016 | 4.1 |
| 19/04/2016 | 3.6 |
| 19/04/2016 | 3.1 |
| 19/04/2016 | 2.8 |
| 20/04/2016 | 2.6 |
| 20/04/2016 | 2.5 |
| 20/04/2016 | 2.4 |
| 20/04/2016 | 2.6 |
| 20/04/2016 | 2.9 |
| 20/04/2016 | 3.4 |
| 20/04/2016 | 4.1 |
| 20/04/2016 | 4.5 |
| 20/04/2016 | 4.7 |
| 20/04/2016 | 4.8 |
| 20/04/2016 | 4.8 |
| 20/04/2016 | 4.9 |
| 20/04/2016 | 4.8 |
| 20/04/2016 | 4.7 |
| 20/04/2016 | 4.6 |
| 20/04/2016 | 4.5 |
| 20/04/2016 | 4.6 |
| 20/04/2016 | 4.5 |
| 20/04/2016 | 4.5 |
| 20/04/2016 | 4.5 |
| 20/04/2016 | 4.1 |
| 20/04/2016 | 3.6 |
| 20/04/2016 | 3.1 |
| 20/04/2016 | 2.8 |
| 21/04/2016 | 2.6 |
| 21/04/2016 | 2.5 |
| 21/04/2016 | 2.4 |
| 21/04/2016 | 2.6 |
| 21/04/2016 | 2.9 |
| 21/04/2016 | 3.4 |
| 21/04/2016 | 4.1 |
| 21/04/2016 | 4.5 |
| 21/04/2016 | 4.7 |
| 21/04/2016 | 4.8 |
| 21/04/2016 | 4.9 |
| 21/04/2016 | 4.9 |
| 21/04/2016 | 4.8 |
| 21/04/2016 | 4.7 |
| 21/04/2016 | 4.6 |
| 21/04/2016 | 4.5 |
| 21/04/2016 | 4.6 |
| 21/04/2016 | 4.5 |
| 21/04/2016 | 4.5 |
| 21/04/2016 | 4.5 |
| 21/04/2016 | 4.1 |
| 21/04/2016 | 3.6 |
| 21/04/2016 | 3.1 |
| 21/04/2016 | 2.8 |
| 22/04/2016 | 2.6 |
| 22/04/2016 | 2.5 |
| 22/04/2016 | 2.4 |
| 22/04/2016 | 2.6 |
| 22/04/2016 | 2.9 |
| 22/04/2016 | 3.4 |
| 22/04/2016 | 4 |
| 22/04/2016 | 4.5 |
| 22/04/2016 | 4.7 |
| 22/04/2016 | 4.8 |
| 22/04/2016 | 4.8 |
| 22/04/2016 | 4.8 |
| 22/04/2016 | 4.7 |
| 22/04/2016 | 4.6 |
| 22/04/2016 | 4.5 |
| 22/04/2016 | 4.4 |
| 22/04/2016 | 4.4 |
| 22/04/2016 | 4.3 |
| 22/04/2016 | 4.3 |
| 22/04/2016 | 4.3 |
| 22/04/2016 | 3.9 |
| 22/04/2016 | 3.4 |
| 22/04/2016 | 3.1 |
| 22/04/2016 | 2.8 |
| 23/04/2016 | 2.5 |
| 23/04/2016 | 2.4 |
| 23/04/2016 | 2.4 |
| 23/04/2016 | 2.4 |
| 23/04/2016 | 2.5 |
| 23/04/2016 | 2.6 |
| 23/04/2016 | 2.8 |
| 23/04/2016 | 3.3 |
| 23/04/2016 | 3.6 |
| 23/04/2016 | 3.9 |
| 23/04/2016 | 4 |
| 23/04/2016 | 3.9 |
| 23/04/2016 | 3.8 |
| 23/04/2016 | 3.7 |
| 23/04/2016 | 3.6 |
| 23/04/2016 | 3.6 |
| 23/04/2016 | 3.6 |
| 23/04/2016 | 3.6 |
| 23/04/2016 | 3.7 |
| 23/04/2016 | 3.8 |
| 23/04/2016 | 3.5 |
| 23/04/2016 | 3.2 |
| 23/04/2016 | 2.9 |
| 23/04/2016 | 2.6 |
| 24/04/2016 | 2.4 |
| 24/04/2016 | 2.3 |
| 24/04/2016 | 2.3 |
| 24/04/2016 | 2.3 |
| 24/04/2016 | 2.3 |
| 24/04/2016 | 2.3 |
| 24/04/2016 | 2.5 |
| 24/04/2016 | 2.8 |
| 24/04/2016 | 3.1 |
| 24/04/2016 | 3.3 |
| 24/04/2016 | 3.4 |
| 24/04/2016 | 3.5 |
| 24/04/2016 | 3.4 |
| 24/04/2016 | 3.3 |
| 24/04/2016 | 3.2 |
| 24/04/2016 | 3.2 |
| 24/04/2016 | 3.3 |
| 24/04/2016 | 3.4 |
| 24/04/2016 | 3.4 |
| 24/04/2016 | 3.6 |
| 24/04/2016 | 3.5 |
| 24/04/2016 | 3.2 |
| 24/04/2016 | 2.9 |
| 24/04/2016 | 2.6 |
| 25/04/2016 | 2.4 |
| 25/04/2016 | 2.3 |
| 25/04/2016 | 2.3 |
| 25/04/2016 | 2.5 |
| 25/04/2016 | 2.7 |
| 25/04/2016 | 3.3 |
| 25/04/2016 | 4 |
| 25/04/2016 | 4.4 |
| 25/04/2016 | 4.6 |
| 25/04/2016 | 4.7 |
| 25/04/2016 | 4.8 |
| 25/04/2016 | 4.8 |
| 25/04/2016 | 4.7 |
| 25/04/2016 | 4.6 |
| 25/04/2016 | 4.5 |
| 25/04/2016 | 4.5 |
| 25/04/2016 | 4.5 |
| 25/04/2016 | 4.5 |
| 25/04/2016 | 4.5 |
| 25/04/2016 | 4.4 |
| 25/04/2016 | 4.1 |
| 25/04/2016 | 3.5 |
| 25/04/2016 | 3.1 |
| 25/04/2016 | 2.7 |
| 26/04/2016 | 2.5 |
| 26/04/2016 | 2.4 |
| 26/04/2016 | 2.4 |
| 26/04/2016 | 2.5 |
| 26/04/2016 | 2.8 |
| 26/04/2016 | 3.4 |
| 26/04/2016 | 4 |
| 26/04/2016 | 4.5 |
| 26/04/2016 | 4.7 |
| 26/04/2016 | 4.8 |
| 26/04/2016 | 4.8 |
| 26/04/2016 | 4.8 |
| 26/04/2016 | 4.8 |
| 26/04/2016 | 4.7 |
| 26/04/2016 | 4.6 |
| 26/04/2016 | 4.5 |
| 26/04/2016 | 4.6 |
| 26/04/2016 | 4.5 |
| 26/04/2016 | 4.5 |
| 26/04/2016 | 4.4 |
| 26/04/2016 | 4.1 |
| 26/04/2016 | 3.6 |
| 26/04/2016 | 3.1 |
| 26/04/2016 | 2.8 |
| 27/04/2016 | 2.5 |
| 27/04/2016 | 2.4 |
| 27/04/2016 | 2.4 |
| 27/04/2016 | 2.6 |
| 27/04/2016 | 2.8 |
| 27/04/2016 | 3.4 |
| 27/04/2016 | 4.1 |
| 27/04/2016 | 4.5 |
| 27/04/2016 | 4.7 |
| 27/04/2016 | 4.8 |
| 27/04/2016 | 4.8 |
| 27/04/2016 | 4.9 |
| 27/04/2016 | 4.8 |
| 27/04/2016 | 4.7 |
| 27/04/2016 | 4.6 |
| 27/04/2016 | 4.5 |
| 27/04/2016 | 4.6 |
| 27/04/2016 | 4.5 |
| 27/04/2016 | 4.5 |
| 27/04/2016 | 4.4 |
| 27/04/2016 | 4.1 |
| 27/04/2016 | 3.6 |
| 27/04/2016 | 3.1 |
| 27/04/2016 | 2.8 |
| 28/04/2016 | 2.6 |
| 28/04/2016 | 2.4 |
| 28/04/2016 | 2.4 |
| 28/04/2016 | 2.6 |
| 28/04/2016 | 2.8 |
| 28/04/2016 | 3.4 |
| 28/04/2016 | 4 |
| 28/04/2016 | 4.5 |
| 28/04/2016 | 4.7 |
| 28/04/2016 | 4.8 |
| 28/04/2016 | 4.9 |
| 28/04/2016 | 4.9 |
| 28/04/2016 | 4.8 |
| 28/04/2016 | 4.7 |
| 28/04/2016 | 4.6 |
| 28/04/2016 | 4.6 |
| 28/04/2016 | 4.6 |
| 28/04/2016 | 4.5 |
| 28/04/2016 | 4.5 |
| 28/04/2016 | 4.4 |
| 28/04/2016 | 4.1 |
| 28/04/2016 | 3.6 |
| 28/04/2016 | 3.1 |
| 28/04/2016 | 2.8 |
| 29/04/2016 | 2.6 |
| 29/04/2016 | 2.4 |
| 29/04/2016 | 2.4 |
| 29/04/2016 | 2.6 |
| 29/04/2016 | 2.8 |
| 29/04/2016 | 3.4 |
| 29/04/2016 | 4 |
| 29/04/2016 | 4.5 |
| 29/04/2016 | 4.7 |
| 29/04/2016 | 4.8 |
| 29/04/2016 | 4.8 |
| 29/04/2016 | 4.8 |
| 29/04/2016 | 4.7 |
| 29/04/2016 | 4.6 |
| 29/04/2016 | 4.5 |
| 29/04/2016 | 4.4 |
| 29/04/2016 | 4.4 |
| 29/04/2016 | 4.4 |
| 29/04/2016 | 4.3 |
| 29/04/2016 | 4.2 |
| 29/04/2016 | 3.9 |
| 29/04/2016 | 3.4 |
| 29/04/2016 | 3.1 |
| 29/04/2016 | 2.7 |
| 30/04/2016 | 2.5 |
| 30/04/2016 | 2.4 |
| 30/04/2016 | 2.4 |
| 30/04/2016 | 2.4 |
| 30/04/2016 | 2.4 |
| 30/04/2016 | 2.5 |
| 30/04/2016 | 2.8 |
| 30/04/2016 | 3.2 |
| 30/04/2016 | 3.6 |
| 30/04/2016 | 3.9 |
| 30/04/2016 | 4 |
| 30/04/2016 | 3.9 |
| 30/04/2016 | 3.8 |
| 30/04/2016 | 3.7 |
| 30/04/2016 | 3.6 |
| 30/04/2016 | 3.6 |
| 30/04/2016 | 3.6 |
| 30/04/2016 | 3.6 |
| 30/04/2016 | 3.7 |
| 30/04/2016 | 3.7 |
| 30/04/2016 | 3.5 |
| 30/04/2016 | 3.2 |
| 30/04/2016 | 2.9 |
| 30/04/2016 | 2.6 |
| 01/05/2016 | 2.4 |
| 01/05/2016 | 2.3 |
| 01/05/2016 | 2.3 |
| 01/05/2016 | 2.3 |
| 01/05/2016 | 2.3 |
| 01/05/2016 | 2.3 |
| 01/05/2016 | 2.5 |
| 01/05/2016 | 2.8 |
| 01/05/2016 | 3.1 |
| 01/05/2016 | 3.2 |
| 01/05/2016 | 3.4 |
| 01/05/2016 | 3.5 |
| 01/05/2016 | 3.4 |
| 01/05/2016 | 3.3 |
| 01/05/2016 | 3.2 |
| 01/05/2016 | 3.2 |
| 01/05/2016 | 3.3 |
| 01/05/2016 | 3.4 |
| 01/05/2016 | 3.4 |
| 01/05/2016 | 3.5 |
| 01/05/2016 | 3.5 |
| 01/05/2016 | 3.2 |
| 01/05/2016 | 2.9 |
| 01/05/2016 | 2.6 |
| 02/05/2016 | 2.4 |
| 02/05/2016 | 2.3 |
| 02/05/2016 | 2.3 |
| 02/05/2016 | 2.4 |
| 02/05/2016 | 2.7 |
| 02/05/2016 | 3.3 |
| 02/05/2016 | 3.9 |
| 02/05/2016 | 4.4 |
| 02/05/2016 | 4.6 |
| 02/05/2016 | 4.7 |
| 02/05/2016 | 4.8 |
| 02/05/2016 | 4.8 |
| 02/05/2016 | 4.7 |
| 02/05/2016 | 4.6 |
| 02/05/2016 | 4.6 |
| 02/05/2016 | 4.5 |
| 02/05/2016 | 4.5 |
| 02/05/2016 | 4.5 |
| 02/05/2016 | 4.5 |
| 02/05/2016 | 4.4 |
| 02/05/2016 | 4 |
| 02/05/2016 | 3.5 |
| 02/05/2016 | 3.1 |
| 02/05/2016 | 2.7 |
| 03/05/2016 | 2.5 |
| 03/05/2016 | 2.4 |
| 03/05/2016 | 2.4 |
| 03/05/2016 | 2.5 |
| 03/05/2016 | 2.8 |
| 03/05/2016 | 3.4 |
| 03/05/2016 | 4 |
| 03/05/2016 | 4.4 |
| 03/05/2016 | 4.7 |
| 03/05/2016 | 4.8 |
| 03/05/2016 | 4.8 |
| 03/05/2016 | 4.8 |
| 03/05/2016 | 4.8 |
| 03/05/2016 | 4.7 |
| 03/05/2016 | 4.6 |
| 03/05/2016 | 4.5 |
| 03/05/2016 | 4.6 |
| 03/05/2016 | 4.5 |
| 03/05/2016 | 4.5 |
| 03/05/2016 | 4.4 |
| 03/05/2016 | 4.1 |
| 03/05/2016 | 3.6 |
| 03/05/2016 | 3.1 |
| 03/05/2016 | 2.8 |
| 04/05/2016 | 2.5 |
| 04/05/2016 | 2.4 |
| 04/05/2016 | 2.4 |
| 04/05/2016 | 2.5 |
| 04/05/2016 | 2.8 |
| 04/05/2016 | 3.4 |
| 04/05/2016 | 4 |
| 04/05/2016 | 4.5 |
| 04/05/2016 | 4.7 |
| 04/05/2016 | 4.8 |
| 04/05/2016 | 4.8 |
| 04/05/2016 | 4.9 |
| 04/05/2016 | 4.8 |
| 04/05/2016 | 4.7 |
| 04/05/2016 | 4.6 |
| 04/05/2016 | 4.5 |
| 04/05/2016 | 4.6 |
| 04/05/2016 | 4.6 |
| 04/05/2016 | 4.5 |
| 04/05/2016 | 4.4 |
| 04/05/2016 | 4.1 |
| 04/05/2016 | 3.6 |
| 04/05/2016 | 3.1 |
| 04/05/2016 | 2.6 |
| 05/05/2016 | 2.5 |
| 05/05/2016 | 2.4 |
| 05/05/2016 | 2.3 |
| 05/05/2016 | 2.3 |
| 05/05/2016 | 2.3 |
| 05/05/2016 | 2.4 |
| 05/05/2016 | 2.6 |
| 05/05/2016 | 2.9 |
| 05/05/2016 | 3.2 |
| 05/05/2016 | 3.4 |
| 05/05/2016 | 3.5 |
| 05/05/2016 | 3.5 |
| 05/05/2016 | 3.4 |
| 05/05/2016 | 3.3 |
| 05/05/2016 | 3.2 |
| 05/05/2016 | 3.2 |
| 05/05/2016 | 3.2 |
| 05/05/2016 | 3.3 |
| 05/05/2016 | 3.4 |
| 05/05/2016 | 3.4 |
| 05/05/2016 | 3.3 |
| 05/05/2016 | 3.1 |
| 05/05/2016 | 2.8 |
| 05/05/2016 | 2.5 |
| 06/05/2016 | 2.3 |
| 06/05/2016 | 2.2 |
| 06/05/2016 | 2.2 |
| 06/05/2016 | 2.3 |
| 06/05/2016 | 2.4 |
| 06/05/2016 | 2.7 |
| 06/05/2016 | 3 |
| 06/05/2016 | 3.5 |
| 06/05/2016 | 3.8 |
| 06/05/2016 | 4 |
| 06/05/2016 | 4 |
| 06/05/2016 | 4 |
| 06/05/2016 | 3.9 |
| 06/05/2016 | 3.8 |
| 06/05/2016 | 3.7 |
| 06/05/2016 | 3.7 |
| 06/05/2016 | 3.8 |
| 06/05/2016 | 3.8 |
| 06/05/2016 | 3.8 |
| 06/05/2016 | 3.7 |
| 06/05/2016 | 3.5 |
| 06/05/2016 | 3.2 |
| 06/05/2016 | 2.8 |
| 06/05/2016 | 2.7 |
| 07/05/2016 | 2.5 |
| 07/05/2016 | 2.4 |
| 07/05/2016 | 2.4 |
| 07/05/2016 | 2.4 |
| 07/05/2016 | 2.4 |
| 07/05/2016 | 2.5 |
| 07/05/2016 | 2.8 |
| 07/05/2016 | 3.2 |
| 07/05/2016 | 3.6 |
| 07/05/2016 | 3.9 |
| 07/05/2016 | 4 |
| 07/05/2016 | 3.9 |
| 07/05/2016 | 3.8 |
| 07/05/2016 | 3.7 |
| 07/05/2016 | 3.6 |
| 07/05/2016 | 3.6 |
| 07/05/2016 | 3.6 |
| 07/05/2016 | 3.7 |
| 07/05/2016 | 3.7 |
| 07/05/2016 | 3.6 |
| 07/05/2016 | 3.5 |
| 07/05/2016 | 3.2 |
| 07/05/2016 | 2.9 |
| 07/05/2016 | 2.6 |
| 08/05/2016 | 2.4 |
| 08/05/2016 | 2.3 |
| 08/05/2016 | 2.3 |
| 08/05/2016 | 2.3 |
| 08/05/2016 | 2.3 |
| 08/05/2016 | 2.3 |
| 08/05/2016 | 2.5 |
| 08/05/2016 | 2.7 |
| 08/05/2016 | 3 |
| 08/05/2016 | 3.2 |
| 08/05/2016 | 3.4 |
| 08/05/2016 | 3.5 |
| 08/05/2016 | 3.4 |
| 08/05/2016 | 3.3 |
| 08/05/2016 | 3.2 |
| 08/05/2016 | 3.2 |
| 08/05/2016 | 3.3 |
| 08/05/2016 | 3.4 |
| 08/05/2016 | 3.4 |
| 08/05/2016 | 3.5 |
| 08/05/2016 | 3.4 |
| 08/05/2016 | 3.2 |
| 08/05/2016 | 2.9 |
| 08/05/2016 | 2.6 |
| 09/05/2016 | 2.4 |
| 09/05/2016 | 2.3 |
| 09/05/2016 | 2.3 |
| 09/05/2016 | 2.4 |
| 09/05/2016 | 2.7 |
| 09/05/2016 | 3.3 |
| 09/05/2016 | 3.9 |
| 09/05/2016 | 4.3 |
| 09/05/2016 | 4.6 |
| 09/05/2016 | 4.7 |
| 09/05/2016 | 4.8 |
| 09/05/2016 | 4.8 |
| 09/05/2016 | 4.7 |
| 09/05/2016 | 4.6 |
| 09/05/2016 | 4.6 |
| 09/05/2016 | 4.5 |
| 09/05/2016 | 4.5 |
| 09/05/2016 | 4.5 |
| 09/05/2016 | 4.5 |
| 09/05/2016 | 4.3 |
| 09/05/2016 | 4 |
| 09/05/2016 | 3.5 |
| 09/05/2016 | 3.1 |
| 09/05/2016 | 2.7 |
| 10/05/2016 | 2.5 |
| 10/05/2016 | 2.4 |
| 10/05/2016 | 2.4 |
| 10/05/2016 | 2.5 |
| 10/05/2016 | 2.8 |
| 10/05/2016 | 3.3 |
| 10/05/2016 | 4 |
| 10/05/2016 | 4.4 |
| 10/05/2016 | 4.6 |
| 10/05/2016 | 4.8 |
| 10/05/2016 | 4.8 |
| 10/05/2016 | 4.8 |
| 10/05/2016 | 4.8 |
| 10/05/2016 | 4.7 |
| 10/05/2016 | 4.6 |
| 10/05/2016 | 4.6 |
| 10/05/2016 | 4.6 |
| 10/05/2016 | 4.6 |
| 10/05/2016 | 4.5 |
| 10/05/2016 | 4.3 |
| 10/05/2016 | 4 |
| 10/05/2016 | 3.6 |
| 10/05/2016 | 3.1 |
| 10/05/2016 | 2.7 |
| 11/05/2016 | 2.5 |
| 11/05/2016 | 2.4 |
| 11/05/2016 | 2.4 |
| 11/05/2016 | 2.5 |
| 11/05/2016 | 2.8 |
| 11/05/2016 | 3.4 |
| 11/05/2016 | 4 |
| 11/05/2016 | 4.4 |
| 11/05/2016 | 4.6 |
| 11/05/2016 | 4.8 |
| 11/05/2016 | 4.8 |
| 11/05/2016 | 4.9 |
| 11/05/2016 | 4.8 |
| 11/05/2016 | 4.7 |
| 11/05/2016 | 4.6 |
| 11/05/2016 | 4.6 |
| 11/05/2016 | 4.6 |
| 11/05/2016 | 4.6 |
| 11/05/2016 | 4.5 |
| 11/05/2016 | 4.3 |
| 11/05/2016 | 4 |
| 11/05/2016 | 3.6 |
| 11/05/2016 | 3.1 |
| 11/05/2016 | 2.8 |
| 12/05/2016 | 2.5 |
| 12/05/2016 | 2.4 |
| 12/05/2016 | 2.4 |
| 12/05/2016 | 2.5 |
| 12/05/2016 | 2.8 |
| 12/05/2016 | 3.3 |
| 12/05/2016 | 4 |
| 12/05/2016 | 4.4 |
| 12/05/2016 | 4.6 |
| 12/05/2016 | 4.8 |
| 12/05/2016 | 4.8 |
| 12/05/2016 | 4.9 |
| 12/05/2016 | 4.8 |
| 12/05/2016 | 4.7 |
| 12/05/2016 | 4.7 |
| 12/05/2016 | 4.6 |
| 12/05/2016 | 4.6 |
| 12/05/2016 | 4.6 |
| 12/05/2016 | 4.5 |
| 12/05/2016 | 4.3 |
| 12/05/2016 | 4 |
| 12/05/2016 | 3.6 |
| 12/05/2016 | 3.1 |
| 12/05/2016 | 2.8 |
| 13/05/2016 | 2.5 |
| 13/05/2016 | 2.4 |
| 13/05/2016 | 2.4 |
| 13/05/2016 | 2.5 |
| 13/05/2016 | 2.7 |
| 13/05/2016 | 3.3 |
| 13/05/2016 | 4 |
| 13/05/2016 | 4.4 |
| 13/05/2016 | 4.6 |
| 13/05/2016 | 4.8 |
| 13/05/2016 | 4.8 |
| 13/05/2016 | 4.8 |
| 13/05/2016 | 4.7 |
| 13/05/2016 | 4.6 |
| 13/05/2016 | 4.5 |
| 13/05/2016 | 4.4 |
| 13/05/2016 | 4.4 |
| 13/05/2016 | 4.4 |
| 13/05/2016 | 4.3 |
| 13/05/2016 | 4.1 |
| 13/05/2016 | 3.8 |
| 13/05/2016 | 3.4 |
| 13/05/2016 | 3.1 |
| 13/05/2016 | 2.7 |
| 14/05/2016 | 2.5 |
| 14/05/2016 | 2.4 |
| 14/05/2016 | 2.4 |
| 14/05/2016 | 2.4 |
| 14/05/2016 | 2.4 |
| 14/05/2016 | 2.5 |
| 14/05/2016 | 2.8 |
| 14/05/2016 | 3.2 |
| 14/05/2016 | 3.6 |
| 14/05/2016 | 3.9 |
| 14/05/2016 | 3.9 |
| 14/05/2016 | 3.9 |
| 14/05/2016 | 3.8 |
| 14/05/2016 | 3.7 |
| 14/05/2016 | 3.6 |
| 14/05/2016 | 3.6 |
| 14/05/2016 | 3.6 |
| 14/05/2016 | 3.7 |
| 14/05/2016 | 3.7 |
| 14/05/2016 | 3.6 |
| 14/05/2016 | 3.4 |
| 14/05/2016 | 3.2 |
| 14/05/2016 | 2.9 |
| 14/05/2016 | 2.5 |
| 15/05/2016 | 2.4 |
| 15/05/2016 | 2.3 |
| 15/05/2016 | 2.2 |
| 15/05/2016 | 2.2 |
| 15/05/2016 | 2.2 |
| 15/05/2016 | 2.3 |
| 15/05/2016 | 2.4 |
| 15/05/2016 | 2.7 |
| 15/05/2016 | 3 |
| 15/05/2016 | 3.2 |
| 15/05/2016 | 3.3 |
| 15/05/2016 | 3.3 |
| 15/05/2016 | 3.2 |
| 15/05/2016 | 3.1 |
| 15/05/2016 | 3 |
| 15/05/2016 | 3 |
| 15/05/2016 | 3.1 |
| 15/05/2016 | 3.2 |
| 15/05/2016 | 3.2 |
| 15/05/2016 | 3.2 |
| 15/05/2016 | 3.2 |
| 15/05/2016 | 3.1 |
| 15/05/2016 | 2.8 |
| 15/05/2016 | 2.5 |
| 16/05/2016 | 2.3 |
| 16/05/2016 | 2.3 |
| 16/05/2016 | 2.2 |
| 16/05/2016 | 2.2 |
| 16/05/2016 | 2.2 |
| 16/05/2016 | 2.2 |
| 16/05/2016 | 2.4 |
| 16/05/2016 | 2.7 |
| 16/05/2016 | 3 |
| 16/05/2016 | 3.2 |
| 16/05/2016 | 3.3 |
| 16/05/2016 | 3.3 |
| 16/05/2016 | 3.2 |
| 16/05/2016 | 3.1 |
| 16/05/2016 | 3 |
| 16/05/2016 | 3 |
| 16/05/2016 | 3.1 |
| 16/05/2016 | 3.2 |
| 16/05/2016 | 3.2 |
| 16/05/2016 | 3.2 |
| 16/05/2016 | 3.2 |
| 16/05/2016 | 3.1 |
| 16/05/2016 | 2.8 |
| 16/05/2016 | 2.7 |
| 17/05/2016 | 2.5 |
| 17/05/2016 | 2.4 |
| 17/05/2016 | 2.4 |
| 17/05/2016 | 2.5 |
| 17/05/2016 | 2.7 |
| 17/05/2016 | 3.2 |
| 17/05/2016 | 3.7 |
| 17/05/2016 | 4.2 |
| 17/05/2016 | 4.5 |
| 17/05/2016 | 4.7 |
| 17/05/2016 | 4.7 |
| 17/05/2016 | 4.8 |
| 17/05/2016 | 4.7 |
| 17/05/2016 | 4.6 |
| 17/05/2016 | 4.5 |
| 17/05/2016 | 4.5 |
| 17/05/2016 | 4.4 |
| 17/05/2016 | 4.4 |
| 17/05/2016 | 4.4 |
| 17/05/2016 | 4.1 |
| 17/05/2016 | 3.9 |
| 17/05/2016 | 3.5 |
| 17/05/2016 | 3.1 |
| 17/05/2016 | 2.7 |
| 18/05/2016 | 2.5 |
| 18/05/2016 | 2.4 |
| 18/05/2016 | 2.4 |
| 18/05/2016 | 2.5 |
| 18/05/2016 | 2.7 |
| 18/05/2016 | 3.3 |
| 18/05/2016 | 4 |
| 18/05/2016 | 4.4 |
| 18/05/2016 | 4.6 |
| 18/05/2016 | 4.8 |
| 18/05/2016 | 4.8 |
| 18/05/2016 | 4.9 |
| 18/05/2016 | 4.8 |
| 18/05/2016 | 4.7 |
| 18/05/2016 | 4.6 |
| 18/05/2016 | 4.6 |
| 18/05/2016 | 4.6 |
| 18/05/2016 | 4.6 |
| 18/05/2016 | 4.5 |
| 18/05/2016 | 4.2 |
| 18/05/2016 | 4 |
| 18/05/2016 | 3.6 |
| 18/05/2016 | 3.1 |
| 18/05/2016 | 2.7 |
| 19/05/2016 | 2.5 |
| 19/05/2016 | 2.4 |
| 19/05/2016 | 2.4 |
| 19/05/2016 | 2.5 |
| 19/05/2016 | 2.7 |
| 19/05/2016 | 3.3 |
| 19/05/2016 | 4 |
| 19/05/2016 | 4.4 |
| 19/05/2016 | 4.6 |
| 19/05/2016 | 4.8 |
| 19/05/2016 | 4.8 |
| 19/05/2016 | 4.9 |
| 19/05/2016 | 4.8 |
| 19/05/2016 | 4.7 |
| 19/05/2016 | 4.7 |
| 19/05/2016 | 4.6 |
| 19/05/2016 | 4.6 |
| 19/05/2016 | 4.6 |
| 19/05/2016 | 4.5 |
| 19/05/2016 | 4.2 |
| 19/05/2016 | 4 |
| 19/05/2016 | 3.6 |
| 19/05/2016 | 3.1 |
| 19/05/2016 | 2.8 |
| 20/05/2016 | 2.5 |
| 20/05/2016 | 2.4 |
| 20/05/2016 | 2.4 |
| 20/05/2016 | 2.5 |
| 20/05/2016 | 2.7 |
| 20/05/2016 | 3.3 |
| 20/05/2016 | 3.9 |
| 20/05/2016 | 4.4 |
| 20/05/2016 | 4.6 |
| 20/05/2016 | 4.8 |
| 20/05/2016 | 4.8 |
| 20/05/2016 | 4.8 |
| 20/05/2016 | 4.7 |
| 20/05/2016 | 4.6 |
| 20/05/2016 | 4.5 |
| 20/05/2016 | 4.4 |
| 20/05/2016 | 4.4 |
| 20/05/2016 | 4.4 |
| 20/05/2016 | 4.3 |
| 20/05/2016 | 4 |
| 20/05/2016 | 3.8 |
| 20/05/2016 | 3.4 |
| 20/05/2016 | 3 |
| 20/05/2016 | 2.7 |
| 21/05/2016 | 2.5 |
| 21/05/2016 | 2.4 |
| 21/05/2016 | 2.4 |
| 21/05/2016 | 2.3 |
| 21/05/2016 | 2.4 |
| 21/05/2016 | 2.5 |
| 21/05/2016 | 2.8 |
| 21/05/2016 | 3.2 |
| 21/05/2016 | 3.6 |
| 21/05/2016 | 3.8 |
| 21/05/2016 | 3.9 |
| 21/05/2016 | 3.9 |
| 21/05/2016 | 3.8 |
| 21/05/2016 | 3.7 |
| 21/05/2016 | 3.7 |
| 21/05/2016 | 3.6 |
| 21/05/2016 | 3.6 |
| 21/05/2016 | 3.7 |
| 21/05/2016 | 3.7 |
| 21/05/2016 | 3.5 |
| 21/05/2016 | 3.4 |
| 21/05/2016 | 3.2 |
| 21/05/2016 | 2.8 |
| 21/05/2016 | 2.6 |
| 22/05/2016 | 2.4 |
| 22/05/2016 | 2.3 |
| 22/05/2016 | 2.3 |
| 22/05/2016 | 2.2 |
| 22/05/2016 | 2.2 |
| 22/05/2016 | 2.2 |
| 22/05/2016 | 2.4 |
| 22/05/2016 | 2.7 |
| 22/05/2016 | 3 |
| 22/05/2016 | 3.2 |
| 22/05/2016 | 3.4 |
| 22/05/2016 | 3.5 |
| 22/05/2016 | 3.4 |
| 22/05/2016 | 3.3 |
| 22/05/2016 | 3.2 |
| 22/05/2016 | 3.2 |
| 22/05/2016 | 3.3 |
| 22/05/2016 | 3.4 |
| 22/05/2016 | 3.4 |
| 22/05/2016 | 3.3 |
| 22/05/2016 | 3.3 |
| 22/05/2016 | 3.2 |
| 22/05/2016 | 2.9 |
| 22/05/2016 | 2.6 |
| 23/05/2016 | 2.4 |
| 23/05/2016 | 2.3 |
| 23/05/2016 | 2.3 |
| 23/05/2016 | 2.4 |
| 23/05/2016 | 2.6 |
| 23/05/2016 | 3.2 |
| 23/05/2016 | 3.8 |
| 23/05/2016 | 4.3 |
| 23/05/2016 | 4.5 |
| 23/05/2016 | 4.7 |
| 23/05/2016 | 4.7 |
| 23/05/2016 | 4.8 |
| 23/05/2016 | 4.7 |
| 23/05/2016 | 4.7 |
| 23/05/2016 | 4.6 |
| 23/05/2016 | 4.5 |
| 23/05/2016 | 4.5 |
| 23/05/2016 | 4.6 |
| 23/05/2016 | 4.5 |
| 23/05/2016 | 4.1 |
| 23/05/2016 | 3.9 |
| 23/05/2016 | 3.5 |
| 23/05/2016 | 3.1 |
| 23/05/2016 | 2.7 |
| 24/05/2016 | 2.5 |
| 24/05/2016 | 2.4 |
| 24/05/2016 | 2.4 |
| 24/05/2016 | 2.5 |
| 24/05/2016 | 2.7 |
| 24/05/2016 | 3.3 |
| 24/05/2016 | 3.9 |
| 24/05/2016 | 4.4 |
| 24/05/2016 | 4.6 |
| 24/05/2016 | 4.7 |
| 24/05/2016 | 4.8 |
| 24/05/2016 | 4.8 |
| 24/05/2016 | 4.8 |
| 24/05/2016 | 4.7 |
| 24/05/2016 | 4.6 |
| 24/05/2016 | 4.6 |
| 24/05/2016 | 4.6 |
| 24/05/2016 | 4.6 |
| 24/05/2016 | 4.5 |
| 24/05/2016 | 4.1 |
| 24/05/2016 | 3.9 |
| 24/05/2016 | 3.5 |
| 24/05/2016 | 3.1 |
| 24/05/2016 | 2.7 |
| 25/05/2016 | 2.5 |
| 25/05/2016 | 2.4 |
| 25/05/2016 | 2.4 |
| 25/05/2016 | 2.5 |
| 25/05/2016 | 2.7 |
| 25/05/2016 | 3.3 |
| 25/05/2016 | 3.9 |
| 25/05/2016 | 4.4 |
| 25/05/2016 | 4.6 |
| 25/05/2016 | 4.8 |
| 25/05/2016 | 4.8 |
| 25/05/2016 | 4.9 |
| 25/05/2016 | 4.8 |
| 25/05/2016 | 4.7 |
| 25/05/2016 | 4.7 |
| 25/05/2016 | 4.6 |
| 25/05/2016 | 4.6 |
| 25/05/2016 | 4.6 |
| 25/05/2016 | 4.5 |
| 25/05/2016 | 4.1 |
| 25/05/2016 | 3.9 |
| 25/05/2016 | 3.6 |
| 25/05/2016 | 3.1 |
| 25/05/2016 | 2.7 |
| 26/05/2016 | 2.5 |
| 26/05/2016 | 2.4 |
| 26/05/2016 | 2.4 |
| 26/05/2016 | 2.5 |
| 26/05/2016 | 2.7 |
| 26/05/2016 | 3.3 |
| 26/05/2016 | 3.9 |
| 26/05/2016 | 4.4 |
| 26/05/2016 | 4.6 |
| 26/05/2016 | 4.8 |
| 26/05/2016 | 4.8 |
| 26/05/2016 | 4.9 |
| 26/05/2016 | 4.8 |
| 26/05/2016 | 4.7 |
| 26/05/2016 | 4.7 |
| 26/05/2016 | 4.6 |
| 26/05/2016 | 4.6 |
| 26/05/2016 | 4.6 |
| 26/05/2016 | 4.5 |
| 26/05/2016 | 4.1 |
| 26/05/2016 | 3.9 |
| 26/05/2016 | 3.6 |
| 26/05/2016 | 3.1 |
| 26/05/2016 | 2.7 |
| 27/05/2016 | 2.5 |
| 27/05/2016 | 2.4 |
| 27/05/2016 | 2.4 |
| 27/05/2016 | 2.5 |
| 27/05/2016 | 2.7 |
| 27/05/2016 | 3.3 |
| 27/05/2016 | 3.9 |
| 27/05/2016 | 4.3 |
| 27/05/2016 | 4.6 |
| 27/05/2016 | 4.8 |
| 27/05/2016 | 4.8 |
| 27/05/2016 | 4.8 |
| 27/05/2016 | 4.7 |
| 27/05/2016 | 4.6 |
| 27/05/2016 | 4.5 |
| 27/05/2016 | 4.4 |
| 27/05/2016 | 4.4 |
| 27/05/2016 | 4.4 |
| 27/05/2016 | 4.3 |
| 27/05/2016 | 3.9 |
| 27/05/2016 | 3.7 |
| 27/05/2016 | 3.4 |
| 27/05/2016 | 3 |
| 27/05/2016 | 2.7 |
| 28/05/2016 | 2.5 |
| 28/05/2016 | 2.4 |
| 28/05/2016 | 2.4 |
| 28/05/2016 | 2.3 |
| 28/05/2016 | 2.3 |
| 28/05/2016 | 2.5 |
| 28/05/2016 | 2.7 |
| 28/05/2016 | 3.2 |
| 28/05/2016 | 3.5 |
| 28/05/2016 | 3.8 |
| 28/05/2016 | 3.9 |
| 28/05/2016 | 3.9 |
| 28/05/2016 | 3.8 |
| 28/05/2016 | 3.7 |
| 28/05/2016 | 3.7 |
| 28/05/2016 | 3.6 |
| 28/05/2016 | 3.6 |
| 28/05/2016 | 3.7 |
| 28/05/2016 | 3.7 |
| 28/05/2016 | 3.5 |
| 28/05/2016 | 3.3 |
| 28/05/2016 | 3.1 |
| 28/05/2016 | 2.8 |
| 28/05/2016 | 2.6 |
| 29/05/2016 | 2.4 |
| 29/05/2016 | 2.3 |
| 29/05/2016 | 2.2 |
| 29/05/2016 | 2.2 |
| 29/05/2016 | 2.2 |
| 29/05/2016 | 2.2 |
| 29/05/2016 | 2.4 |
| 29/05/2016 | 2.7 |
| 29/05/2016 | 3 |
| 29/05/2016 | 3.2 |
| 29/05/2016 | 3.4 |
| 29/05/2016 | 3.5 |
| 29/05/2016 | 3.4 |
| 29/05/2016 | 3.3 |
| 29/05/2016 | 3.2 |
| 29/05/2016 | 3.2 |
| 29/05/2016 | 3.3 |
| 29/05/2016 | 3.4 |
| 29/05/2016 | 3.4 |
| 29/05/2016 | 3.3 |
| 29/05/2016 | 3.3 |
| 29/05/2016 | 3.2 |
| 29/05/2016 | 2.9 |
| 29/05/2016 | 2.6 |
| 30/05/2016 | 2.4 |
| 30/05/2016 | 2.3 |
| 30/05/2016 | 2.3 |
| 30/05/2016 | 2.4 |
| 30/05/2016 | 2.6 |
| 30/05/2016 | 3.2 |
| 30/05/2016 | 3.8 |
| 30/05/2016 | 4.3 |
| 30/05/2016 | 4.5 |
| 30/05/2016 | 4.7 |
| 30/05/2016 | 4.7 |
| 30/05/2016 | 4.8 |
| 30/05/2016 | 4.7 |
| 30/05/2016 | 4.7 |
| 30/05/2016 | 4.6 |
| 30/05/2016 | 4.5 |
| 30/05/2016 | 4.5 |
| 30/05/2016 | 4.6 |
| 30/05/2016 | 4.5 |
| 30/05/2016 | 4.1 |
| 30/05/2016 | 3.9 |
| 30/05/2016 | 3.5 |
| 30/05/2016 | 3.1 |
| 30/05/2016 | 2.7 |
| 31/05/2016 | 2.5 |
| 31/05/2016 | 2.4 |
| 31/05/2016 | 2.4 |
| 31/05/2016 | 2.5 |
| 31/05/2016 | 2.7 |
| 31/05/2016 | 3.3 |
| 31/05/2016 | 3.9 |
| 31/05/2016 | 4.3 |
| 31/05/2016 | 4.6 |
| 31/05/2016 | 4.7 |
| 31/05/2016 | 4.8 |
| 31/05/2016 | 4.8 |
| 31/05/2016 | 4.8 |
| 31/05/2016 | 4.7 |
| 31/05/2016 | 4.6 |
| 31/05/2016 | 4.6 |
| 31/05/2016 | 4.6 |
| 31/05/2016 | 4.6 |
| 31/05/2016 | 4.5 |
| 31/05/2016 | 4.1 |
| 31/05/2016 | 3.9 |
| 31/05/2016 | 3.5 |
| 31/05/2016 | 3.1 |
| 31/05/2016 | 2.7 |
| 01/06/2016 | 2.5 |
| 01/06/2016 | 2.4 |
| 01/06/2016 | 2.4 |
| 01/06/2016 | 2.5 |
| 01/06/2016 | 2.7 |
| 01/06/2016 | 3.3 |
| 01/06/2016 | 3.9 |
| 01/06/2016 | 4.4 |
| 01/06/2016 | 4.6 |
| 01/06/2016 | 4.8 |
| 01/06/2016 | 4.8 |
| 01/06/2016 | 4.9 |
| 01/06/2016 | 4.8 |
| 01/06/2016 | 4.7 |
| 01/06/2016 | 4.6 |
| 01/06/2016 | 4.6 |
| 01/06/2016 | 4.6 |
| 01/06/2016 | 4.6 |
| 01/06/2016 | 4.5 |
| 01/06/2016 | 4.1 |
| 01/06/2016 | 3.9 |
| 01/06/2016 | 3.6 |
| 01/06/2016 | 3.1 |
| 01/06/2016 | 2.7 |
| 02/06/2016 | 2.5 |
| 02/06/2016 | 2.4 |
| 02/06/2016 | 2.4 |
| 02/06/2016 | 2.5 |
| 02/06/2016 | 2.7 |
| 02/06/2016 | 3.3 |
| 02/06/2016 | 3.9 |
| 02/06/2016 | 4.4 |
| 02/06/2016 | 4.6 |
| 02/06/2016 | 4.8 |
| 02/06/2016 | 4.8 |
| 02/06/2016 | 4.9 |
| 02/06/2016 | 4.8 |
| 02/06/2016 | 4.7 |
| 02/06/2016 | 4.7 |
| 02/06/2016 | 4.6 |
| 02/06/2016 | 4.6 |
| 02/06/2016 | 4.6 |
| 02/06/2016 | 4.5 |
| 02/06/2016 | 4.1 |
| 02/06/2016 | 3.9 |
| 02/06/2016 | 3.6 |
| 02/06/2016 | 3.1 |
| 02/06/2016 | 2.8 |
| 03/06/2016 | 2.5 |
| 03/06/2016 | 2.4 |
| 03/06/2016 | 2.4 |
| 03/06/2016 | 2.5 |
| 03/06/2016 | 2.7 |
| 03/06/2016 | 3.3 |
| 03/06/2016 | 3.9 |
| 03/06/2016 | 4.4 |
| 03/06/2016 | 4.6 |
| 03/06/2016 | 4.8 |
| 03/06/2016 | 4.8 |
| 03/06/2016 | 4.8 |
| 03/06/2016 | 4.7 |
| 03/06/2016 | 4.6 |
| 03/06/2016 | 4.5 |
| 03/06/2016 | 4.4 |
| 03/06/2016 | 4.4 |
| 03/06/2016 | 4.4 |
| 03/06/2016 | 4.3 |
| 03/06/2016 | 3.9 |
| 03/06/2016 | 3.7 |
| 03/06/2016 | 3.4 |
| 03/06/2016 | 3 |
| 03/06/2016 | 2.7 |
| 04/06/2016 | 2.5 |
| 04/06/2016 | 2.4 |
| 04/06/2016 | 2.4 |
| 04/06/2016 | 2.3 |
| 04/06/2016 | 2.3 |
| 04/06/2016 | 2.5 |
| 04/06/2016 | 2.7 |
| 04/06/2016 | 3.2 |
| 04/06/2016 | 3.5 |
| 04/06/2016 | 3.8 |
| 04/06/2016 | 3.9 |
| 04/06/2016 | 3.9 |
| 04/06/2016 | 3.8 |
| 04/06/2016 | 3.7 |
| 04/06/2016 | 3.7 |
| 04/06/2016 | 3.6 |
| 04/06/2016 | 3.6 |
| 04/06/2016 | 3.7 |
| 04/06/2016 | 3.7 |
| 04/06/2016 | 3.4 |
| 04/06/2016 | 3.3 |
| 04/06/2016 | 3.1 |
| 04/06/2016 | 2.8 |
| 04/06/2016 | 2.6 |
| 05/06/2016 | 2.4 |
| 05/06/2016 | 2.3 |
| 05/06/2016 | 2.3 |
| 05/06/2016 | 2.2 |
| 05/06/2016 | 2.2 |
| 05/06/2016 | 2.2 |
| 05/06/2016 | 2.4 |
| 05/06/2016 | 2.7 |
| 05/06/2016 | 3 |
| 05/06/2016 | 3.2 |
| 05/06/2016 | 3.4 |
| 05/06/2016 | 3.5 |
| 05/06/2016 | 3.4 |
| 05/06/2016 | 3.3 |
| 05/06/2016 | 3.2 |
| 05/06/2016 | 3.2 |
| 05/06/2016 | 3.3 |
| 05/06/2016 | 3.4 |
| 05/06/2016 | 3.4 |
| 05/06/2016 | 3.3 |
| 05/06/2016 | 3.3 |
| 05/06/2016 | 3.2 |
| 05/06/2016 | 2.9 |
| 05/06/2016 | 2.6 |
| 06/06/2016 | 2.4 |
| 06/06/2016 | 2.3 |
| 06/06/2016 | 2.3 |
| 06/06/2016 | 2.4 |
| 06/06/2016 | 2.6 |
| 06/06/2016 | 3.2 |
| 06/06/2016 | 3.8 |
| 06/06/2016 | 4.3 |
| 06/06/2016 | 4.5 |
| 06/06/2016 | 4.7 |
| 06/06/2016 | 4.7 |
| 06/06/2016 | 4.8 |
| 06/06/2016 | 4.7 |
| 06/06/2016 | 4.7 |
| 06/06/2016 | 4.6 |
| 06/06/2016 | 4.5 |
| 06/06/2016 | 4.5 |
| 06/06/2016 | 4.5 |
| 06/06/2016 | 4.5 |
| 06/06/2016 | 4.1 |
| 06/06/2016 | 3.8 |
| 06/06/2016 | 3.5 |
| 06/06/2016 | 3.1 |
| 06/06/2016 | 2.7 |
| 07/06/2016 | 2.5 |
| 07/06/2016 | 2.4 |
| 07/06/2016 | 2.4 |
| 07/06/2016 | 2.5 |
| 07/06/2016 | 2.7 |
| 07/06/2016 | 3.3 |
| 07/06/2016 | 3.9 |
| 07/06/2016 | 4.3 |
| 07/06/2016 | 4.6 |
| 07/06/2016 | 4.7 |
| 07/06/2016 | 4.8 |
| 07/06/2016 | 4.8 |
| 07/06/2016 | 4.8 |
| 07/06/2016 | 4.7 |
| 07/06/2016 | 4.6 |
| 07/06/2016 | 4.6 |
| 07/06/2016 | 4.6 |
| 07/06/2016 | 4.6 |
| 07/06/2016 | 4.5 |
| 07/06/2016 | 4.1 |
| 07/06/2016 | 3.9 |
| 07/06/2016 | 3.5 |
| 07/06/2016 | 3.1 |
| 07/06/2016 | 2.7 |
| 08/06/2016 | 2.5 |
| 08/06/2016 | 2.4 |
| 08/06/2016 | 2.4 |
| 08/06/2016 | 2.5 |
| 08/06/2016 | 2.7 |
| 08/06/2016 | 3.3 |
| 08/06/2016 | 3.9 |
| 08/06/2016 | 4.4 |
| 08/06/2016 | 4.6 |
| 08/06/2016 | 4.8 |
| 08/06/2016 | 4.8 |
| 08/06/2016 | 4.8 |
| 08/06/2016 | 4.8 |
| 08/06/2016 | 4.7 |
| 08/06/2016 | 4.6 |
| 08/06/2016 | 4.6 |
| 08/06/2016 | 4.6 |
| 08/06/2016 | 4.6 |
| 08/06/2016 | 4.5 |
| 08/06/2016 | 4.1 |
| 08/06/2016 | 3.9 |
| 08/06/2016 | 3.5 |
| 08/06/2016 | 3.1 |
| 08/06/2016 | 2.7 |
| 09/06/2016 | 2.5 |
| 09/06/2016 | 2.4 |
| 09/06/2016 | 2.4 |
| 09/06/2016 | 2.5 |
| 09/06/2016 | 2.7 |
| 09/06/2016 | 3.3 |
| 09/06/2016 | 3.9 |
| 09/06/2016 | 4.4 |
| 09/06/2016 | 4.6 |
| 09/06/2016 | 4.8 |
| 09/06/2016 | 4.8 |
| 09/06/2016 | 4.9 |
| 09/06/2016 | 4.8 |
| 09/06/2016 | 4.7 |
| 09/06/2016 | 4.7 |
| 09/06/2016 | 4.6 |
| 09/06/2016 | 4.6 |
| 09/06/2016 | 4.6 |
| 09/06/2016 | 4.5 |
| 09/06/2016 | 4.1 |
| 09/06/2016 | 3.9 |
| 09/06/2016 | 3.5 |
| 09/06/2016 | 3.1 |
| 09/06/2016 | 2.8 |
| 10/06/2016 | 2.5 |
| 10/06/2016 | 2.4 |
| 10/06/2016 | 2.4 |
| 10/06/2016 | 2.5 |
| 10/06/2016 | 2.7 |
| 10/06/2016 | 3.3 |
| 10/06/2016 | 3.9 |
| 10/06/2016 | 4.4 |
| 10/06/2016 | 4.6 |
| 10/06/2016 | 4.8 |
| 10/06/2016 | 4.8 |
| 10/06/2016 | 4.8 |
| 10/06/2016 | 4.7 |
| 10/06/2016 | 4.6 |
| 10/06/2016 | 4.5 |
| 10/06/2016 | 4.4 |
| 10/06/2016 | 4.4 |
| 10/06/2016 | 4.4 |
| 10/06/2016 | 4.3 |
| 10/06/2016 | 3.9 |
| 10/06/2016 | 3.7 |
| 10/06/2016 | 3.4 |
| 10/06/2016 | 3 |
| 10/06/2016 | 2.7 |
| 11/06/2016 | 2.5 |
| 11/06/2016 | 2.4 |
| 11/06/2016 | 2.4 |
| 11/06/2016 | 2.3 |
| 11/06/2016 | 2.3 |
| 11/06/2016 | 2.5 |
| 11/06/2016 | 2.8 |
| 11/06/2016 | 3.2 |
| 11/06/2016 | 3.5 |
| 11/06/2016 | 3.8 |
| 11/06/2016 | 3.9 |
| 11/06/2016 | 3.9 |
| 11/06/2016 | 3.8 |
| 11/06/2016 | 3.7 |
| 11/06/2016 | 3.6 |
| 11/06/2016 | 3.6 |
| 11/06/2016 | 3.6 |
| 11/06/2016 | 3.7 |
| 11/06/2016 | 3.6 |
| 11/06/2016 | 3.4 |
| 11/06/2016 | 3.3 |
| 11/06/2016 | 3.1 |
| 11/06/2016 | 2.8 |
| 11/06/2016 | 2.6 |
| 12/06/2016 | 2.4 |
| 12/06/2016 | 2.3 |
| 12/06/2016 | 2.3 |
| 12/06/2016 | 2.2 |
| 12/06/2016 | 2.2 |
| 12/06/2016 | 2.3 |
| 12/06/2016 | 2.4 |
| 12/06/2016 | 2.7 |
| 12/06/2016 | 3 |
| 12/06/2016 | 3.2 |
| 12/06/2016 | 3.4 |
| 12/06/2016 | 3.5 |
| 12/06/2016 | 3.4 |
| 12/06/2016 | 3.3 |
| 12/06/2016 | 3.2 |
| 12/06/2016 | 3.2 |
| 12/06/2016 | 3.3 |
| 12/06/2016 | 3.4 |
| 12/06/2016 | 3.4 |
| 12/06/2016 | 3.3 |
| 12/06/2016 | 3.3 |
| 12/06/2016 | 3.2 |
| 12/06/2016 | 2.9 |
| 12/06/2016 | 2.6 |
| 13/06/2016 | 2.4 |
| 13/06/2016 | 2.3 |
| 13/06/2016 | 2.3 |
| 13/06/2016 | 2.4 |
| 13/06/2016 | 2.6 |
| 13/06/2016 | 3.2 |
| 13/06/2016 | 3.9 |
| 13/06/2016 | 4.3 |
| 13/06/2016 | 4.5 |
| 13/06/2016 | 4.7 |
| 13/06/2016 | 4.7 |
| 13/06/2016 | 4.8 |
| 13/06/2016 | 4.7 |
| 13/06/2016 | 4.7 |
| 13/06/2016 | 4.6 |
| 13/06/2016 | 4.5 |
| 13/06/2016 | 4.5 |
| 13/06/2016 | 4.5 |
| 13/06/2016 | 4.4 |
| 13/06/2016 | 4.1 |
| 13/06/2016 | 3.8 |
| 13/06/2016 | 3.5 |
| 13/06/2016 | 3.1 |
| 13/06/2016 | 2.7 |
| 14/06/2016 | 2.5 |
| 14/06/2016 | 2.4 |
| 14/06/2016 | 2.4 |
| 14/06/2016 | 2.5 |
| 14/06/2016 | 2.7 |
| 14/06/2016 | 3.3 |
| 14/06/2016 | 3.9 |
| 14/06/2016 | 4.4 |
| 14/06/2016 | 4.6 |
| 14/06/2016 | 4.7 |
| 14/06/2016 | 4.8 |
| 14/06/2016 | 4.8 |
| 14/06/2016 | 4.8 |
| 14/06/2016 | 4.7 |
| 14/06/2016 | 4.6 |
| 14/06/2016 | 4.6 |
| 14/06/2016 | 4.6 |
| 14/06/2016 | 4.6 |
| 14/06/2016 | 4.5 |
| 14/06/2016 | 4.1 |
| 14/06/2016 | 3.8 |
| 14/06/2016 | 3.5 |
| 14/06/2016 | 3.1 |
| 14/06/2016 | 2.7 |
| 15/06/2016 | 2.5 |
| 15/06/2016 | 2.4 |
| 15/06/2016 | 2.4 |
| 15/06/2016 | 2.5 |
| 15/06/2016 | 2.7 |
| 15/06/2016 | 3.3 |
| 15/06/2016 | 3.9 |
| 15/06/2016 | 4.4 |
| 15/06/2016 | 4.6 |
| 15/06/2016 | 4.8 |
| 15/06/2016 | 4.8 |
| 15/06/2016 | 4.8 |
| 15/06/2016 | 4.8 |
| 15/06/2016 | 4.7 |
| 15/06/2016 | 4.6 |
| 15/06/2016 | 4.6 |
| 15/06/2016 | 4.6 |
| 15/06/2016 | 4.6 |
| 15/06/2016 | 4.5 |
| 15/06/2016 | 4.1 |
| 15/06/2016 | 3.8 |
| 15/06/2016 | 3.5 |
| 15/06/2016 | 3.1 |
| 15/06/2016 | 2.8 |
| 16/06/2016 | 2.5 |
| 16/06/2016 | 2.4 |
| 16/06/2016 | 2.4 |
| 16/06/2016 | 2.5 |
| 16/06/2016 | 2.7 |
| 16/06/2016 | 3.3 |
| 16/06/2016 | 3.9 |
| 16/06/2016 | 4.4 |
| 16/06/2016 | 4.6 |
| 16/06/2016 | 4.8 |
| 16/06/2016 | 4.8 |
| 16/06/2016 | 4.9 |
| 16/06/2016 | 4.8 |
| 16/06/2016 | 4.7 |
| 16/06/2016 | 4.7 |
| 16/06/2016 | 4.6 |
| 16/06/2016 | 4.6 |
| 16/06/2016 | 4.6 |
| 16/06/2016 | 4.5 |
| 16/06/2016 | 4.1 |
| 16/06/2016 | 3.8 |
| 16/06/2016 | 3.5 |
| 16/06/2016 | 3.1 |
| 16/06/2016 | 2.8 |
| 17/06/2016 | 2.5 |
| 17/06/2016 | 2.4 |
| 17/06/2016 | 2.4 |
| 17/06/2016 | 2.5 |
| 17/06/2016 | 2.7 |
| 17/06/2016 | 3.3 |
| 17/06/2016 | 3.9 |
| 17/06/2016 | 4.4 |
| 17/06/2016 | 4.6 |
| 17/06/2016 | 4.7 |
| 17/06/2016 | 4.8 |
| 17/06/2016 | 4.8 |
| 17/06/2016 | 4.7 |
| 17/06/2016 | 4.6 |
| 17/06/2016 | 4.5 |
| 17/06/2016 | 4.4 |
| 17/06/2016 | 4.4 |
| 17/06/2016 | 4.4 |
| 17/06/2016 | 4.2 |
| 17/06/2016 | 3.9 |
| 17/06/2016 | 3.6 |
| 17/06/2016 | 3.4 |
| 17/06/2016 | 3 |
| 17/06/2016 | 2.7 |
| 18/06/2016 | 2.5 |
| 18/06/2016 | 2.4 |
| 18/06/2016 | 2.4 |
| 18/06/2016 | 2.3 |
| 18/06/2016 | 2.3 |
| 18/06/2016 | 2.5 |
| 18/06/2016 | 2.8 |
| 18/06/2016 | 3.2 |
| 18/06/2016 | 3.5 |
| 18/06/2016 | 3.8 |
| 18/06/2016 | 3.9 |
| 18/06/2016 | 3.9 |
| 18/06/2016 | 3.8 |
| 18/06/2016 | 3.7 |
| 18/06/2016 | 3.6 |
| 18/06/2016 | 3.6 |
| 18/06/2016 | 3.6 |
| 18/06/2016 | 3.7 |
| 18/06/2016 | 3.6 |
| 18/06/2016 | 3.4 |
| 18/06/2016 | 3.3 |
| 18/06/2016 | 3.1 |
| 18/06/2016 | 2.8 |
| 18/06/2016 | 2.6 |
| 19/06/2016 | 2.4 |
| 19/06/2016 | 2.3 |
| 19/06/2016 | 2.3 |
| 19/06/2016 | 2.2 |
| 19/06/2016 | 2.2 |
| 19/06/2016 | 2.3 |
| 19/06/2016 | 2.4 |
| 19/06/2016 | 2.7 |
| 19/06/2016 | 3 |
| 19/06/2016 | 3.2 |
| 19/06/2016 | 3.4 |
| 19/06/2016 | 3.5 |
| 19/06/2016 | 3.4 |
| 19/06/2016 | 3.3 |
| 19/06/2016 | 3.2 |
| 19/06/2016 | 3.2 |
| 19/06/2016 | 3.3 |
| 19/06/2016 | 3.4 |
| 19/06/2016 | 3.4 |
| 19/06/2016 | 3.3 |
| 19/06/2016 | 3.2 |
| 19/06/2016 | 3.2 |
| 19/06/2016 | 2.9 |
| 19/06/2016 | 2.6 |
| 20/06/2016 | 2.4 |
| 20/06/2016 | 2.3 |
| 20/06/2016 | 2.3 |
| 20/06/2016 | 2.4 |
| 20/06/2016 | 2.6 |
| 20/06/2016 | 3.2 |
| 20/06/2016 | 3.9 |
| 20/06/2016 | 4.3 |
| 20/06/2016 | 4.5 |
| 20/06/2016 | 4.7 |
| 20/06/2016 | 4.7 |
| 20/06/2016 | 4.8 |
| 20/06/2016 | 4.7 |
| 20/06/2016 | 4.7 |
| 20/06/2016 | 4.6 |
| 20/06/2016 | 4.5 |
| 20/06/2016 | 4.5 |
| 20/06/2016 | 4.5 |
| 20/06/2016 | 4.4 |
| 20/06/2016 | 4.1 |
| 20/06/2016 | 3.8 |
| 20/06/2016 | 3.5 |
| 20/06/2016 | 3.1 |
| 20/06/2016 | 2.7 |
| 21/06/2016 | 2.5 |
| 21/06/2016 | 2.4 |
| 21/06/2016 | 2.4 |
| 21/06/2016 | 2.5 |
| 21/06/2016 | 2.7 |
| 21/06/2016 | 3.3 |
| 21/06/2016 | 3.9 |
| 21/06/2016 | 4.4 |
| 21/06/2016 | 4.6 |
| 21/06/2016 | 4.7 |
| 21/06/2016 | 4.8 |
| 21/06/2016 | 4.8 |
| 21/06/2016 | 4.8 |
| 21/06/2016 | 4.7 |
| 21/06/2016 | 4.6 |
| 21/06/2016 | 4.5 |
| 21/06/2016 | 4.6 |
| 21/06/2016 | 4.6 |
| 21/06/2016 | 4.4 |
| 21/06/2016 | 4.1 |
| 21/06/2016 | 3.8 |
| 21/06/2016 | 3.5 |
| 21/06/2016 | 3.1 |
| 21/06/2016 | 2.7 |
| 22/06/2016 | 2.5 |
| 22/06/2016 | 2.4 |
| 22/06/2016 | 2.4 |
| 22/06/2016 | 2.5 |
| 22/06/2016 | 2.7 |
| 22/06/2016 | 3.3 |
| 22/06/2016 | 4 |
| 22/06/2016 | 4.4 |
| 22/06/2016 | 4.6 |
| 22/06/2016 | 4.7 |
| 22/06/2016 | 4.8 |
| 22/06/2016 | 4.8 |
| 22/06/2016 | 4.8 |
| 22/06/2016 | 4.7 |
| 22/06/2016 | 4.6 |
| 22/06/2016 | 4.6 |
| 22/06/2016 | 4.6 |
| 22/06/2016 | 4.6 |
| 22/06/2016 | 4.4 |
| 22/06/2016 | 4.1 |
| 22/06/2016 | 3.8 |
| 22/06/2016 | 3.5 |
| 22/06/2016 | 3.1 |
| 22/06/2016 | 2.8 |
| 23/06/2016 | 2.5 |
| 23/06/2016 | 2.4 |
| 23/06/2016 | 2.4 |
| 23/06/2016 | 2.5 |
| 23/06/2016 | 2.7 |
| 23/06/2016 | 3.3 |
| 23/06/2016 | 4 |
| 23/06/2016 | 4.4 |
| 23/06/2016 | 4.6 |
| 23/06/2016 | 4.8 |
| 23/06/2016 | 4.8 |
| 23/06/2016 | 4.9 |
| 23/06/2016 | 4.8 |
| 23/06/2016 | 4.7 |
| 23/06/2016 | 4.7 |
| 23/06/2016 | 4.6 |
| 23/06/2016 | 4.6 |
| 23/06/2016 | 4.6 |
| 23/06/2016 | 4.5 |
| 23/06/2016 | 4.1 |
| 23/06/2016 | 3.8 |
| 23/06/2016 | 3.5 |
| 23/06/2016 | 3.1 |
| 23/06/2016 | 2.8 |
| 24/06/2016 | 2.5 |
| 24/06/2016 | 2.4 |
| 24/06/2016 | 2.4 |
| 24/06/2016 | 2.5 |
| 24/06/2016 | 2.7 |
| 24/06/2016 | 3.3 |
| 24/06/2016 | 3.9 |
| 24/06/2016 | 4.4 |
| 24/06/2016 | 4.6 |
| 24/06/2016 | 4.7 |
| 24/06/2016 | 4.8 |
| 24/06/2016 | 4.8 |
| 24/06/2016 | 4.7 |
| 24/06/2016 | 4.6 |
| 24/06/2016 | 4.5 |
| 24/06/2016 | 4.4 |
| 24/06/2016 | 4.4 |
| 24/06/2016 | 4.4 |
| 24/06/2016 | 4.2 |
| 24/06/2016 | 3.9 |
| 24/06/2016 | 3.6 |
| 24/06/2016 | 3.4 |
| 24/06/2016 | 3 |
| 24/06/2016 | 2.7 |
| 25/06/2016 | 2.5 |
| 25/06/2016 | 2.4 |
| 25/06/2016 | 2.4 |
| 25/06/2016 | 2.3 |
| 25/06/2016 | 2.4 |
| 25/06/2016 | 2.5 |
| 25/06/2016 | 2.8 |
| 25/06/2016 | 3.2 |
| 25/06/2016 | 3.5 |
| 25/06/2016 | 3.8 |
| 25/06/2016 | 3.9 |
| 25/06/2016 | 3.9 |
| 25/06/2016 | 3.8 |
| 25/06/2016 | 3.7 |
| 25/06/2016 | 3.6 |
| 25/06/2016 | 3.6 |
| 25/06/2016 | 3.6 |
| 25/06/2016 | 3.7 |
| 25/06/2016 | 3.6 |
| 25/06/2016 | 3.4 |
| 25/06/2016 | 3.2 |
| 25/06/2016 | 3.1 |
| 25/06/2016 | 2.8 |
| 25/06/2016 | 2.6 |
| 26/06/2016 | 2.4 |
| 26/06/2016 | 2.3 |
| 26/06/2016 | 2.3 |
| 26/06/2016 | 2.2 |
| 26/06/2016 | 2.2 |
| 26/06/2016 | 2.3 |
| 26/06/2016 | 2.4 |
| 26/06/2016 | 2.7 |
| 26/06/2016 | 3 |
| 26/06/2016 | 3.2 |
| 26/06/2016 | 3.4 |
| 26/06/2016 | 3.5 |
| 26/06/2016 | 3.4 |
| 26/06/2016 | 3.3 |
| 26/06/2016 | 3.2 |
| 26/06/2016 | 3.2 |
| 26/06/2016 | 3.3 |
| 26/06/2016 | 3.4 |
| 26/06/2016 | 3.4 |
| 26/06/2016 | 3.3 |
| 26/06/2016 | 3.2 |
| 26/06/2016 | 3.2 |
| 26/06/2016 | 2.9 |
| 26/06/2016 | 2.6 |
| 27/06/2016 | 2.4 |
| 27/06/2016 | 2.3 |
| 27/06/2016 | 2.3 |
| 27/06/2016 | 2.4 |
| 27/06/2016 | 2.6 |
| 27/06/2016 | 3.3 |
| 27/06/2016 | 3.9 |
| 27/06/2016 | 4.3 |
| 27/06/2016 | 4.5 |
| 27/06/2016 | 4.7 |
| 27/06/2016 | 4.7 |
| 27/06/2016 | 4.8 |
| 27/06/2016 | 4.7 |
| 27/06/2016 | 4.6 |
| 27/06/2016 | 4.6 |
| 27/06/2016 | 4.5 |
| 27/06/2016 | 4.5 |
| 27/06/2016 | 4.5 |
| 27/06/2016 | 4.4 |
| 27/06/2016 | 4.1 |
| 27/06/2016 | 3.7 |
| 27/06/2016 | 3.5 |
| 27/06/2016 | 3.1 |
| 27/06/2016 | 2.7 |
| 28/06/2016 | 2.5 |
| 28/06/2016 | 2.4 |
| 28/06/2016 | 2.4 |
| 28/06/2016 | 2.5 |
| 28/06/2016 | 2.7 |
| 28/06/2016 | 3.3 |
| 28/06/2016 | 3.9 |
| 28/06/2016 | 4.4 |
| 28/06/2016 | 4.6 |
| 28/06/2016 | 4.7 |
| 28/06/2016 | 4.8 |
| 28/06/2016 | 4.8 |
| 28/06/2016 | 4.8 |
| 28/06/2016 | 4.7 |
| 28/06/2016 | 4.6 |
| 28/06/2016 | 4.5 |
| 28/06/2016 | 4.6 |
| 28/06/2016 | 4.5 |
| 28/06/2016 | 4.4 |
| 28/06/2016 | 4.1 |
| 28/06/2016 | 3.8 |
| 28/06/2016 | 3.5 |
| 28/06/2016 | 3.1 |
| 28/06/2016 | 2.7 |
| 29/06/2016 | 2.5 |
| 29/06/2016 | 2.4 |
| 29/06/2016 | 2.4 |
| 29/06/2016 | 2.5 |
| 29/06/2016 | 2.7 |
| 29/06/2016 | 3.3 |
| 29/06/2016 | 4 |
| 29/06/2016 | 4.4 |
| 29/06/2016 | 4.6 |
| 29/06/2016 | 4.7 |
| 29/06/2016 | 4.8 |
| 29/06/2016 | 4.8 |
| 29/06/2016 | 4.8 |
| 29/06/2016 | 4.7 |
| 29/06/2016 | 4.6 |
| 29/06/2016 | 4.5 |
| 29/06/2016 | 4.6 |
| 29/06/2016 | 4.6 |
| 29/06/2016 | 4.4 |
| 29/06/2016 | 4.1 |
| 29/06/2016 | 3.8 |
| 29/06/2016 | 3.5 |
| 29/06/2016 | 3.1 |
| 29/06/2016 | 2.8 |
| 30/06/2016 | 2.5 |
| 30/06/2016 | 2.4 |
| 30/06/2016 | 2.4 |
| 30/06/2016 | 2.5 |
| 30/06/2016 | 2.7 |
| 30/06/2016 | 3.3 |
| 30/06/2016 | 4 |
| 30/06/2016 | 4.4 |
| 30/06/2016 | 4.6 |
| 30/06/2016 | 4.8 |
| 30/06/2016 | 4.8 |
| 30/06/2016 | 4.9 |
| 30/06/2016 | 4.8 |
| 30/06/2016 | 4.7 |
| 30/06/2016 | 4.6 |
| 30/06/2016 | 4.6 |
| 30/06/2016 | 4.6 |
| 30/06/2016 | 4.6 |
| 30/06/2016 | 4.4 |
| 30/06/2016 | 4.1 |
| 30/06/2016 | 3.8 |
| 30/06/2016 | 3.5 |
| 30/06/2016 | 3.1 |
| 30/06/2016 | 2.8 |
| 01/07/2016 | 2.5 |
| 01/07/2016 | 2.4 |
| 01/07/2016 | 2.4 |
| 01/07/2016 | 2.5 |
| 01/07/2016 | 2.7 |
| 01/07/2016 | 3.3 |
| 01/07/2016 | 3.9 |
| 01/07/2016 | 4.4 |
| 01/07/2016 | 4.6 |
| 01/07/2016 | 4.7 |
| 01/07/2016 | 4.8 |
| 01/07/2016 | 4.8 |
| 01/07/2016 | 4.7 |
| 01/07/2016 | 4.6 |
| 01/07/2016 | 4.5 |
| 01/07/2016 | 4.4 |
| 01/07/2016 | 4.4 |
| 01/07/2016 | 4.4 |
| 01/07/2016 | 4.2 |
| 01/07/2016 | 3.9 |
| 01/07/2016 | 3.6 |
| 01/07/2016 | 3.4 |
| 01/07/2016 | 3 |
| 01/07/2016 | 2.7 |
| 02/07/2016 | 2.5 |
| 02/07/2016 | 2.4 |
| 02/07/2016 | 2.4 |
| 02/07/2016 | 2.3 |
| 02/07/2016 | 2.4 |
| 02/07/2016 | 2.5 |
| 02/07/2016 | 2.8 |
| 02/07/2016 | 3.2 |
| 02/07/2016 | 3.5 |
| 02/07/2016 | 3.8 |
| 02/07/2016 | 3.9 |
| 02/07/2016 | 3.9 |
| 02/07/2016 | 3.8 |
| 02/07/2016 | 3.7 |
| 02/07/2016 | 3.6 |
| 02/07/2016 | 3.6 |
| 02/07/2016 | 3.6 |
| 02/07/2016 | 3.6 |
| 02/07/2016 | 3.6 |
| 02/07/2016 | 3.4 |
| 02/07/2016 | 3.2 |
| 02/07/2016 | 3.1 |
| 02/07/2016 | 2.8 |
| 02/07/2016 | 2.6 |
| 03/07/2016 | 2.4 |
| 03/07/2016 | 2.3 |
| 03/07/2016 | 2.3 |
| 03/07/2016 | 2.2 |
| 03/07/2016 | 2.2 |
| 03/07/2016 | 2.3 |
| 03/07/2016 | 2.4 |
| 03/07/2016 | 2.7 |
| 03/07/2016 | 3 |
| 03/07/2016 | 3.2 |
| 03/07/2016 | 3.4 |
| 03/07/2016 | 3.5 |
| 03/07/2016 | 3.4 |
| 03/07/2016 | 3.3 |
| 03/07/2016 | 3.2 |
| 03/07/2016 | 3.2 |
| 03/07/2016 | 3.3 |
| 03/07/2016 | 3.4 |
| 03/07/2016 | 3.4 |
| 03/07/2016 | 3.3 |
| 03/07/2016 | 3.2 |
| 03/07/2016 | 3.2 |
| 03/07/2016 | 2.9 |
| 03/07/2016 | 2.6 |
| 04/07/2016 | 2.4 |
| 04/07/2016 | 2.3 |
| 04/07/2016 | 2.3 |
| 04/07/2016 | 2.4 |
| 04/07/2016 | 2.6 |
| 04/07/2016 | 3.3 |
| 04/07/2016 | 3.9 |
| 04/07/2016 | 4.3 |
| 04/07/2016 | 4.5 |
| 04/07/2016 | 4.7 |
| 04/07/2016 | 4.7 |
| 04/07/2016 | 4.8 |
| 04/07/2016 | 4.7 |
| 04/07/2016 | 4.6 |
| 04/07/2016 | 4.6 |
| 04/07/2016 | 4.5 |
| 04/07/2016 | 4.5 |
| 04/07/2016 | 4.5 |
| 04/07/2016 | 4.4 |
| 04/07/2016 | 4.1 |
| 04/07/2016 | 3.7 |
| 04/07/2016 | 3.5 |
| 04/07/2016 | 3.1 |
| 04/07/2016 | 2.7 |
| 05/07/2016 | 2.5 |
| 05/07/2016 | 2.4 |
| 05/07/2016 | 2.4 |
| 05/07/2016 | 2.5 |
| 05/07/2016 | 2.7 |
| 05/07/2016 | 3.3 |
| 05/07/2016 | 3.9 |
| 05/07/2016 | 4.4 |
| 05/07/2016 | 4.6 |
| 05/07/2016 | 4.7 |
| 05/07/2016 | 4.8 |
| 05/07/2016 | 4.8 |
| 05/07/2016 | 4.8 |
| 05/07/2016 | 4.7 |
| 05/07/2016 | 4.6 |
| 05/07/2016 | 4.5 |
| 05/07/2016 | 4.6 |
| 05/07/2016 | 4.5 |
| 05/07/2016 | 4.4 |
| 05/07/2016 | 4.1 |
| 05/07/2016 | 3.8 |
| 05/07/2016 | 3.5 |
| 05/07/2016 | 3.1 |
| 05/07/2016 | 2.8 |
| 06/07/2016 | 2.5 |
| 06/07/2016 | 2.4 |
| 06/07/2016 | 2.4 |
| 06/07/2016 | 2.5 |
| 06/07/2016 | 2.7 |
| 06/07/2016 | 3.3 |
| 06/07/2016 | 4 |
| 06/07/2016 | 4.4 |
| 06/07/2016 | 4.6 |
| 06/07/2016 | 4.7 |
| 06/07/2016 | 4.8 |
| 06/07/2016 | 4.8 |
| 06/07/2016 | 4.8 |
| 06/07/2016 | 4.7 |
| 06/07/2016 | 4.6 |
| 06/07/2016 | 4.5 |
| 06/07/2016 | 4.6 |
| 06/07/2016 | 4.6 |
| 06/07/2016 | 4.4 |
| 06/07/2016 | 4.1 |
| 06/07/2016 | 3.8 |
| 06/07/2016 | 3.5 |
| 06/07/2016 | 3.1 |
| 06/07/2016 | 2.8 |
| 07/07/2016 | 2.5 |
| 07/07/2016 | 2.4 |
| 07/07/2016 | 2.4 |
| 07/07/2016 | 2.5 |
| 07/07/2016 | 2.7 |
| 07/07/2016 | 3.3 |
| 07/07/2016 | 4 |
| 07/07/2016 | 4.4 |
| 07/07/2016 | 4.6 |
| 07/07/2016 | 4.8 |
| 07/07/2016 | 4.8 |
| 07/07/2016 | 4.9 |
| 07/07/2016 | 4.8 |
| 07/07/2016 | 4.7 |
| 07/07/2016 | 4.6 |
| 07/07/2016 | 4.6 |
| 07/07/2016 | 4.6 |
| 07/07/2016 | 4.6 |
| 07/07/2016 | 4.4 |
| 07/07/2016 | 4.1 |
| 07/07/2016 | 3.8 |
| 07/07/2016 | 3.5 |
| 07/07/2016 | 3.1 |
| 07/07/2016 | 2.8 |
| 08/07/2016 | 2.5 |
| 08/07/2016 | 2.4 |
| 08/07/2016 | 2.4 |
| 08/07/2016 | 2.5 |
| 08/07/2016 | 2.7 |
| 08/07/2016 | 3.3 |
| 08/07/2016 | 3.9 |
| 08/07/2016 | 4.4 |
| 08/07/2016 | 4.6 |
| 08/07/2016 | 4.7 |
| 08/07/2016 | 4.8 |
| 08/07/2016 | 4.8 |
| 08/07/2016 | 4.7 |
| 08/07/2016 | 4.6 |
| 08/07/2016 | 4.5 |
| 08/07/2016 | 4.4 |
| 08/07/2016 | 4.4 |
| 08/07/2016 | 4.4 |
| 08/07/2016 | 4.2 |
| 08/07/2016 | 3.9 |
| 08/07/2016 | 3.6 |
| 08/07/2016 | 3.4 |
| 08/07/2016 | 3 |
| 08/07/2016 | 2.7 |
| 09/07/2016 | 2.5 |
| 09/07/2016 | 2.4 |
| 09/07/2016 | 2.4 |
| 09/07/2016 | 2.4 |
| 09/07/2016 | 2.4 |
| 09/07/2016 | 2.5 |
| 09/07/2016 | 2.8 |
| 09/07/2016 | 3.2 |
| 09/07/2016 | 3.5 |
| 09/07/2016 | 3.8 |
| 09/07/2016 | 3.9 |
| 09/07/2016 | 3.9 |
| 09/07/2016 | 3.8 |
| 09/07/2016 | 3.7 |
| 09/07/2016 | 3.6 |
| 09/07/2016 | 3.6 |
| 09/07/2016 | 3.6 |
| 09/07/2016 | 3.6 |
| 09/07/2016 | 3.6 |
| 09/07/2016 | 3.4 |
| 09/07/2016 | 3.2 |
| 09/07/2016 | 3.1 |
| 09/07/2016 | 2.8 |
| 09/07/2016 | 2.6 |
| 10/07/2016 | 2.4 |
| 10/07/2016 | 2.3 |
| 10/07/2016 | 2.3 |
| 10/07/2016 | 2.3 |
| 10/07/2016 | 2.2 |
| 10/07/2016 | 2.3 |
| 10/07/2016 | 2.4 |
| 10/07/2016 | 2.7 |
| 10/07/2016 | 3 |
| 10/07/2016 | 3.2 |
| 10/07/2016 | 3.4 |
| 10/07/2016 | 3.5 |
| 10/07/2016 | 3.4 |
| 10/07/2016 | 3.3 |
| 10/07/2016 | 3.2 |
| 10/07/2016 | 3.2 |
| 10/07/2016 | 3.3 |
| 10/07/2016 | 3.4 |
| 10/07/2016 | 3.3 |
| 10/07/2016 | 3.3 |
| 10/07/2016 | 3.2 |
| 10/07/2016 | 3.2 |
| 10/07/2016 | 2.8 |
| 10/07/2016 | 2.6 |
| 11/07/2016 | 2.4 |
| 11/07/2016 | 2.3 |
| 11/07/2016 | 2.3 |
| 11/07/2016 | 2.4 |
| 11/07/2016 | 2.6 |
| 11/07/2016 | 3.2 |
| 11/07/2016 | 3.9 |
| 11/07/2016 | 4.3 |
| 11/07/2016 | 4.5 |
| 11/07/2016 | 4.7 |
| 11/07/2016 | 4.7 |
| 11/07/2016 | 4.8 |
| 11/07/2016 | 4.7 |
| 11/07/2016 | 4.6 |
| 11/07/2016 | 4.6 |
| 11/07/2016 | 4.5 |
| 11/07/2016 | 4.5 |
| 11/07/2016 | 4.5 |
| 11/07/2016 | 4.4 |
| 11/07/2016 | 4.1 |
| 11/07/2016 | 3.8 |
| 11/07/2016 | 3.5 |
| 11/07/2016 | 3 |
| 11/07/2016 | 2.7 |
| 12/07/2016 | 2.5 |
| 12/07/2016 | 2.4 |
| 12/07/2016 | 2.4 |
| 12/07/2016 | 2.5 |
| 12/07/2016 | 2.7 |
| 12/07/2016 | 3.3 |
| 12/07/2016 | 3.9 |
| 12/07/2016 | 4.3 |
| 12/07/2016 | 4.6 |
| 12/07/2016 | 4.7 |
| 12/07/2016 | 4.8 |
| 12/07/2016 | 4.8 |
| 12/07/2016 | 4.8 |
| 12/07/2016 | 4.7 |
| 12/07/2016 | 4.6 |
| 12/07/2016 | 4.5 |
| 12/07/2016 | 4.6 |
| 12/07/2016 | 4.5 |
| 12/07/2016 | 4.4 |
| 12/07/2016 | 4.1 |
| 12/07/2016 | 3.8 |
| 12/07/2016 | 3.5 |
| 12/07/2016 | 3.1 |
| 12/07/2016 | 2.7 |
| 13/07/2016 | 2.5 |
| 13/07/2016 | 2.4 |
| 13/07/2016 | 2.4 |
| 13/07/2016 | 2.5 |
| 13/07/2016 | 2.7 |
| 13/07/2016 | 3.3 |
| 13/07/2016 | 3.9 |
| 13/07/2016 | 4.4 |
| 13/07/2016 | 4.6 |
| 13/07/2016 | 4.7 |
| 13/07/2016 | 4.8 |
| 13/07/2016 | 4.8 |
| 13/07/2016 | 4.8 |
| 13/07/2016 | 4.7 |
| 13/07/2016 | 4.6 |
| 13/07/2016 | 4.5 |
| 13/07/2016 | 4.6 |
| 13/07/2016 | 4.5 |
| 13/07/2016 | 4.4 |
| 13/07/2016 | 4.1 |
| 13/07/2016 | 3.8 |
| 13/07/2016 | 3.5 |
| 13/07/2016 | 3.1 |
| 13/07/2016 | 2.8 |
| 14/07/2016 | 2.5 |
| 14/07/2016 | 2.4 |
| 14/07/2016 | 2.4 |
| 14/07/2016 | 2.5 |
| 14/07/2016 | 2.7 |
| 14/07/2016 | 3.3 |
| 14/07/2016 | 3.9 |
| 14/07/2016 | 4.4 |
| 14/07/2016 | 4.6 |
| 14/07/2016 | 4.7 |
| 14/07/2016 | 4.8 |
| 14/07/2016 | 4.9 |
| 14/07/2016 | 4.8 |
| 14/07/2016 | 4.7 |
| 14/07/2016 | 4.6 |
| 14/07/2016 | 4.6 |
| 14/07/2016 | 4.6 |
| 14/07/2016 | 4.5 |
| 14/07/2016 | 4.4 |
| 14/07/2016 | 4.1 |
| 14/07/2016 | 3.8 |
| 14/07/2016 | 3.5 |
| 14/07/2016 | 3.1 |
| 14/07/2016 | 2.8 |
| 15/07/2016 | 2.5 |
| 15/07/2016 | 2.4 |
| 15/07/2016 | 2.4 |
| 15/07/2016 | 2.5 |
| 15/07/2016 | 2.7 |
| 15/07/2016 | 3.3 |
| 15/07/2016 | 3.9 |
| 15/07/2016 | 4.3 |
| 15/07/2016 | 4.6 |
| 15/07/2016 | 4.7 |
| 15/07/2016 | 4.8 |
| 15/07/2016 | 4.8 |
| 15/07/2016 | 4.7 |
| 15/07/2016 | 4.6 |
| 15/07/2016 | 4.5 |
| 15/07/2016 | 4.4 |
| 15/07/2016 | 4.4 |
| 15/07/2016 | 4.4 |
| 15/07/2016 | 4.2 |
| 15/07/2016 | 3.9 |
| 15/07/2016 | 3.7 |
| 15/07/2016 | 3.4 |
| 15/07/2016 | 3 |
| 15/07/2016 | 2.7 |
| 16/07/2016 | 2.5 |
| 16/07/2016 | 2.4 |
| 16/07/2016 | 2.4 |
| 16/07/2016 | 2.4 |
| 16/07/2016 | 2.4 |
| 16/07/2016 | 2.5 |
| 16/07/2016 | 2.7 |
| 16/07/2016 | 3.2 |
| 16/07/2016 | 3.5 |
| 16/07/2016 | 3.8 |
| 16/07/2016 | 3.9 |
| 16/07/2016 | 3.9 |
| 16/07/2016 | 3.8 |
| 16/07/2016 | 3.7 |
| 16/07/2016 | 3.6 |
| 16/07/2016 | 3.6 |
| 16/07/2016 | 3.6 |
| 16/07/2016 | 3.6 |
| 16/07/2016 | 3.6 |
| 16/07/2016 | 3.5 |
| 16/07/2016 | 3.3 |
| 16/07/2016 | 3.1 |
| 16/07/2016 | 2.8 |
| 16/07/2016 | 2.6 |
| 17/07/2016 | 2.4 |
| 17/07/2016 | 2.3 |
| 17/07/2016 | 2.3 |
| 17/07/2016 | 2.3 |
| 17/07/2016 | 2.2 |
| 17/07/2016 | 2.3 |
| 17/07/2016 | 2.4 |
| 17/07/2016 | 2.7 |
| 17/07/2016 | 3 |
| 17/07/2016 | 3.2 |
| 17/07/2016 | 3.4 |
| 17/07/2016 | 3.5 |
| 17/07/2016 | 3.4 |
| 17/07/2016 | 3.3 |
| 17/07/2016 | 3.2 |
| 17/07/2016 | 3.2 |
| 17/07/2016 | 3.3 |
| 17/07/2016 | 3.4 |
| 17/07/2016 | 3.3 |
| 17/07/2016 | 3.3 |
| 17/07/2016 | 3.3 |
| 17/07/2016 | 3.2 |
| 17/07/2016 | 2.8 |
| 17/07/2016 | 2.6 |
| 18/07/2016 | 2.4 |
| 18/07/2016 | 2.3 |
| 18/07/2016 | 2.3 |
| 18/07/2016 | 2.4 |
| 18/07/2016 | 2.7 |
| 18/07/2016 | 3.2 |
| 18/07/2016 | 3.8 |
| 18/07/2016 | 4.3 |
| 18/07/2016 | 4.5 |
| 18/07/2016 | 4.7 |
| 18/07/2016 | 4.7 |
| 18/07/2016 | 4.8 |
| 18/07/2016 | 4.7 |
| 18/07/2016 | 4.6 |
| 18/07/2016 | 4.6 |
| 18/07/2016 | 4.5 |
| 18/07/2016 | 4.5 |
| 18/07/2016 | 4.5 |
| 18/07/2016 | 4.4 |
| 18/07/2016 | 4.1 |
| 18/07/2016 | 3.8 |
| 18/07/2016 | 3.5 |
| 18/07/2016 | 3 |
| 18/07/2016 | 2.7 |
| 19/07/2016 | 2.5 |
| 19/07/2016 | 2.4 |
| 19/07/2016 | 2.4 |
| 19/07/2016 | 2.5 |
| 19/07/2016 | 2.7 |
| 19/07/2016 | 3.3 |
| 19/07/2016 | 3.9 |
| 19/07/2016 | 4.3 |
| 19/07/2016 | 4.6 |
| 19/07/2016 | 4.7 |
| 19/07/2016 | 4.8 |
| 19/07/2016 | 4.8 |
| 19/07/2016 | 4.8 |
| 19/07/2016 | 4.7 |
| 19/07/2016 | 4.6 |
| 19/07/2016 | 4.5 |
| 19/07/2016 | 4.6 |
| 19/07/2016 | 4.5 |
| 19/07/2016 | 4.4 |
| 19/07/2016 | 4.1 |
| 19/07/2016 | 3.9 |
| 19/07/2016 | 3.5 |
| 19/07/2016 | 3.1 |
| 19/07/2016 | 2.7 |
| 20/07/2016 | 2.5 |
| 20/07/2016 | 2.4 |
| 20/07/2016 | 2.4 |
| 20/07/2016 | 2.5 |
| 20/07/2016 | 2.7 |
| 20/07/2016 | 3.2 |
| 20/07/2016 | 3.7 |
| 20/07/2016 | 4.2 |
| 20/07/2016 | 4.4 |
| 20/07/2016 | 4.6 |
| 20/07/2016 | 4.7 |
| 20/07/2016 | 4.8 |
| 20/07/2016 | 4.7 |
| 20/07/2016 | 4.6 |
| 20/07/2016 | 4.5 |
| 20/07/2016 | 4.4 |
| 20/07/2016 | 4.4 |
| 20/07/2016 | 4.4 |
| 20/07/2016 | 4.3 |
| 20/07/2016 | 4 |
| 20/07/2016 | 3.8 |
| 20/07/2016 | 3.5 |
| 20/07/2016 | 3.1 |
| 20/07/2016 | 2.8 |
| 21/07/2016 | 2.5 |
| 21/07/2016 | 2.4 |
| 21/07/2016 | 2.4 |
| 21/07/2016 | 2.5 |
| 21/07/2016 | 2.7 |
| 21/07/2016 | 3.2 |
| 21/07/2016 | 3.7 |
| 21/07/2016 | 4.2 |
| 21/07/2016 | 4.4 |
| 21/07/2016 | 4.6 |
| 21/07/2016 | 4.7 |
| 21/07/2016 | 4.8 |
| 21/07/2016 | 4.7 |
| 21/07/2016 | 4.6 |
| 21/07/2016 | 4.5 |
| 21/07/2016 | 4.5 |
| 21/07/2016 | 4.4 |
| 21/07/2016 | 4.4 |
| 21/07/2016 | 4.3 |
| 21/07/2016 | 4.1 |
| 21/07/2016 | 3.8 |
| 21/07/2016 | 3.5 |
| 21/07/2016 | 3.1 |
| 21/07/2016 | 2.8 |
| 22/07/2016 | 2.5 |
| 22/07/2016 | 2.4 |
| 22/07/2016 | 2.4 |
| 22/07/2016 | 2.5 |
| 22/07/2016 | 2.7 |
| 22/07/2016 | 3.2 |
| 22/07/2016 | 3.7 |
| 22/07/2016 | 4.2 |
| 22/07/2016 | 4.4 |
| 22/07/2016 | 4.6 |
| 22/07/2016 | 4.7 |
| 22/07/2016 | 4.7 |
| 22/07/2016 | 4.6 |
| 22/07/2016 | 4.5 |
| 22/07/2016 | 4.4 |
| 22/07/2016 | 4.3 |
| 22/07/2016 | 4.3 |
| 22/07/2016 | 4.2 |
| 22/07/2016 | 4.1 |
| 22/07/2016 | 3.9 |
| 22/07/2016 | 3.6 |
| 22/07/2016 | 3.4 |
| 22/07/2016 | 3 |
| 22/07/2016 | 2.7 |
| 23/07/2016 | 2.5 |
| 23/07/2016 | 2.4 |
| 23/07/2016 | 2.4 |
| 23/07/2016 | 2.3 |
| 23/07/2016 | 2.3 |
| 23/07/2016 | 2.4 |
| 23/07/2016 | 2.6 |
| 23/07/2016 | 3 |
| 23/07/2016 | 3.4 |
| 23/07/2016 | 3.7 |
| 23/07/2016 | 3.9 |
| 23/07/2016 | 3.9 |
| 23/07/2016 | 3.8 |
| 23/07/2016 | 3.6 |
| 23/07/2016 | 3.6 |
| 23/07/2016 | 3.5 |
| 23/07/2016 | 3.5 |
| 23/07/2016 | 3.5 |
| 23/07/2016 | 3.5 |
| 23/07/2016 | 3.4 |
| 23/07/2016 | 3.3 |
| 23/07/2016 | 3.1 |
| 23/07/2016 | 2.8 |
| 23/07/2016 | 2.6 |
| 24/07/2016 | 2.4 |
| 24/07/2016 | 2.3 |
| 24/07/2016 | 2.3 |
| 24/07/2016 | 2.2 |
| 24/07/2016 | 2.2 |
| 24/07/2016 | 2.2 |
| 24/07/2016 | 2.3 |
| 24/07/2016 | 2.6 |
| 24/07/2016 | 2.9 |
| 24/07/2016 | 3.1 |
| 24/07/2016 | 3.3 |
| 24/07/2016 | 3.4 |
| 24/07/2016 | 3.3 |
| 24/07/2016 | 3.2 |
| 24/07/2016 | 3.1 |
| 24/07/2016 | 3.1 |
| 24/07/2016 | 3.2 |
| 24/07/2016 | 3.3 |
| 24/07/2016 | 3.3 |
| 24/07/2016 | 3.2 |
| 24/07/2016 | 3.2 |
| 24/07/2016 | 3.1 |
| 24/07/2016 | 2.8 |
| 24/07/2016 | 2.6 |
| 25/07/2016 | 2.4 |
| 25/07/2016 | 2.3 |
| 25/07/2016 | 2.3 |
| 25/07/2016 | 2.4 |
| 25/07/2016 | 2.6 |
| 25/07/2016 | 3.1 |
| 25/07/2016 | 3.6 |
| 25/07/2016 | 4.1 |
| 25/07/2016 | 4.3 |
| 25/07/2016 | 4.6 |
| 25/07/2016 | 4.6 |
| 25/07/2016 | 4.7 |
| 25/07/2016 | 4.6 |
| 25/07/2016 | 4.6 |
| 25/07/2016 | 4.5 |
| 25/07/2016 | 4.4 |
| 25/07/2016 | 4.4 |
| 25/07/2016 | 4.4 |
| 25/07/2016 | 4.3 |
| 25/07/2016 | 4 |
| 25/07/2016 | 3.8 |
| 25/07/2016 | 3.5 |
| 25/07/2016 | 3 |
| 25/07/2016 | 2.7 |
| 26/07/2016 | 2.5 |
| 26/07/2016 | 2.4 |
| 26/07/2016 | 2.4 |
| 26/07/2016 | 2.5 |
| 26/07/2016 | 2.7 |
| 26/07/2016 | 3.2 |
| 26/07/2016 | 3.7 |
| 26/07/2016 | 4.1 |
| 26/07/2016 | 4.4 |
| 26/07/2016 | 4.6 |
| 26/07/2016 | 4.7 |
| 26/07/2016 | 4.7 |
| 26/07/2016 | 4.7 |
| 26/07/2016 | 4.6 |
| 26/07/2016 | 4.5 |
| 26/07/2016 | 4.4 |
| 26/07/2016 | 4.4 |
| 26/07/2016 | 4.4 |
| 26/07/2016 | 4.3 |
| 26/07/2016 | 4.1 |
| 26/07/2016 | 3.8 |
| 26/07/2016 | 3.5 |
| 26/07/2016 | 3 |
| 26/07/2016 | 2.7 |
| 27/07/2016 | 2.5 |
| 27/07/2016 | 2.4 |
| 27/07/2016 | 2.4 |
| 27/07/2016 | 2.5 |
| 27/07/2016 | 2.7 |
| 27/07/2016 | 3.2 |
| 27/07/2016 | 3.7 |
| 27/07/2016 | 4.2 |
| 27/07/2016 | 4.4 |
| 27/07/2016 | 4.6 |
| 27/07/2016 | 4.7 |
| 27/07/2016 | 4.8 |
| 27/07/2016 | 4.7 |
| 27/07/2016 | 4.6 |
| 27/07/2016 | 4.5 |
| 27/07/2016 | 4.4 |
| 27/07/2016 | 4.4 |
| 27/07/2016 | 4.4 |
| 27/07/2016 | 4.3 |
| 27/07/2016 | 4.1 |
| 27/07/2016 | 3.8 |
| 27/07/2016 | 3.5 |
| 27/07/2016 | 3.1 |
| 27/07/2016 | 2.8 |
| 28/07/2016 | 2.5 |
| 28/07/2016 | 2.4 |
| 28/07/2016 | 2.4 |
| 28/07/2016 | 2.5 |
| 28/07/2016 | 2.7 |
| 28/07/2016 | 3.2 |
| 28/07/2016 | 3.7 |
| 28/07/2016 | 4.2 |
| 28/07/2016 | 4.4 |
| 28/07/2016 | 4.6 |
| 28/07/2016 | 4.7 |
| 28/07/2016 | 4.8 |
| 28/07/2016 | 4.7 |
| 28/07/2016 | 4.6 |
| 28/07/2016 | 4.5 |
| 28/07/2016 | 4.5 |
| 28/07/2016 | 4.4 |
| 28/07/2016 | 4.4 |
| 28/07/2016 | 4.3 |
| 28/07/2016 | 4.1 |
| 28/07/2016 | 3.9 |
| 28/07/2016 | 3.5 |
| 28/07/2016 | 3.1 |
| 28/07/2016 | 2.8 |
| 29/07/2016 | 2.5 |
| 29/07/2016 | 2.4 |
| 29/07/2016 | 2.4 |
| 29/07/2016 | 2.5 |
| 29/07/2016 | 2.7 |
| 29/07/2016 | 3.2 |
| 29/07/2016 | 3.7 |
| 29/07/2016 | 4.1 |
| 29/07/2016 | 4.4 |
| 29/07/2016 | 4.6 |
| 29/07/2016 | 4.7 |
| 29/07/2016 | 4.7 |
| 29/07/2016 | 4.6 |
| 29/07/2016 | 4.5 |
| 29/07/2016 | 4.4 |
| 29/07/2016 | 4.3 |
| 29/07/2016 | 4.3 |
| 29/07/2016 | 4.2 |
| 29/07/2016 | 4.1 |
| 29/07/2016 | 3.9 |
| 29/07/2016 | 3.7 |
| 29/07/2016 | 3.4 |
| 29/07/2016 | 3 |
| 29/07/2016 | 2.7 |
| 30/07/2016 | 2.5 |
| 30/07/2016 | 2.4 |
| 30/07/2016 | 2.4 |
| 30/07/2016 | 2.4 |
| 30/07/2016 | 2.4 |
| 30/07/2016 | 2.4 |
| 30/07/2016 | 2.6 |
| 30/07/2016 | 3 |
| 30/07/2016 | 3.4 |
| 30/07/2016 | 3.7 |
| 30/07/2016 | 3.9 |
| 30/07/2016 | 3.9 |
| 30/07/2016 | 3.8 |
| 30/07/2016 | 3.6 |
| 30/07/2016 | 3.6 |
| 30/07/2016 | 3.5 |
| 30/07/2016 | 3.5 |
| 30/07/2016 | 3.5 |
| 30/07/2016 | 3.5 |
| 30/07/2016 | 3.4 |
| 30/07/2016 | 3.3 |
| 30/07/2016 | 3.1 |
| 30/07/2016 | 2.8 |
| 30/07/2016 | 2.6 |
| 31/07/2016 | 2.4 |
| 31/07/2016 | 2.3 |
| 31/07/2016 | 2.3 |
| 31/07/2016 | 2.3 |
| 31/07/2016 | 2.2 |
| 31/07/2016 | 2.2 |
| 31/07/2016 | 2.3 |
| 31/07/2016 | 2.6 |
| 31/07/2016 | 2.9 |
| 31/07/2016 | 3.1 |
| 31/07/2016 | 3.3 |
| 31/07/2016 | 3.4 |
| 31/07/2016 | 3.3 |
| 31/07/2016 | 3.2 |
| 31/07/2016 | 3.1 |
| 31/07/2016 | 3.1 |
| 31/07/2016 | 3.2 |
| 31/07/2016 | 3.3 |
| 31/07/2016 | 3.3 |
| 31/07/2016 | 3.3 |
| 31/07/2016 | 3.3 |
| 31/07/2016 | 3.1 |
| 31/07/2016 | 2.8 |
| 31/07/2016 | 2.6 |
| 01/08/2016 | 2.4 |
| 01/08/2016 | 2.3 |
| 01/08/2016 | 2.3 |
| 01/08/2016 | 2.4 |
| 01/08/2016 | 2.6 |
| 01/08/2016 | 3.1 |
| 01/08/2016 | 3.6 |
| 01/08/2016 | 4.1 |
| 01/08/2016 | 4.3 |
| 01/08/2016 | 4.6 |
| 01/08/2016 | 4.6 |
| 01/08/2016 | 4.7 |
| 01/08/2016 | 4.6 |
| 01/08/2016 | 4.6 |
| 01/08/2016 | 4.5 |
| 01/08/2016 | 4.4 |
| 01/08/2016 | 4.4 |
| 01/08/2016 | 4.4 |
| 01/08/2016 | 4.3 |
| 01/08/2016 | 4.1 |
| 01/08/2016 | 3.9 |
| 01/08/2016 | 3.5 |
| 01/08/2016 | 3 |
| 01/08/2016 | 2.7 |
| 02/08/2016 | 2.5 |
| 02/08/2016 | 2.4 |
| 02/08/2016 | 2.4 |
| 02/08/2016 | 2.5 |
| 02/08/2016 | 2.7 |
| 02/08/2016 | 3.2 |
| 02/08/2016 | 3.7 |
| 02/08/2016 | 4.1 |
| 02/08/2016 | 4.4 |
| 02/08/2016 | 4.6 |
| 02/08/2016 | 4.7 |
| 02/08/2016 | 4.7 |
| 02/08/2016 | 4.7 |
| 02/08/2016 | 4.6 |
| 02/08/2016 | 4.5 |
| 02/08/2016 | 4.4 |
| 02/08/2016 | 4.4 |
| 02/08/2016 | 4.4 |
| 02/08/2016 | 4.3 |
| 02/08/2016 | 4.1 |
| 02/08/2016 | 3.9 |
| 02/08/2016 | 3.5 |
| 02/08/2016 | 3 |
| 02/08/2016 | 2.7 |
| 03/08/2016 | 2.5 |
| 03/08/2016 | 2.4 |
| 03/08/2016 | 2.4 |
| 03/08/2016 | 2.5 |
| 03/08/2016 | 2.7 |
| 03/08/2016 | 3.2 |
| 03/08/2016 | 3.7 |
| 03/08/2016 | 4.1 |
| 03/08/2016 | 4.4 |
| 03/08/2016 | 4.6 |
| 03/08/2016 | 4.7 |
| 03/08/2016 | 4.8 |
| 03/08/2016 | 4.7 |
| 03/08/2016 | 4.6 |
| 03/08/2016 | 4.5 |
| 03/08/2016 | 4.4 |
| 03/08/2016 | 4.4 |
| 03/08/2016 | 4.4 |
| 03/08/2016 | 4.3 |
| 03/08/2016 | 4.1 |
| 03/08/2016 | 3.9 |
| 03/08/2016 | 3.5 |
| 03/08/2016 | 3.1 |
| 03/08/2016 | 2.7 |
| 04/08/2016 | 2.5 |
| 04/08/2016 | 2.4 |
| 04/08/2016 | 2.4 |
| 04/08/2016 | 2.5 |
| 04/08/2016 | 2.7 |
| 04/08/2016 | 3.2 |
| 04/08/2016 | 3.7 |
| 04/08/2016 | 4.1 |
| 04/08/2016 | 4.4 |
| 04/08/2016 | 4.6 |
| 04/08/2016 | 4.7 |
| 04/08/2016 | 4.8 |
| 04/08/2016 | 4.7 |
| 04/08/2016 | 4.6 |
| 04/08/2016 | 4.5 |
| 04/08/2016 | 4.5 |
| 04/08/2016 | 4.4 |
| 04/08/2016 | 4.4 |
| 04/08/2016 | 4.3 |
| 04/08/2016 | 4.1 |
| 04/08/2016 | 3.9 |
| 04/08/2016 | 3.5 |
| 04/08/2016 | 3.1 |
| 04/08/2016 | 2.8 |
| 05/08/2016 | 2.5 |
| 05/08/2016 | 2.4 |
| 05/08/2016 | 2.4 |
| 05/08/2016 | 2.5 |
| 05/08/2016 | 2.7 |
| 05/08/2016 | 3.1 |
| 05/08/2016 | 3.7 |
| 05/08/2016 | 4.1 |
| 05/08/2016 | 4.4 |
| 05/08/2016 | 4.6 |
| 05/08/2016 | 4.7 |
| 05/08/2016 | 4.7 |
| 05/08/2016 | 4.6 |
| 05/08/2016 | 4.5 |
| 05/08/2016 | 4.4 |
| 05/08/2016 | 4.3 |
| 05/08/2016 | 4.3 |
| 05/08/2016 | 4.2 |
| 05/08/2016 | 4.1 |
| 05/08/2016 | 3.9 |
| 05/08/2016 | 3.7 |
| 05/08/2016 | 3.4 |
| 05/08/2016 | 3 |
| 05/08/2016 | 2.7 |
| 06/08/2016 | 2.5 |
| 06/08/2016 | 2.4 |
| 06/08/2016 | 2.4 |
| 06/08/2016 | 2.4 |
| 06/08/2016 | 2.4 |
| 06/08/2016 | 2.4 |
| 06/08/2016 | 2.6 |
| 06/08/2016 | 3 |
| 06/08/2016 | 3.4 |
| 06/08/2016 | 3.7 |
| 06/08/2016 | 3.9 |
| 06/08/2016 | 3.9 |
| 06/08/2016 | 3.8 |
| 06/08/2016 | 3.6 |
| 06/08/2016 | 3.6 |
| 06/08/2016 | 3.5 |
| 06/08/2016 | 3.5 |
| 06/08/2016 | 3.5 |
| 06/08/2016 | 3.5 |
| 06/08/2016 | 3.4 |
| 06/08/2016 | 3.3 |
| 06/08/2016 | 3.1 |
| 06/08/2016 | 2.8 |
| 06/08/2016 | 2.6 |
| 07/08/2016 | 2.4 |
| 07/08/2016 | 2.3 |
| 07/08/2016 | 2.3 |
| 07/08/2016 | 2.3 |
| 07/08/2016 | 2.2 |
| 07/08/2016 | 2.2 |
| 07/08/2016 | 2.3 |
| 07/08/2016 | 2.5 |
| 07/08/2016 | 2.9 |
| 07/08/2016 | 3.1 |
| 07/08/2016 | 3.3 |
| 07/08/2016 | 3.4 |
| 07/08/2016 | 3.3 |
| 07/08/2016 | 3.2 |
| 07/08/2016 | 3.1 |
| 07/08/2016 | 3.1 |
| 07/08/2016 | 3.2 |
| 07/08/2016 | 3.3 |
| 07/08/2016 | 3.3 |
| 07/08/2016 | 3.3 |
| 07/08/2016 | 3.3 |
| 07/08/2016 | 3.1 |
| 07/08/2016 | 2.8 |
| 07/08/2016 | 2.6 |
| 08/08/2016 | 2.4 |
| 08/08/2016 | 2.3 |
| 08/08/2016 | 2.3 |
| 08/08/2016 | 2.4 |
| 08/08/2016 | 2.6 |
| 08/08/2016 | 3.1 |
| 08/08/2016 | 3.6 |
| 08/08/2016 | 4 |
| 08/08/2016 | 4.3 |
| 08/08/2016 | 4.5 |
| 08/08/2016 | 4.6 |
| 08/08/2016 | 4.7 |
| 08/08/2016 | 4.6 |
| 08/08/2016 | 4.6 |
| 08/08/2016 | 4.5 |
| 08/08/2016 | 4.4 |
| 08/08/2016 | 4.4 |
| 08/08/2016 | 4.4 |
| 08/08/2016 | 4.3 |
| 08/08/2016 | 4.1 |
| 08/08/2016 | 3.9 |
| 08/08/2016 | 3.4 |
| 08/08/2016 | 3 |
| 08/08/2016 | 2.7 |
| 09/08/2016 | 2.5 |
| 09/08/2016 | 2.4 |
| 09/08/2016 | 2.4 |
| 09/08/2016 | 2.5 |
| 09/08/2016 | 2.7 |
| 09/08/2016 | 3.2 |
| 09/08/2016 | 3.7 |
| 09/08/2016 | 4.1 |
| 09/08/2016 | 4.4 |
| 09/08/2016 | 4.6 |
| 09/08/2016 | 4.7 |
| 09/08/2016 | 4.7 |
| 09/08/2016 | 4.7 |
| 09/08/2016 | 4.6 |
| 09/08/2016 | 4.5 |
| 09/08/2016 | 4.4 |
| 09/08/2016 | 4.4 |
| 09/08/2016 | 4.4 |
| 09/08/2016 | 4.3 |
| 09/08/2016 | 4.1 |
| 09/08/2016 | 3.9 |
| 09/08/2016 | 3.5 |
| 09/08/2016 | 3 |
| 09/08/2016 | 2.7 |
| 10/08/2016 | 2.5 |
| 10/08/2016 | 2.4 |
| 10/08/2016 | 2.4 |
| 10/08/2016 | 2.5 |
| 10/08/2016 | 2.7 |
| 10/08/2016 | 3.2 |
| 10/08/2016 | 3.7 |
| 10/08/2016 | 4.1 |
| 10/08/2016 | 4.4 |
| 10/08/2016 | 4.6 |
| 10/08/2016 | 4.7 |
| 10/08/2016 | 4.8 |
| 10/08/2016 | 4.7 |
| 10/08/2016 | 4.6 |
| 10/08/2016 | 4.5 |
| 10/08/2016 | 4.4 |
| 10/08/2016 | 4.4 |
| 10/08/2016 | 4.4 |
| 10/08/2016 | 4.3 |
| 10/08/2016 | 4.1 |
| 10/08/2016 | 3.9 |
| 10/08/2016 | 3.5 |
| 10/08/2016 | 3 |
| 10/08/2016 | 2.7 |
| 11/08/2016 | 2.5 |
| 11/08/2016 | 2.4 |
| 11/08/2016 | 2.4 |
| 11/08/2016 | 2.5 |
| 11/08/2016 | 2.7 |
| 11/08/2016 | 3.2 |
| 11/08/2016 | 3.7 |
| 11/08/2016 | 4.1 |
| 11/08/2016 | 4.4 |
| 11/08/2016 | 4.6 |
| 11/08/2016 | 4.7 |
| 11/08/2016 | 4.8 |
| 11/08/2016 | 4.7 |
| 11/08/2016 | 4.6 |
| 11/08/2016 | 4.6 |
| 11/08/2016 | 4.5 |
| 11/08/2016 | 4.4 |
| 11/08/2016 | 4.4 |
| 11/08/2016 | 4.4 |
| 11/08/2016 | 4.2 |
| 11/08/2016 | 3.9 |
| 11/08/2016 | 3.5 |
| 11/08/2016 | 3.1 |
| 11/08/2016 | 2.8 |
| 12/08/2016 | 2.5 |
| 12/08/2016 | 2.4 |
| 12/08/2016 | 2.4 |
| 12/08/2016 | 2.5 |
| 12/08/2016 | 2.7 |
| 12/08/2016 | 3.2 |
| 12/08/2016 | 3.7 |
| 12/08/2016 | 4.1 |
| 12/08/2016 | 4.4 |
| 12/08/2016 | 4.6 |
| 12/08/2016 | 4.7 |
| 12/08/2016 | 4.7 |
| 12/08/2016 | 4.6 |
| 12/08/2016 | 4.5 |
| 12/08/2016 | 4.4 |
| 12/08/2016 | 4.3 |
| 12/08/2016 | 4.3 |
| 12/08/2016 | 4.2 |
| 12/08/2016 | 4.2 |
| 12/08/2016 | 4 |
| 12/08/2016 | 3.7 |
| 12/08/2016 | 3.3 |
| 12/08/2016 | 3 |
| 12/08/2016 | 2.7 |
| 13/08/2016 | 2.5 |
| 13/08/2016 | 2.4 |
| 13/08/2016 | 2.4 |
| 13/08/2016 | 2.4 |
| 13/08/2016 | 2.4 |
| 13/08/2016 | 2.4 |
| 13/08/2016 | 2.6 |
| 13/08/2016 | 3 |
| 13/08/2016 | 3.4 |
| 13/08/2016 | 3.7 |
| 13/08/2016 | 3.9 |
| 13/08/2016 | 3.9 |
| 13/08/2016 | 3.8 |
| 13/08/2016 | 3.6 |
| 13/08/2016 | 3.6 |
| 13/08/2016 | 3.5 |
| 13/08/2016 | 3.5 |
| 13/08/2016 | 3.5 |
| 13/08/2016 | 3.6 |
| 13/08/2016 | 3.5 |
| 13/08/2016 | 3.4 |
| 13/08/2016 | 3.1 |
| 13/08/2016 | 2.8 |
| 13/08/2016 | 2.6 |
| 14/08/2016 | 2.4 |
| 14/08/2016 | 2.3 |
| 14/08/2016 | 2.3 |
| 14/08/2016 | 2.3 |
| 14/08/2016 | 2.2 |
| 14/08/2016 | 2.2 |
| 14/08/2016 | 2.3 |
| 14/08/2016 | 2.6 |
| 14/08/2016 | 2.9 |
| 14/08/2016 | 3.1 |
| 14/08/2016 | 3.3 |
| 14/08/2016 | 3.4 |
| 14/08/2016 | 3.3 |
| 14/08/2016 | 3.2 |
| 14/08/2016 | 3.1 |
| 14/08/2016 | 3.1 |
| 14/08/2016 | 3.2 |
| 14/08/2016 | 3.3 |
| 14/08/2016 | 3.3 |
| 14/08/2016 | 3.3 |
| 14/08/2016 | 3.3 |
| 14/08/2016 | 3.1 |
| 14/08/2016 | 2.8 |
| 14/08/2016 | 2.6 |
| 15/08/2016 | 2.4 |
| 15/08/2016 | 2.3 |
| 15/08/2016 | 2.3 |
| 15/08/2016 | 2.4 |
| 15/08/2016 | 2.7 |
| 15/08/2016 | 3.1 |
| 15/08/2016 | 3.6 |
| 15/08/2016 | 4.1 |
| 15/08/2016 | 4.3 |
| 15/08/2016 | 4.6 |
| 15/08/2016 | 4.6 |
| 15/08/2016 | 4.7 |
| 15/08/2016 | 4.6 |
| 15/08/2016 | 4.6 |
| 15/08/2016 | 4.5 |
| 15/08/2016 | 4.4 |
| 15/08/2016 | 4.4 |
| 15/08/2016 | 4.4 |
| 15/08/2016 | 4.4 |
| 15/08/2016 | 4.2 |
| 15/08/2016 | 3.9 |
| 15/08/2016 | 3.4 |
| 15/08/2016 | 3 |
| 15/08/2016 | 2.7 |
| 16/08/2016 | 2.5 |
| 16/08/2016 | 2.4 |
| 16/08/2016 | 2.4 |
| 16/08/2016 | 2.5 |
| 16/08/2016 | 2.7 |
| 16/08/2016 | 3.2 |
| 16/08/2016 | 3.7 |
| 16/08/2016 | 4.1 |
| 16/08/2016 | 4.4 |
| 16/08/2016 | 4.6 |
| 16/08/2016 | 4.7 |
| 16/08/2016 | 4.8 |
| 16/08/2016 | 4.7 |
| 16/08/2016 | 4.6 |
| 16/08/2016 | 4.5 |
| 16/08/2016 | 4.4 |
| 16/08/2016 | 4.4 |
| 16/08/2016 | 4.4 |
| 16/08/2016 | 4.4 |
| 16/08/2016 | 4.2 |
| 16/08/2016 | 3.9 |
| 16/08/2016 | 3.5 |
| 16/08/2016 | 3 |
| 16/08/2016 | 2.7 |
| 17/08/2016 | 2.5 |
| 17/08/2016 | 2.4 |
| 17/08/2016 | 2.4 |
| 17/08/2016 | 2.5 |
| 17/08/2016 | 2.7 |
| 17/08/2016 | 3.2 |
| 17/08/2016 | 3.7 |
| 17/08/2016 | 4.2 |
| 17/08/2016 | 4.4 |
| 17/08/2016 | 4.6 |
| 17/08/2016 | 4.7 |
| 17/08/2016 | 4.8 |
| 17/08/2016 | 4.7 |
| 17/08/2016 | 4.6 |
| 17/08/2016 | 4.5 |
| 17/08/2016 | 4.4 |
| 17/08/2016 | 4.4 |
| 17/08/2016 | 4.4 |
| 17/08/2016 | 4.4 |
| 17/08/2016 | 4.2 |
| 17/08/2016 | 3.9 |
| 17/08/2016 | 3.5 |
| 17/08/2016 | 3 |
| 17/08/2016 | 2.7 |
| 18/08/2016 | 2.5 |
| 18/08/2016 | 2.4 |
| 18/08/2016 | 2.4 |
| 18/08/2016 | 2.5 |
| 18/08/2016 | 2.7 |
| 18/08/2016 | 3.2 |
| 18/08/2016 | 3.7 |
| 18/08/2016 | 4.2 |
| 18/08/2016 | 4.4 |
| 18/08/2016 | 4.7 |
| 18/08/2016 | 4.7 |
| 18/08/2016 | 4.8 |
| 18/08/2016 | 4.7 |
| 18/08/2016 | 4.6 |
| 18/08/2016 | 4.6 |
| 18/08/2016 | 4.5 |
| 18/08/2016 | 4.4 |
| 18/08/2016 | 4.4 |
| 18/08/2016 | 4.5 |
| 18/08/2016 | 4.2 |
| 18/08/2016 | 3.9 |
| 18/08/2016 | 3.5 |
| 18/08/2016 | 3 |
| 18/08/2016 | 2.7 |
| 19/08/2016 | 2.5 |
| 19/08/2016 | 2.4 |
| 19/08/2016 | 2.4 |
| 19/08/2016 | 2.5 |
| 19/08/2016 | 2.7 |
| 19/08/2016 | 3.2 |
| 19/08/2016 | 3.7 |
| 19/08/2016 | 4.2 |
| 19/08/2016 | 4.4 |
| 19/08/2016 | 4.6 |
| 19/08/2016 | 4.7 |
| 19/08/2016 | 4.7 |
| 19/08/2016 | 4.6 |
| 19/08/2016 | 4.5 |
| 19/08/2016 | 4.4 |
| 19/08/2016 | 4.3 |
| 19/08/2016 | 4.3 |
| 19/08/2016 | 4.2 |
| 19/08/2016 | 4.2 |
| 19/08/2016 | 4 |
| 19/08/2016 | 3.7 |
| 19/08/2016 | 3.3 |
| 19/08/2016 | 3 |
| 19/08/2016 | 2.7 |
| 20/08/2016 | 2.5 |
| 20/08/2016 | 2.4 |
| 20/08/2016 | 2.4 |
| 20/08/2016 | 2.4 |
| 20/08/2016 | 2.4 |
| 20/08/2016 | 2.4 |
| 20/08/2016 | 2.6 |
| 20/08/2016 | 3 |
| 20/08/2016 | 3.4 |
| 20/08/2016 | 3.7 |
| 20/08/2016 | 3.9 |
| 20/08/2016 | 3.9 |
| 20/08/2016 | 3.8 |
| 20/08/2016 | 3.6 |
| 20/08/2016 | 3.6 |
| 20/08/2016 | 3.5 |
| 20/08/2016 | 3.5 |
| 20/08/2016 | 3.5 |
| 20/08/2016 | 3.6 |
| 20/08/2016 | 3.6 |
| 20/08/2016 | 3.4 |
| 20/08/2016 | 3.1 |
| 20/08/2016 | 2.8 |
| 20/08/2016 | 2.5 |
| 21/08/2016 | 2.4 |
| 21/08/2016 | 2.3 |
| 21/08/2016 | 2.3 |
| 21/08/2016 | 2.3 |
| 21/08/2016 | 2.2 |
| 21/08/2016 | 2.2 |
| 21/08/2016 | 2.3 |
| 21/08/2016 | 2.6 |
| 21/08/2016 | 2.9 |
| 21/08/2016 | 3.1 |
| 21/08/2016 | 3.3 |
| 21/08/2016 | 3.4 |
| 21/08/2016 | 3.3 |
| 21/08/2016 | 3.2 |
| 21/08/2016 | 3.1 |
| 21/08/2016 | 3.1 |
| 21/08/2016 | 3.2 |
| 21/08/2016 | 3.3 |
| 21/08/2016 | 3.4 |
| 21/08/2016 | 3.4 |
| 21/08/2016 | 3.3 |
| 21/08/2016 | 3.1 |
| 21/08/2016 | 2.8 |
| 21/08/2016 | 2.6 |
| 22/08/2016 | 2.4 |
| 22/08/2016 | 2.3 |
| 22/08/2016 | 2.3 |
| 22/08/2016 | 2.4 |
| 22/08/2016 | 2.7 |
| 22/08/2016 | 3.1 |
| 22/08/2016 | 3.6 |
| 22/08/2016 | 4.1 |
| 22/08/2016 | 4.4 |
| 22/08/2016 | 4.6 |
| 22/08/2016 | 4.7 |
| 22/08/2016 | 4.7 |
| 22/08/2016 | 4.6 |
| 22/08/2016 | 4.6 |
| 22/08/2016 | 4.5 |
| 22/08/2016 | 4.4 |
| 22/08/2016 | 4.4 |
| 22/08/2016 | 4.4 |
| 22/08/2016 | 4.5 |
| 22/08/2016 | 4.2 |
| 22/08/2016 | 3.9 |
| 22/08/2016 | 3.4 |
| 22/08/2016 | 3 |
| 22/08/2016 | 2.7 |
| 23/08/2016 | 2.5 |
| 23/08/2016 | 2.4 |
| 23/08/2016 | 2.4 |
| 23/08/2016 | 2.5 |
| 23/08/2016 | 2.7 |
| 23/08/2016 | 3.2 |
| 23/08/2016 | 3.7 |
| 23/08/2016 | 4.2 |
| 23/08/2016 | 4.4 |
| 23/08/2016 | 4.6 |
| 23/08/2016 | 4.7 |
| 23/08/2016 | 4.8 |
| 23/08/2016 | 4.7 |
| 23/08/2016 | 4.6 |
| 23/08/2016 | 4.5 |
| 23/08/2016 | 4.4 |
| 23/08/2016 | 4.4 |
| 23/08/2016 | 4.4 |
| 23/08/2016 | 4.5 |
| 23/08/2016 | 4.3 |
| 23/08/2016 | 3.9 |
| 23/08/2016 | 3.4 |
| 23/08/2016 | 3 |
| 23/08/2016 | 2.7 |
| 24/08/2016 | 2.5 |
| 24/08/2016 | 2.4 |
| 24/08/2016 | 2.4 |
| 24/08/2016 | 2.5 |
| 24/08/2016 | 2.8 |
| 24/08/2016 | 3.2 |
| 24/08/2016 | 3.7 |
| 24/08/2016 | 4.2 |
| 24/08/2016 | 4.5 |
| 24/08/2016 | 4.6 |
| 24/08/2016 | 4.7 |
| 24/08/2016 | 4.8 |
| 24/08/2016 | 4.7 |
| 24/08/2016 | 4.6 |
| 24/08/2016 | 4.5 |
| 24/08/2016 | 4.4 |
| 24/08/2016 | 4.4 |
| 24/08/2016 | 4.4 |
| 24/08/2016 | 4.5 |
| 24/08/2016 | 4.3 |
| 24/08/2016 | 3.9 |
| 24/08/2016 | 3.5 |
| 24/08/2016 | 3 |
| 24/08/2016 | 2.7 |
| 25/08/2016 | 2.5 |
| 25/08/2016 | 2.4 |
| 25/08/2016 | 2.4 |
| 25/08/2016 | 2.5 |
| 25/08/2016 | 2.8 |
| 25/08/2016 | 3.2 |
| 25/08/2016 | 3.7 |
| 25/08/2016 | 4.2 |
| 25/08/2016 | 4.5 |
| 25/08/2016 | 4.7 |
| 25/08/2016 | 4.7 |
| 25/08/2016 | 4.8 |
| 25/08/2016 | 4.7 |
| 25/08/2016 | 4.6 |
| 25/08/2016 | 4.6 |
| 25/08/2016 | 4.5 |
| 25/08/2016 | 4.4 |
| 25/08/2016 | 4.4 |
| 25/08/2016 | 4.5 |
| 25/08/2016 | 4.3 |
| 25/08/2016 | 3.9 |
| 25/08/2016 | 3.5 |
| 25/08/2016 | 3 |
| 25/08/2016 | 2.7 |
| 26/08/2016 | 2.5 |
| 26/08/2016 | 2.4 |
| 26/08/2016 | 2.4 |
| 26/08/2016 | 2.5 |
| 26/08/2016 | 2.8 |
| 26/08/2016 | 3.2 |
| 26/08/2016 | 3.7 |
| 26/08/2016 | 4.2 |
| 26/08/2016 | 4.5 |
| 26/08/2016 | 4.7 |
| 26/08/2016 | 4.7 |
| 26/08/2016 | 4.7 |
| 26/08/2016 | 4.6 |
| 26/08/2016 | 4.5 |
| 26/08/2016 | 4.4 |
| 26/08/2016 | 4.3 |
| 26/08/2016 | 4.3 |
| 26/08/2016 | 4.2 |
| 26/08/2016 | 4.3 |
| 26/08/2016 | 4.1 |
| 26/08/2016 | 3.7 |
| 26/08/2016 | 3.3 |
| 26/08/2016 | 3 |
| 26/08/2016 | 2.7 |
| 27/08/2016 | 2.5 |
| 27/08/2016 | 2.4 |
| 27/08/2016 | 2.4 |
| 27/08/2016 | 2.3 |
| 27/08/2016 | 2.4 |
| 27/08/2016 | 2.4 |
| 27/08/2016 | 2.6 |
| 27/08/2016 | 3 |
| 27/08/2016 | 3.4 |
| 27/08/2016 | 3.7 |
| 27/08/2016 | 3.9 |
| 27/08/2016 | 3.9 |
| 27/08/2016 | 3.8 |
| 27/08/2016 | 3.6 |
| 27/08/2016 | 3.6 |
| 27/08/2016 | 3.5 |
| 27/08/2016 | 3.5 |
| 27/08/2016 | 3.5 |
| 27/08/2016 | 3.7 |
| 27/08/2016 | 3.6 |
| 27/08/2016 | 3.4 |
| 27/08/2016 | 3.1 |
| 27/08/2016 | 2.8 |
| 27/08/2016 | 2.5 |
| 28/08/2016 | 2.4 |
| 28/08/2016 | 2.3 |
| 28/08/2016 | 2.2 |
| 28/08/2016 | 2.2 |
| 28/08/2016 | 2.2 |
| 28/08/2016 | 2.2 |
| 28/08/2016 | 2.3 |
| 28/08/2016 | 2.6 |
| 28/08/2016 | 2.9 |
| 28/08/2016 | 3.1 |
| 28/08/2016 | 3.3 |
| 28/08/2016 | 3.4 |
| 28/08/2016 | 3.3 |
| 28/08/2016 | 3.2 |
| 28/08/2016 | 3.2 |
| 28/08/2016 | 3.1 |
| 28/08/2016 | 3.2 |
| 28/08/2016 | 3.3 |
| 28/08/2016 | 3.5 |
| 28/08/2016 | 3.5 |
| 28/08/2016 | 3.3 |
| 28/08/2016 | 3.1 |
| 28/08/2016 | 2.8 |
| 28/08/2016 | 2.5 |
| 29/08/2016 | 2.4 |
| 29/08/2016 | 2.3 |
| 29/08/2016 | 2.3 |
| 29/08/2016 | 2.4 |
| 29/08/2016 | 2.7 |
| 29/08/2016 | 3.2 |
| 29/08/2016 | 3.7 |
| 29/08/2016 | 4.1 |
| 29/08/2016 | 4.4 |
| 29/08/2016 | 4.6 |
| 29/08/2016 | 4.7 |
| 29/08/2016 | 4.7 |
| 29/08/2016 | 4.6 |
| 29/08/2016 | 4.6 |
| 29/08/2016 | 4.5 |
| 29/08/2016 | 4.4 |
| 29/08/2016 | 4.4 |
| 29/08/2016 | 4.4 |
| 29/08/2016 | 4.5 |
| 29/08/2016 | 4.3 |
| 29/08/2016 | 3.9 |
| 29/08/2016 | 3.4 |
| 29/08/2016 | 3 |
| 29/08/2016 | 2.7 |
| 30/08/2016 | 2.5 |
| 30/08/2016 | 2.4 |
| 30/08/2016 | 2.4 |
| 30/08/2016 | 2.5 |
| 30/08/2016 | 2.8 |
| 30/08/2016 | 3.3 |
| 30/08/2016 | 3.7 |
| 30/08/2016 | 4.2 |
| 30/08/2016 | 4.4 |
| 30/08/2016 | 4.6 |
| 30/08/2016 | 4.7 |
| 30/08/2016 | 4.8 |
| 30/08/2016 | 4.7 |
| 30/08/2016 | 4.6 |
| 30/08/2016 | 4.5 |
| 30/08/2016 | 4.4 |
| 30/08/2016 | 4.4 |
| 30/08/2016 | 4.4 |
| 30/08/2016 | 4.6 |
| 30/08/2016 | 4.4 |
| 30/08/2016 | 3.9 |
| 30/08/2016 | 3.4 |
| 30/08/2016 | 3 |
| 30/08/2016 | 2.7 |
| 31/08/2016 | 2.5 |
| 31/08/2016 | 2.4 |
| 31/08/2016 | 2.4 |
| 31/08/2016 | 2.5 |
| 31/08/2016 | 2.8 |
| 31/08/2016 | 3.3 |
| 31/08/2016 | 3.8 |
| 31/08/2016 | 4.2 |
| 31/08/2016 | 4.5 |
| 31/08/2016 | 4.7 |
| 31/08/2016 | 4.7 |
| 31/08/2016 | 4.8 |
| 31/08/2016 | 4.7 |
| 31/08/2016 | 4.6 |
| 31/08/2016 | 4.5 |
| 31/08/2016 | 4.4 |
| 31/08/2016 | 4.4 |
| 31/08/2016 | 4.4 |
| 31/08/2016 | 4.6 |
| 31/08/2016 | 4.4 |
| 31/08/2016 | 3.9 |
| 31/08/2016 | 3.4 |
| 31/08/2016 | 3 |
| 31/08/2016 | 2.7 |
| 01/09/2016 | 2.5 |
| 01/09/2016 | 2.4 |
| 01/09/2016 | 2.4 |
| 01/09/2016 | 2.5 |
| 01/09/2016 | 2.8 |
| 01/09/2016 | 3.3 |
| 01/09/2016 | 3.8 |
| 01/09/2016 | 4.2 |
| 01/09/2016 | 4.5 |
| 01/09/2016 | 4.7 |
| 01/09/2016 | 4.7 |
| 01/09/2016 | 4.8 |
| 01/09/2016 | 4.7 |
| 01/09/2016 | 4.6 |
| 01/09/2016 | 4.6 |
| 01/09/2016 | 4.5 |
| 01/09/2016 | 4.4 |
| 01/09/2016 | 4.4 |
| 01/09/2016 | 4.6 |
| 01/09/2016 | 4.4 |
| 01/09/2016 | 3.9 |
| 01/09/2016 | 3.4 |
| 01/09/2016 | 3 |
| 01/09/2016 | 2.7 |
| 02/09/2016 | 2.5 |
| 02/09/2016 | 2.4 |
| 02/09/2016 | 2.4 |
| 02/09/2016 | 2.5 |
| 02/09/2016 | 2.8 |
| 02/09/2016 | 3.3 |
| 02/09/2016 | 3.7 |
| 02/09/2016 | 4.2 |
| 02/09/2016 | 4.5 |
| 02/09/2016 | 4.7 |
| 02/09/2016 | 4.7 |
| 02/09/2016 | 4.7 |
| 02/09/2016 | 4.6 |
| 02/09/2016 | 4.5 |
| 02/09/2016 | 4.4 |
| 02/09/2016 | 4.3 |
| 02/09/2016 | 4.2 |
| 02/09/2016 | 4.2 |
| 02/09/2016 | 4.4 |
| 02/09/2016 | 4.2 |
| 02/09/2016 | 3.7 |
| 02/09/2016 | 3.3 |
| 02/09/2016 | 3 |
| 02/09/2016 | 2.7 |
| 03/09/2016 | 2.5 |
| 03/09/2016 | 2.4 |
| 03/09/2016 | 2.4 |
| 03/09/2016 | 2.4 |
| 03/09/2016 | 2.4 |
| 03/09/2016 | 2.6 |
| 03/09/2016 | 2.8 |
| 03/09/2016 | 3.2 |
| 03/09/2016 | 3.6 |
| 03/09/2016 | 3.8 |
| 03/09/2016 | 3.9 |
| 03/09/2016 | 3.9 |
| 03/09/2016 | 3.8 |
| 03/09/2016 | 3.7 |
| 03/09/2016 | 3.6 |
| 03/09/2016 | 3.6 |
| 03/09/2016 | 3.6 |
| 03/09/2016 | 3.7 |
| 03/09/2016 | 3.9 |
| 03/09/2016 | 3.8 |
| 03/09/2016 | 3.4 |
| 03/09/2016 | 3.1 |
| 03/09/2016 | 2.8 |
| 03/09/2016 | 2.5 |
| 04/09/2016 | 2.4 |
| 04/09/2016 | 2.3 |
| 04/09/2016 | 2.3 |
| 04/09/2016 | 2.3 |
| 04/09/2016 | 2.3 |
| 04/09/2016 | 2.3 |
| 04/09/2016 | 2.4 |
| 04/09/2016 | 2.7 |
| 04/09/2016 | 3 |
| 04/09/2016 | 3.2 |
| 04/09/2016 | 3.4 |
| 04/09/2016 | 3.5 |
| 04/09/2016 | 3.4 |
| 04/09/2016 | 3.3 |
| 04/09/2016 | 3.2 |
| 04/09/2016 | 3.2 |
| 04/09/2016 | 3.3 |
| 04/09/2016 | 3.4 |
| 04/09/2016 | 3.6 |
| 04/09/2016 | 3.6 |
| 04/09/2016 | 3.4 |
| 04/09/2016 | 3.1 |
| 04/09/2016 | 2.8 |
| 04/09/2016 | 2.5 |
| 05/09/2016 | 2.4 |
| 05/09/2016 | 2.3 |
| 05/09/2016 | 2.3 |
| 05/09/2016 | 2.4 |
| 05/09/2016 | 2.7 |
| 05/09/2016 | 3.3 |
| 05/09/2016 | 3.9 |
| 05/09/2016 | 4.3 |
| 05/09/2016 | 4.5 |
| 05/09/2016 | 4.7 |
| 05/09/2016 | 4.7 |
| 05/09/2016 | 4.8 |
| 05/09/2016 | 4.7 |
| 05/09/2016 | 4.7 |
| 05/09/2016 | 4.6 |
| 05/09/2016 | 4.5 |
| 05/09/2016 | 4.5 |
| 05/09/2016 | 4.5 |
| 05/09/2016 | 4.7 |
| 05/09/2016 | 4.5 |
| 05/09/2016 | 4 |
| 05/09/2016 | 3.4 |
| 05/09/2016 | 3 |
| 05/09/2016 | 2.7 |
| 06/09/2016 | 2.5 |
| 06/09/2016 | 2.4 |
| 06/09/2016 | 2.4 |
| 06/09/2016 | 2.5 |
| 06/09/2016 | 2.8 |
| 06/09/2016 | 3.4 |
| 06/09/2016 | 4 |
| 06/09/2016 | 4.4 |
| 06/09/2016 | 4.6 |
| 06/09/2016 | 4.7 |
| 06/09/2016 | 4.8 |
| 06/09/2016 | 4.8 |
| 06/09/2016 | 4.8 |
| 06/09/2016 | 4.7 |
| 06/09/2016 | 4.6 |
| 06/09/2016 | 4.5 |
| 06/09/2016 | 4.5 |
| 06/09/2016 | 4.6 |
| 06/09/2016 | 4.8 |
| 06/09/2016 | 4.6 |
| 06/09/2016 | 4 |
| 06/09/2016 | 3.5 |
| 06/09/2016 | 3 |
| 06/09/2016 | 2.7 |
| 07/09/2016 | 2.5 |
| 07/09/2016 | 2.4 |
| 07/09/2016 | 2.4 |
| 07/09/2016 | 2.5 |
| 07/09/2016 | 2.8 |
| 07/09/2016 | 3.4 |
| 07/09/2016 | 4 |
| 07/09/2016 | 4.4 |
| 07/09/2016 | 4.6 |
| 07/09/2016 | 4.8 |
| 07/09/2016 | 4.8 |
| 07/09/2016 | 4.9 |
| 07/09/2016 | 4.8 |
| 07/09/2016 | 4.7 |
| 07/09/2016 | 4.6 |
| 07/09/2016 | 4.6 |
| 07/09/2016 | 4.5 |
| 07/09/2016 | 4.6 |
| 07/09/2016 | 4.8 |
| 07/09/2016 | 4.6 |
| 07/09/2016 | 4 |
| 07/09/2016 | 3.5 |
| 07/09/2016 | 3 |
| 07/09/2016 | 2.7 |
| 08/09/2016 | 2.5 |
| 08/09/2016 | 2.4 |
| 08/09/2016 | 2.4 |
| 08/09/2016 | 2.5 |
| 08/09/2016 | 2.8 |
| 08/09/2016 | 3.4 |
| 08/09/2016 | 4 |
| 08/09/2016 | 4.4 |
| 08/09/2016 | 4.6 |
| 08/09/2016 | 4.8 |
| 08/09/2016 | 4.8 |
| 08/09/2016 | 4.9 |
| 08/09/2016 | 4.8 |
| 08/09/2016 | 4.7 |
| 08/09/2016 | 4.7 |
| 08/09/2016 | 4.6 |
| 08/09/2016 | 4.5 |
| 08/09/2016 | 4.6 |
| 08/09/2016 | 4.8 |
| 08/09/2016 | 4.6 |
| 08/09/2016 | 4 |
| 08/09/2016 | 3.5 |
| 08/09/2016 | 3 |
| 08/09/2016 | 2.7 |
| 09/09/2016 | 2.5 |
| 09/09/2016 | 2.4 |
| 09/09/2016 | 2.4 |
| 09/09/2016 | 2.5 |
| 09/09/2016 | 2.8 |
| 09/09/2016 | 3.4 |
| 09/09/2016 | 4 |
| 09/09/2016 | 4.4 |
| 09/09/2016 | 4.6 |
| 09/09/2016 | 4.8 |
| 09/09/2016 | 4.8 |
| 09/09/2016 | 4.8 |
| 09/09/2016 | 4.7 |
| 09/09/2016 | 4.6 |
| 09/09/2016 | 4.5 |
| 09/09/2016 | 4.4 |
| 09/09/2016 | 4.4 |
| 09/09/2016 | 4.4 |
| 09/09/2016 | 4.6 |
| 09/09/2016 | 4.4 |
| 09/09/2016 | 3.8 |
| 09/09/2016 | 3.3 |
| 09/09/2016 | 3 |
| 09/09/2016 | 2.7 |
| 10/09/2016 | 2.5 |
| 10/09/2016 | 2.4 |
| 10/09/2016 | 2.4 |
| 10/09/2016 | 2.4 |
| 10/09/2016 | 2.4 |
| 10/09/2016 | 2.6 |
| 10/09/2016 | 2.8 |
| 10/09/2016 | 3.2 |
| 10/09/2016 | 3.6 |
| 10/09/2016 | 3.8 |
| 10/09/2016 | 3.9 |
| 10/09/2016 | 3.9 |
| 10/09/2016 | 3.8 |
| 10/09/2016 | 3.7 |
| 10/09/2016 | 3.6 |
| 10/09/2016 | 3.6 |
| 10/09/2016 | 3.6 |
| 10/09/2016 | 3.7 |
| 10/09/2016 | 3.9 |
| 10/09/2016 | 3.9 |
| 10/09/2016 | 3.4 |
| 10/09/2016 | 3.1 |
| 10/09/2016 | 2.8 |
| 10/09/2016 | 2.5 |
| 11/09/2016 | 2.4 |
| 11/09/2016 | 2.3 |
| 11/09/2016 | 2.2 |
| 11/09/2016 | 2.3 |
| 11/09/2016 | 2.3 |
| 11/09/2016 | 2.3 |
| 11/09/2016 | 2.4 |
| 11/09/2016 | 2.7 |
| 11/09/2016 | 3 |
| 11/09/2016 | 3.2 |
| 11/09/2016 | 3.4 |
| 11/09/2016 | 3.5 |
| 11/09/2016 | 3.4 |
| 11/09/2016 | 3.3 |
| 11/09/2016 | 3.2 |
| 11/09/2016 | 3.2 |
| 11/09/2016 | 3.3 |
| 11/09/2016 | 3.4 |
| 11/09/2016 | 3.7 |
| 11/09/2016 | 3.7 |
| 11/09/2016 | 3.4 |
| 11/09/2016 | 3.1 |
| 11/09/2016 | 2.8 |
| 11/09/2016 | 2.5 |
| 12/09/2016 | 2.4 |
| 12/09/2016 | 2.3 |
| 12/09/2016 | 2.3 |
| 12/09/2016 | 2.4 |
| 12/09/2016 | 2.7 |
| 12/09/2016 | 3.4 |
| 12/09/2016 | 3.9 |
| 12/09/2016 | 4.3 |
| 12/09/2016 | 4.5 |
| 12/09/2016 | 4.7 |
| 12/09/2016 | 4.7 |
| 12/09/2016 | 4.8 |
| 12/09/2016 | 4.7 |
| 12/09/2016 | 4.7 |
| 12/09/2016 | 4.6 |
| 12/09/2016 | 4.5 |
| 12/09/2016 | 4.5 |
| 12/09/2016 | 4.5 |
| 12/09/2016 | 4.8 |
| 12/09/2016 | 4.6 |
| 12/09/2016 | 4 |
| 12/09/2016 | 3.4 |
| 12/09/2016 | 3 |
| 12/09/2016 | 2.7 |
| 13/09/2016 | 2.5 |
| 13/09/2016 | 2.4 |
| 13/09/2016 | 2.4 |
| 13/09/2016 | 2.5 |
| 13/09/2016 | 2.8 |
| 13/09/2016 | 3.5 |
| 13/09/2016 | 4 |
| 13/09/2016 | 4.4 |
| 13/09/2016 | 4.6 |
| 13/09/2016 | 4.8 |
| 13/09/2016 | 4.8 |
| 13/09/2016 | 4.8 |
| 13/09/2016 | 4.8 |
| 13/09/2016 | 4.7 |
| 13/09/2016 | 4.6 |
| 13/09/2016 | 4.5 |
| 13/09/2016 | 4.5 |
| 13/09/2016 | 4.6 |
| 13/09/2016 | 4.9 |
| 13/09/2016 | 4.6 |
| 13/09/2016 | 4 |
| 13/09/2016 | 3.4 |
| 13/09/2016 | 3 |
| 13/09/2016 | 2.7 |
| 14/09/2016 | 2.5 |
| 14/09/2016 | 2.4 |
| 14/09/2016 | 2.4 |
| 14/09/2016 | 2.5 |
| 14/09/2016 | 2.8 |
| 14/09/2016 | 3.5 |
| 14/09/2016 | 4 |
| 14/09/2016 | 4.4 |
| 14/09/2016 | 4.6 |
| 14/09/2016 | 4.8 |
| 14/09/2016 | 4.8 |
| 14/09/2016 | 4.9 |
| 14/09/2016 | 4.8 |
| 14/09/2016 | 4.7 |
| 14/09/2016 | 4.6 |
| 14/09/2016 | 4.6 |
| 14/09/2016 | 4.6 |
| 14/09/2016 | 4.6 |
| 14/09/2016 | 4.9 |
| 14/09/2016 | 4.6 |
| 14/09/2016 | 4 |
| 14/09/2016 | 3.5 |
| 14/09/2016 | 3 |
| 14/09/2016 | 2.7 |
| 15/09/2016 | 2.5 |
| 15/09/2016 | 2.4 |
| 15/09/2016 | 2.4 |
| 15/09/2016 | 2.5 |
| 15/09/2016 | 2.8 |
| 15/09/2016 | 3.5 |
| 15/09/2016 | 4 |
| 15/09/2016 | 4.4 |
| 15/09/2016 | 4.6 |
| 15/09/2016 | 4.8 |
| 15/09/2016 | 4.8 |
| 15/09/2016 | 4.9 |
| 15/09/2016 | 4.8 |
| 15/09/2016 | 4.7 |
| 15/09/2016 | 4.7 |
| 15/09/2016 | 4.6 |
| 15/09/2016 | 4.6 |
| 15/09/2016 | 4.6 |
| 15/09/2016 | 4.9 |
| 15/09/2016 | 4.7 |
| 15/09/2016 | 4 |
| 15/09/2016 | 3.5 |
| 15/09/2016 | 3 |
| 15/09/2016 | 2.7 |
| 16/09/2016 | 2.5 |
| 16/09/2016 | 2.4 |
| 16/09/2016 | 2.4 |
| 16/09/2016 | 2.5 |
| 16/09/2016 | 2.8 |
| 16/09/2016 | 3.5 |
| 16/09/2016 | 4 |
| 16/09/2016 | 4.4 |
| 16/09/2016 | 4.6 |
| 16/09/2016 | 4.8 |
| 16/09/2016 | 4.8 |
| 16/09/2016 | 4.8 |
| 16/09/2016 | 4.7 |
| 16/09/2016 | 4.6 |
| 16/09/2016 | 4.5 |
| 16/09/2016 | 4.4 |
| 16/09/2016 | 4.4 |
| 16/09/2016 | 4.5 |
| 16/09/2016 | 4.7 |
| 16/09/2016 | 4.4 |
| 16/09/2016 | 3.8 |
| 16/09/2016 | 3.3 |
| 16/09/2016 | 3 |
| 16/09/2016 | 2.7 |
| 17/09/2016 | 2.5 |
| 17/09/2016 | 2.4 |
| 17/09/2016 | 2.4 |
| 17/09/2016 | 2.4 |
| 17/09/2016 | 2.5 |
| 17/09/2016 | 2.6 |
| 17/09/2016 | 2.8 |
| 17/09/2016 | 3.2 |
| 17/09/2016 | 3.6 |
| 17/09/2016 | 3.9 |
| 17/09/2016 | 4 |
| 17/09/2016 | 4 |
| 17/09/2016 | 3.8 |
| 17/09/2016 | 3.7 |
| 17/09/2016 | 3.7 |
| 17/09/2016 | 3.6 |
| 17/09/2016 | 3.6 |
| 17/09/2016 | 3.8 |
| 17/09/2016 | 4 |
| 17/09/2016 | 3.9 |
| 17/09/2016 | 3.4 |
| 17/09/2016 | 3.1 |
| 17/09/2016 | 2.8 |
| 17/09/2016 | 2.5 |
| 18/09/2016 | 2.4 |
| 18/09/2016 | 2.3 |
| 18/09/2016 | 2.3 |
| 18/09/2016 | 2.3 |
| 18/09/2016 | 2.3 |
| 18/09/2016 | 2.4 |
| 18/09/2016 | 2.5 |
| 18/09/2016 | 2.7 |
| 18/09/2016 | 3 |
| 18/09/2016 | 3.2 |
| 18/09/2016 | 3.4 |
| 18/09/2016 | 3.5 |
| 18/09/2016 | 3.4 |
| 18/09/2016 | 3.3 |
| 18/09/2016 | 3.2 |
| 18/09/2016 | 3.2 |
| 18/09/2016 | 3.3 |
| 18/09/2016 | 3.5 |
| 18/09/2016 | 3.8 |
| 18/09/2016 | 3.7 |
| 18/09/2016 | 3.4 |
| 18/09/2016 | 3.1 |
| 18/09/2016 | 2.8 |
| 18/09/2016 | 2.6 |
| 19/09/2016 | 2.4 |
| 19/09/2016 | 2.3 |
| 19/09/2016 | 2.3 |
| 19/09/2016 | 2.4 |
| 19/09/2016 | 2.8 |
| 19/09/2016 | 3.4 |
| 19/09/2016 | 4 |
| 19/09/2016 | 4.4 |
| 19/09/2016 | 4.6 |
| 19/09/2016 | 4.7 |
| 19/09/2016 | 4.8 |
| 19/09/2016 | 4.8 |
| 19/09/2016 | 4.7 |
| 19/09/2016 | 4.7 |
| 19/09/2016 | 4.6 |
| 19/09/2016 | 4.5 |
| 19/09/2016 | 4.6 |
| 19/09/2016 | 4.7 |
| 19/09/2016 | 4.9 |
| 19/09/2016 | 4.6 |
| 19/09/2016 | 4 |
| 19/09/2016 | 3.4 |
| 19/09/2016 | 3 |
| 19/09/2016 | 2.7 |
| 20/09/2016 | 2.5 |
| 20/09/2016 | 2.4 |
| 20/09/2016 | 2.4 |
| 20/09/2016 | 2.5 |
| 20/09/2016 | 2.8 |
| 20/09/2016 | 3.5 |
| 20/09/2016 | 4 |
| 20/09/2016 | 4.4 |
| 20/09/2016 | 4.6 |
| 20/09/2016 | 4.8 |
| 20/09/2016 | 4.8 |
| 20/09/2016 | 4.9 |
| 20/09/2016 | 4.8 |
| 20/09/2016 | 4.7 |
| 20/09/2016 | 4.6 |
| 20/09/2016 | 4.6 |
| 20/09/2016 | 4.6 |
| 20/09/2016 | 4.7 |
| 20/09/2016 | 5 |
| 20/09/2016 | 4.7 |
| 20/09/2016 | 4 |
| 20/09/2016 | 3.5 |
| 20/09/2016 | 3 |
| 20/09/2016 | 2.7 |
| 21/09/2016 | 2.5 |
| 21/09/2016 | 2.4 |
| 21/09/2016 | 2.4 |
| 21/09/2016 | 2.5 |
| 21/09/2016 | 2.9 |
| 21/09/2016 | 3.5 |
| 21/09/2016 | 4.1 |
| 21/09/2016 | 4.5 |
| 21/09/2016 | 4.7 |
| 21/09/2016 | 4.8 |
| 21/09/2016 | 4.9 |
| 21/09/2016 | 4.9 |
| 21/09/2016 | 4.8 |
| 21/09/2016 | 4.7 |
| 21/09/2016 | 4.7 |
| 21/09/2016 | 4.6 |
| 21/09/2016 | 4.6 |
| 21/09/2016 | 4.8 |
| 21/09/2016 | 5 |
| 21/09/2016 | 4.7 |
| 21/09/2016 | 4 |
| 21/09/2016 | 3.5 |
| 21/09/2016 | 3 |
| 21/09/2016 | 2.7 |
| 22/09/2016 | 2.5 |
| 22/09/2016 | 2.4 |
| 22/09/2016 | 2.4 |
| 22/09/2016 | 2.5 |
| 22/09/2016 | 2.9 |
| 22/09/2016 | 3.5 |
| 22/09/2016 | 4.1 |
| 22/09/2016 | 4.5 |
| 22/09/2016 | 4.7 |
| 22/09/2016 | 4.8 |
| 22/09/2016 | 4.9 |
| 22/09/2016 | 4.9 |
| 22/09/2016 | 4.8 |
| 22/09/2016 | 4.8 |
| 22/09/2016 | 4.7 |
| 22/09/2016 | 4.6 |
| 22/09/2016 | 4.6 |
| 22/09/2016 | 4.8 |
| 22/09/2016 | 5 |
| 22/09/2016 | 4.7 |
| 22/09/2016 | 4 |
| 22/09/2016 | 3.5 |
| 22/09/2016 | 3.1 |
| 22/09/2016 | 2.7 |
| 23/09/2016 | 2.5 |
| 23/09/2016 | 2.4 |
| 23/09/2016 | 2.4 |
| 23/09/2016 | 2.5 |
| 23/09/2016 | 2.8 |
| 23/09/2016 | 3.5 |
| 23/09/2016 | 4.1 |
| 23/09/2016 | 4.5 |
| 23/09/2016 | 4.7 |
| 23/09/2016 | 4.8 |
| 23/09/2016 | 4.9 |
| 23/09/2016 | 4.9 |
| 23/09/2016 | 4.7 |
| 23/09/2016 | 4.6 |
| 23/09/2016 | 4.5 |
| 23/09/2016 | 4.5 |
| 23/09/2016 | 4.5 |
| 23/09/2016 | 4.6 |
| 23/09/2016 | 4.8 |
| 23/09/2016 | 4.5 |
| 23/09/2016 | 3.8 |
| 23/09/2016 | 3.4 |
| 23/09/2016 | 3 |
| 23/09/2016 | 2.7 |
| 24/09/2016 | 2.5 |
| 24/09/2016 | 2.4 |
| 24/09/2016 | 2.4 |
| 24/09/2016 | 2.4 |
| 24/09/2016 | 2.5 |
| 24/09/2016 | 2.6 |
| 24/09/2016 | 2.9 |
| 24/09/2016 | 3.3 |
| 24/09/2016 | 3.6 |
| 24/09/2016 | 3.9 |
| 24/09/2016 | 4 |
| 24/09/2016 | 4 |
| 24/09/2016 | 3.9 |
| 24/09/2016 | 3.7 |
| 24/09/2016 | 3.7 |
| 24/09/2016 | 3.6 |
| 24/09/2016 | 3.7 |
| 24/09/2016 | 3.9 |
| 24/09/2016 | 4.1 |
| 24/09/2016 | 3.9 |
| 24/09/2016 | 3.5 |
| 24/09/2016 | 3.1 |
| 24/09/2016 | 2.8 |
| 24/09/2016 | 2.6 |
| 25/09/2016 | 2.4 |
| 25/09/2016 | 2.3 |
| 25/09/2016 | 2.3 |
| 25/09/2016 | 2.3 |
| 25/09/2016 | 2.3 |
| 25/09/2016 | 2.4 |
| 25/09/2016 | 2.5 |
| 25/09/2016 | 2.8 |
| 25/09/2016 | 3.1 |
| 25/09/2016 | 3.3 |
| 25/09/2016 | 3.4 |
| 25/09/2016 | 3.5 |
| 25/09/2016 | 3.4 |
| 25/09/2016 | 3.3 |
| 25/09/2016 | 3.2 |
| 25/09/2016 | 3.2 |
| 25/09/2016 | 3.4 |
| 25/09/2016 | 3.6 |
| 25/09/2016 | 3.9 |
| 25/09/2016 | 3.8 |
| 25/09/2016 | 3.4 |
| 25/09/2016 | 3.1 |
| 25/09/2016 | 2.8 |
| 25/09/2016 | 2.6 |
| 26/09/2016 | 2.4 |
| 26/09/2016 | 2.3 |
| 26/09/2016 | 2.3 |
| 26/09/2016 | 2.4 |
| 26/09/2016 | 2.8 |
| 26/09/2016 | 3.5 |
| 26/09/2016 | 4 |
| 26/09/2016 | 4.4 |
| 26/09/2016 | 4.6 |
| 26/09/2016 | 4.8 |
| 26/09/2016 | 4.8 |
| 26/09/2016 | 4.8 |
| 26/09/2016 | 4.8 |
| 26/09/2016 | 4.7 |
| 26/09/2016 | 4.6 |
| 26/09/2016 | 4.6 |
| 26/09/2016 | 4.6 |
| 26/09/2016 | 4.8 |
| 26/09/2016 | 5 |
| 26/09/2016 | 4.7 |
| 26/09/2016 | 4 |
| 26/09/2016 | 3.5 |
| 26/09/2016 | 3 |
| 26/09/2016 | 2.7 |
| 27/09/2016 | 2.5 |
| 27/09/2016 | 2.4 |
| 27/09/2016 | 2.4 |
| 27/09/2016 | 2.5 |
| 27/09/2016 | 2.9 |
| 27/09/2016 | 3.5 |
| 27/09/2016 | 4.1 |
| 27/09/2016 | 4.5 |
| 27/09/2016 | 4.7 |
| 27/09/2016 | 4.8 |
| 27/09/2016 | 4.9 |
| 27/09/2016 | 4.9 |
| 27/09/2016 | 4.8 |
| 27/09/2016 | 4.7 |
| 27/09/2016 | 4.6 |
| 27/09/2016 | 4.6 |
| 27/09/2016 | 4.7 |
| 27/09/2016 | 4.9 |
| 27/09/2016 | 5.1 |
| 27/09/2016 | 4.7 |
| 27/09/2016 | 4 |
| 27/09/2016 | 3.5 |
| 27/09/2016 | 3.1 |
| 27/09/2016 | 2.7 |
| 28/09/2016 | 2.5 |
| 28/09/2016 | 2.4 |
| 28/09/2016 | 2.4 |
| 28/09/2016 | 2.5 |
| 28/09/2016 | 2.9 |
| 28/09/2016 | 3.5 |
| 28/09/2016 | 4.1 |
| 28/09/2016 | 4.5 |
| 28/09/2016 | 4.7 |
| 28/09/2016 | 4.9 |
| 28/09/2016 | 4.9 |
| 28/09/2016 | 4.9 |
| 28/09/2016 | 4.8 |
| 28/09/2016 | 4.7 |
| 28/09/2016 | 4.7 |
| 28/09/2016 | 4.6 |
| 28/09/2016 | 4.7 |
| 28/09/2016 | 4.9 |
| 28/09/2016 | 5.1 |
| 28/09/2016 | 4.7 |
| 28/09/2016 | 4 |
| 28/09/2016 | 3.5 |
| 28/09/2016 | 3.1 |
| 28/09/2016 | 2.8 |
| 29/09/2016 | 2.5 |
| 29/09/2016 | 2.4 |
| 29/09/2016 | 2.4 |
| 29/09/2016 | 2.6 |
| 29/09/2016 | 2.9 |
| 29/09/2016 | 3.5 |
| 29/09/2016 | 4.1 |
| 29/09/2016 | 4.5 |
| 29/09/2016 | 4.7 |
| 29/09/2016 | 4.9 |
| 29/09/2016 | 4.9 |
| 29/09/2016 | 4.9 |
| 29/09/2016 | 4.9 |
| 29/09/2016 | 4.8 |
| 29/09/2016 | 4.7 |
| 29/09/2016 | 4.6 |
| 29/09/2016 | 4.7 |
| 29/09/2016 | 5 |
| 29/09/2016 | 5.1 |
| 29/09/2016 | 4.7 |
| 29/09/2016 | 4.1 |
| 29/09/2016 | 3.5 |
| 29/09/2016 | 3.1 |
| 29/09/2016 | 2.8 |
| 30/09/2016 | 2.6 |
| 30/09/2016 | 2.4 |
| 30/09/2016 | 2.4 |
| 30/09/2016 | 2.6 |
| 30/09/2016 | 2.9 |
| 30/09/2016 | 3.5 |
| 30/09/2016 | 4.1 |
| 30/09/2016 | 4.5 |
| 30/09/2016 | 4.7 |
| 30/09/2016 | 4.9 |
| 30/09/2016 | 4.9 |
| 30/09/2016 | 4.9 |
| 30/09/2016 | 4.8 |
| 30/09/2016 | 4.6 |
| 30/09/2016 | 4.5 |
| 30/09/2016 | 4.5 |
| 30/09/2016 | 4.6 |
| 30/09/2016 | 4.8 |
| 30/09/2016 | 4.9 |
| 30/09/2016 | 4.5 |
| 30/09/2016 | 3.9 |
| 30/09/2016 | 3.4 |
| 30/09/2016 | 3 |
| 30/09/2016 | 2.7 |
| 01/10/2016 | 2.5 |
| 01/10/2016 | 2.4 |
| 01/10/2016 | 2.4 |
| 01/10/2016 | 2.4 |
| 01/10/2016 | 2.5 |
| 01/10/2016 | 2.7 |
| 01/10/2016 | 2.9 |
| 01/10/2016 | 3.3 |
| 01/10/2016 | 3.7 |
| 01/10/2016 | 3.9 |
| 01/10/2016 | 4 |
| 01/10/2016 | 4 |
| 01/10/2016 | 3.9 |
| 01/10/2016 | 3.7 |
| 01/10/2016 | 3.7 |
| 01/10/2016 | 3.6 |
| 01/10/2016 | 3.8 |
| 01/10/2016 | 4 |
| 01/10/2016 | 4.2 |
| 01/10/2016 | 4 |
| 01/10/2016 | 3.5 |
| 01/10/2016 | 3.1 |
| 01/10/2016 | 2.8 |
| 01/10/2016 | 2.6 |
| 02/10/2016 | 2.4 |
| 02/10/2016 | 2.3 |
| 02/10/2016 | 2.3 |
| 02/10/2016 | 2.3 |
| 02/10/2016 | 2.3 |
| 02/10/2016 | 2.4 |
| 02/10/2016 | 2.6 |
| 02/10/2016 | 2.8 |
| 02/10/2016 | 3.1 |
| 02/10/2016 | 3.3 |
| 02/10/2016 | 3.4 |
| 02/10/2016 | 3.5 |
| 02/10/2016 | 3.4 |
| 02/10/2016 | 3.3 |
| 02/10/2016 | 3.3 |
| 02/10/2016 | 3.3 |
| 02/10/2016 | 3.4 |
| 02/10/2016 | 3.8 |
| 02/10/2016 | 4 |
| 02/10/2016 | 3.8 |
| 02/10/2016 | 3.4 |
| 02/10/2016 | 3.2 |
| 02/10/2016 | 2.9 |
| 02/10/2016 | 2.6 |
| 03/10/2016 | 2.5 |
| 03/10/2016 | 2.4 |
| 03/10/2016 | 2.3 |
| 03/10/2016 | 2.3 |
| 03/10/2016 | 2.4 |
| 03/10/2016 | 2.5 |
| 03/10/2016 | 2.7 |
| 03/10/2016 | 3 |
| 03/10/2016 | 3.3 |
| 03/10/2016 | 3.4 |
| 03/10/2016 | 3.5 |
| 03/10/2016 | 3.5 |
| 03/10/2016 | 3.4 |
| 03/10/2016 | 3.3 |
| 03/10/2016 | 3.2 |
| 03/10/2016 | 3.2 |
| 03/10/2016 | 3.4 |
| 03/10/2016 | 3.7 |
| 03/10/2016 | 3.9 |
| 03/10/2016 | 3.7 |
| 03/10/2016 | 3.3 |
| 03/10/2016 | 3.1 |
| 03/10/2016 | 2.8 |
| 03/10/2016 | 2.7 |
| 04/10/2016 | 2.5 |
| 04/10/2016 | 2.4 |
| 04/10/2016 | 2.4 |
| 04/10/2016 | 2.6 |
| 04/10/2016 | 2.9 |
| 04/10/2016 | 3.6 |
| 04/10/2016 | 4.2 |
| 04/10/2016 | 4.5 |
| 04/10/2016 | 4.7 |
| 04/10/2016 | 4.9 |
| 04/10/2016 | 4.9 |
| 04/10/2016 | 4.9 |
| 04/10/2016 | 4.8 |
| 04/10/2016 | 4.7 |
| 04/10/2016 | 4.7 |
| 04/10/2016 | 4.6 |
| 04/10/2016 | 4.8 |
| 04/10/2016 | 5.1 |
| 04/10/2016 | 5.2 |
| 04/10/2016 | 4.7 |
| 04/10/2016 | 4.1 |
| 04/10/2016 | 3.5 |
| 04/10/2016 | 3.1 |
| 04/10/2016 | 2.8 |
| 05/10/2016 | 2.6 |
| 05/10/2016 | 2.5 |
| 05/10/2016 | 2.4 |
| 05/10/2016 | 2.6 |
| 05/10/2016 | 2.9 |
| 05/10/2016 | 3.6 |
| 05/10/2016 | 4.2 |
| 05/10/2016 | 4.6 |
| 05/10/2016 | 4.8 |
| 05/10/2016 | 4.9 |
| 05/10/2016 | 4.9 |
| 05/10/2016 | 4.9 |
| 05/10/2016 | 4.8 |
| 05/10/2016 | 4.7 |
| 05/10/2016 | 4.7 |
| 05/10/2016 | 4.6 |
| 05/10/2016 | 4.8 |
| 05/10/2016 | 5.1 |
| 05/10/2016 | 5.2 |
| 05/10/2016 | 4.7 |
| 05/10/2016 | 4.1 |
| 05/10/2016 | 3.5 |
| 05/10/2016 | 3.1 |
| 05/10/2016 | 2.8 |
| 06/10/2016 | 2.6 |
| 06/10/2016 | 2.5 |
| 06/10/2016 | 2.4 |
| 06/10/2016 | 2.6 |
| 06/10/2016 | 2.9 |
| 06/10/2016 | 3.6 |
| 06/10/2016 | 4.2 |
| 06/10/2016 | 4.6 |
| 06/10/2016 | 4.8 |
| 06/10/2016 | 4.9 |
| 06/10/2016 | 4.9 |
| 06/10/2016 | 4.9 |
| 06/10/2016 | 4.9 |
| 06/10/2016 | 4.8 |
| 06/10/2016 | 4.7 |
| 06/10/2016 | 4.7 |
| 06/10/2016 | 4.8 |
| 06/10/2016 | 5.1 |
| 06/10/2016 | 5.2 |
| 06/10/2016 | 4.7 |
| 06/10/2016 | 4.1 |
| 06/10/2016 | 3.5 |
| 06/10/2016 | 3.1 |
| 06/10/2016 | 2.8 |
| 07/10/2016 | 2.6 |
| 07/10/2016 | 2.5 |
| 07/10/2016 | 2.5 |
| 07/10/2016 | 2.6 |
| 07/10/2016 | 2.9 |
| 07/10/2016 | 3.6 |
| 07/10/2016 | 4.2 |
| 07/10/2016 | 4.6 |
| 07/10/2016 | 4.8 |
| 07/10/2016 | 4.9 |
| 07/10/2016 | 4.9 |
| 07/10/2016 | 4.9 |
| 07/10/2016 | 4.8 |
| 07/10/2016 | 4.6 |
| 07/10/2016 | 4.5 |
| 07/10/2016 | 4.5 |
| 07/10/2016 | 4.6 |
| 07/10/2016 | 4.9 |
| 07/10/2016 | 5 |
| 07/10/2016 | 4.5 |
| 07/10/2016 | 3.9 |
| 07/10/2016 | 3.4 |
| 07/10/2016 | 3.1 |
| 07/10/2016 | 2.8 |
| 08/10/2016 | 2.6 |
| 08/10/2016 | 2.5 |
| 08/10/2016 | 2.4 |
| 08/10/2016 | 2.4 |
| 08/10/2016 | 2.5 |
| 08/10/2016 | 2.7 |
| 08/10/2016 | 3 |
| 08/10/2016 | 3.3 |
| 08/10/2016 | 3.7 |
| 08/10/2016 | 4 |
| 08/10/2016 | 4 |
| 08/10/2016 | 4 |
| 08/10/2016 | 3.9 |
| 08/10/2016 | 3.7 |
| 08/10/2016 | 3.7 |
| 08/10/2016 | 3.7 |
| 08/10/2016 | 3.8 |
| 08/10/2016 | 4.2 |
| 08/10/2016 | 4.3 |
| 08/10/2016 | 4 |
| 08/10/2016 | 3.5 |
| 08/10/2016 | 3.1 |
| 08/10/2016 | 2.9 |
| 08/10/2016 | 2.6 |
| 09/10/2016 | 2.4 |
| 09/10/2016 | 2.3 |
| 09/10/2016 | 2.3 |
| 09/10/2016 | 2.3 |
| 09/10/2016 | 2.3 |
| 09/10/2016 | 2.4 |
| 09/10/2016 | 2.6 |
| 09/10/2016 | 2.8 |
| 09/10/2016 | 3.1 |
| 09/10/2016 | 3.3 |
| 09/10/2016 | 3.5 |
| 09/10/2016 | 3.5 |
| 09/10/2016 | 3.4 |
| 09/10/2016 | 3.3 |
| 09/10/2016 | 3.3 |
| 09/10/2016 | 3.3 |
| 09/10/2016 | 3.5 |
| 09/10/2016 | 3.9 |
| 09/10/2016 | 4 |
| 09/10/2016 | 3.8 |
| 09/10/2016 | 3.5 |
| 09/10/2016 | 3.2 |
| 09/10/2016 | 2.9 |
| 09/10/2016 | 2.6 |
| 10/10/2016 | 2.4 |
| 10/10/2016 | 2.4 |
| 10/10/2016 | 2.3 |
| 10/10/2016 | 2.5 |
| 10/10/2016 | 2.8 |
| 10/10/2016 | 3.5 |
| 10/10/2016 | 4.1 |
| 10/10/2016 | 4.5 |
| 10/10/2016 | 4.7 |
| 10/10/2016 | 4.8 |
| 10/10/2016 | 4.9 |
| 10/10/2016 | 4.9 |
| 10/10/2016 | 4.8 |
| 10/10/2016 | 4.7 |
| 10/10/2016 | 4.6 |
| 10/10/2016 | 4.6 |
| 10/10/2016 | 4.8 |
| 10/10/2016 | 5.2 |
| 10/10/2016 | 5.2 |
| 10/10/2016 | 4.7 |
| 10/10/2016 | 4.1 |
| 10/10/2016 | 3.5 |
| 10/10/2016 | 3.1 |
| 10/10/2016 | 2.8 |
| 11/10/2016 | 2.6 |
| 11/10/2016 | 2.5 |
| 11/10/2016 | 2.4 |
| 11/10/2016 | 2.6 |
| 11/10/2016 | 2.9 |
| 11/10/2016 | 3.6 |
| 11/10/2016 | 4.2 |
| 11/10/2016 | 4.6 |
| 11/10/2016 | 4.8 |
| 11/10/2016 | 4.9 |
| 11/10/2016 | 4.9 |
| 11/10/2016 | 4.9 |
| 11/10/2016 | 4.8 |
| 11/10/2016 | 4.7 |
| 11/10/2016 | 4.7 |
| 11/10/2016 | 4.7 |
| 11/10/2016 | 4.8 |
| 11/10/2016 | 5.2 |
| 11/10/2016 | 5.3 |
| 11/10/2016 | 4.7 |
| 11/10/2016 | 4.1 |
| 11/10/2016 | 3.6 |
| 11/10/2016 | 3.1 |
| 11/10/2016 | 2.8 |
| 12/10/2016 | 2.6 |
| 12/10/2016 | 2.5 |
| 12/10/2016 | 2.5 |
| 12/10/2016 | 2.6 |
| 12/10/2016 | 2.9 |
| 12/10/2016 | 3.6 |
| 12/10/2016 | 4.3 |
| 12/10/2016 | 4.6 |
| 12/10/2016 | 4.8 |
| 12/10/2016 | 4.9 |
| 12/10/2016 | 4.9 |
| 12/10/2016 | 4.9 |
| 12/10/2016 | 4.9 |
| 12/10/2016 | 4.8 |
| 12/10/2016 | 4.7 |
| 12/10/2016 | 4.7 |
| 12/10/2016 | 4.9 |
| 12/10/2016 | 5.3 |
| 12/10/2016 | 5.3 |
| 12/10/2016 | 4.7 |
| 12/10/2016 | 4.1 |
| 12/10/2016 | 3.6 |
| 12/10/2016 | 3.1 |
| 12/10/2016 | 2.8 |
| 13/10/2016 | 2.6 |
| 13/10/2016 | 2.5 |
| 13/10/2016 | 2.5 |
| 13/10/2016 | 2.6 |
| 13/10/2016 | 2.9 |
| 13/10/2016 | 3.6 |
| 13/10/2016 | 4.3 |
| 13/10/2016 | 4.6 |
| 13/10/2016 | 4.8 |
| 13/10/2016 | 4.9 |
| 13/10/2016 | 5 |
| 13/10/2016 | 5 |
| 13/10/2016 | 4.9 |
| 13/10/2016 | 4.8 |
| 13/10/2016 | 4.7 |
| 13/10/2016 | 4.7 |
| 13/10/2016 | 4.9 |
| 13/10/2016 | 5.3 |
| 13/10/2016 | 5.3 |
| 13/10/2016 | 4.8 |
| 13/10/2016 | 4.1 |
| 13/10/2016 | 3.6 |
| 13/10/2016 | 3.1 |
| 13/10/2016 | 2.8 |
| 14/10/2016 | 2.6 |
| 14/10/2016 | 2.5 |
| 14/10/2016 | 2.5 |
| 14/10/2016 | 2.6 |
| 14/10/2016 | 2.9 |
| 14/10/2016 | 3.6 |
| 14/10/2016 | 4.3 |
| 14/10/2016 | 4.6 |
| 14/10/2016 | 4.8 |
| 14/10/2016 | 4.9 |
| 14/10/2016 | 4.9 |
| 14/10/2016 | 4.9 |
| 14/10/2016 | 4.8 |
| 14/10/2016 | 4.7 |
| 14/10/2016 | 4.6 |
| 14/10/2016 | 4.5 |
| 14/10/2016 | 4.7 |
| 14/10/2016 | 5.1 |
| 14/10/2016 | 5.1 |
| 14/10/2016 | 4.5 |
| 14/10/2016 | 3.9 |
| 14/10/2016 | 3.4 |
| 14/10/2016 | 3.1 |
| 14/10/2016 | 2.8 |
| 15/10/2016 | 2.6 |
| 15/10/2016 | 2.5 |
| 15/10/2016 | 2.4 |
| 15/10/2016 | 2.4 |
| 15/10/2016 | 2.5 |
| 15/10/2016 | 2.7 |
| 15/10/2016 | 3 |
| 15/10/2016 | 3.4 |
| 15/10/2016 | 3.7 |
| 15/10/2016 | 4 |
| 15/10/2016 | 4.1 |
| 15/10/2016 | 4 |
| 15/10/2016 | 3.9 |
| 15/10/2016 | 3.8 |
| 15/10/2016 | 3.7 |
| 15/10/2016 | 3.7 |
| 15/10/2016 | 3.9 |
| 15/10/2016 | 4.3 |
| 15/10/2016 | 4.4 |
| 15/10/2016 | 4 |
| 15/10/2016 | 3.5 |
| 15/10/2016 | 3.2 |
| 15/10/2016 | 2.9 |
| 15/10/2016 | 2.6 |
| 16/10/2016 | 2.5 |
| 16/10/2016 | 2.4 |
| 16/10/2016 | 2.3 |
| 16/10/2016 | 2.3 |
| 16/10/2016 | 2.4 |
| 16/10/2016 | 2.5 |
| 16/10/2016 | 2.6 |
| 16/10/2016 | 2.9 |
| 16/10/2016 | 3.2 |
| 16/10/2016 | 3.3 |
| 16/10/2016 | 3.5 |
| 16/10/2016 | 3.5 |
| 16/10/2016 | 3.4 |
| 16/10/2016 | 3.3 |
| 16/10/2016 | 3.3 |
| 16/10/2016 | 3.3 |
| 16/10/2016 | 3.6 |
| 16/10/2016 | 4 |
| 16/10/2016 | 4.1 |
| 16/10/2016 | 3.8 |
| 16/10/2016 | 3.5 |
| 16/10/2016 | 3.2 |
| 16/10/2016 | 2.9 |
| 16/10/2016 | 2.6 |
| 17/10/2016 | 2.4 |
| 17/10/2016 | 2.4 |
| 17/10/2016 | 2.3 |
| 17/10/2016 | 2.5 |
| 17/10/2016 | 2.8 |
| 17/10/2016 | 3.4 |
| 17/10/2016 | 4 |
| 17/10/2016 | 4.4 |
| 17/10/2016 | 4.6 |
| 17/10/2016 | 4.8 |
| 17/10/2016 | 4.8 |
| 17/10/2016 | 4.8 |
| 17/10/2016 | 4.7 |
| 17/10/2016 | 4.6 |
| 17/10/2016 | 4.5 |
| 17/10/2016 | 4.5 |
| 17/10/2016 | 4.7 |
| 17/10/2016 | 5.2 |
| 17/10/2016 | 5.3 |
| 17/10/2016 | 4.6 |
| 17/10/2016 | 4 |
| 17/10/2016 | 3.5 |
| 17/10/2016 | 3.1 |
| 17/10/2016 | 2.8 |
| 18/10/2016 | 2.6 |
| 18/10/2016 | 2.5 |
| 18/10/2016 | 2.4 |
| 18/10/2016 | 2.6 |
| 18/10/2016 | 2.9 |
| 18/10/2016 | 3.5 |
| 18/10/2016 | 4.1 |
| 18/10/2016 | 4.5 |
| 18/10/2016 | 4.7 |
| 18/10/2016 | 4.8 |
| 18/10/2016 | 4.9 |
| 18/10/2016 | 4.9 |
| 18/10/2016 | 4.8 |
| 18/10/2016 | 4.7 |
| 18/10/2016 | 4.6 |
| 18/10/2016 | 4.6 |
| 18/10/2016 | 4.8 |
| 18/10/2016 | 5.2 |
| 18/10/2016 | 5.3 |
| 18/10/2016 | 4.6 |
| 18/10/2016 | 4 |
| 18/10/2016 | 3.5 |
| 18/10/2016 | 3.1 |
| 18/10/2016 | 2.8 |
| 19/10/2016 | 2.6 |
| 19/10/2016 | 2.5 |
| 19/10/2016 | 2.5 |
| 19/10/2016 | 2.6 |
| 19/10/2016 | 2.9 |
| 19/10/2016 | 3.5 |
| 19/10/2016 | 4.1 |
| 19/10/2016 | 4.5 |
| 19/10/2016 | 4.7 |
| 19/10/2016 | 4.9 |
| 19/10/2016 | 4.9 |
| 19/10/2016 | 4.9 |
| 19/10/2016 | 4.8 |
| 19/10/2016 | 4.7 |
| 19/10/2016 | 4.6 |
| 19/10/2016 | 4.6 |
| 19/10/2016 | 4.8 |
| 19/10/2016 | 5.3 |
| 19/10/2016 | 5.3 |
| 19/10/2016 | 4.6 |
| 19/10/2016 | 4 |
| 19/10/2016 | 3.6 |
| 19/10/2016 | 3.2 |
| 19/10/2016 | 2.8 |
| 20/10/2016 | 2.6 |
| 20/10/2016 | 2.5 |
| 20/10/2016 | 2.5 |
| 20/10/2016 | 2.6 |
| 20/10/2016 | 2.9 |
| 20/10/2016 | 3.5 |
| 20/10/2016 | 4.1 |
| 20/10/2016 | 4.5 |
| 20/10/2016 | 4.7 |
| 20/10/2016 | 4.9 |
| 20/10/2016 | 4.9 |
| 20/10/2016 | 4.9 |
| 20/10/2016 | 4.8 |
| 20/10/2016 | 4.7 |
| 20/10/2016 | 4.6 |
| 20/10/2016 | 4.6 |
| 20/10/2016 | 4.8 |
| 20/10/2016 | 5.3 |
| 20/10/2016 | 5.4 |
| 20/10/2016 | 4.7 |
| 20/10/2016 | 4.1 |
| 20/10/2016 | 3.6 |
| 20/10/2016 | 3.2 |
| 20/10/2016 | 2.9 |
| 21/10/2016 | 2.6 |
| 21/10/2016 | 2.5 |
| 21/10/2016 | 2.5 |
| 21/10/2016 | 2.6 |
| 21/10/2016 | 2.9 |
| 21/10/2016 | 3.5 |
| 21/10/2016 | 4.1 |
| 21/10/2016 | 4.5 |
| 21/10/2016 | 4.7 |
| 21/10/2016 | 4.9 |
| 21/10/2016 | 4.9 |
| 21/10/2016 | 4.9 |
| 21/10/2016 | 4.8 |
| 21/10/2016 | 4.6 |
| 21/10/2016 | 4.5 |
| 21/10/2016 | 4.5 |
| 21/10/2016 | 4.7 |
| 21/10/2016 | 5.1 |
| 21/10/2016 | 5.1 |
| 21/10/2016 | 4.5 |
| 21/10/2016 | 3.9 |
| 21/10/2016 | 3.5 |
| 21/10/2016 | 3.1 |
| 21/10/2016 | 2.8 |
| 22/10/2016 | 2.6 |
| 22/10/2016 | 2.5 |
| 22/10/2016 | 2.4 |
| 22/10/2016 | 2.4 |
| 22/10/2016 | 2.5 |
| 22/10/2016 | 2.6 |
| 22/10/2016 | 2.9 |
| 22/10/2016 | 3.3 |
| 22/10/2016 | 3.7 |
| 22/10/2016 | 4 |
| 22/10/2016 | 4 |
| 22/10/2016 | 4 |
| 22/10/2016 | 3.9 |
| 22/10/2016 | 3.7 |
| 22/10/2016 | 3.7 |
| 22/10/2016 | 3.7 |
| 22/10/2016 | 3.9 |
| 22/10/2016 | 4.3 |
| 22/10/2016 | 4.4 |
| 22/10/2016 | 4 |
| 22/10/2016 | 3.5 |
| 22/10/2016 | 3.2 |
| 22/10/2016 | 2.9 |
| 22/10/2016 | 2.7 |
| 23/10/2016 | 2.5 |
| 23/10/2016 | 2.4 |
| 23/10/2016 | 2.3 |
| 23/10/2016 | 2.3 |
| 23/10/2016 | 2.3 |
| 23/10/2016 | 2.4 |
| 23/10/2016 | 2.6 |
| 23/10/2016 | 2.8 |
| 23/10/2016 | 3.1 |
| 23/10/2016 | 3.3 |
| 23/10/2016 | 3.5 |
| 23/10/2016 | 3.5 |
| 23/10/2016 | 3.4 |
| 23/10/2016 | 3.3 |
| 23/10/2016 | 3.3 |
| 23/10/2016 | 3.3 |
| 23/10/2016 | 3.6 |
| 23/10/2016 | 4 |
| 23/10/2016 | 4.1 |
| 23/10/2016 | 3.8 |
| 23/10/2016 | 3.5 |
| 23/10/2016 | 3.2 |
| 23/10/2016 | 3 |
| 23/10/2016 | 2.7 |
| 24/10/2016 | 2.5 |
| 24/10/2016 | 2.4 |
| 24/10/2016 | 2.4 |
| 24/10/2016 | 2.5 |
| 24/10/2016 | 2.8 |
| 24/10/2016 | 3.5 |
| 24/10/2016 | 4.1 |
| 24/10/2016 | 4.4 |
| 24/10/2016 | 4.7 |
| 24/10/2016 | 4.8 |
| 24/10/2016 | 4.9 |
| 24/10/2016 | 4.9 |
| 24/10/2016 | 4.8 |
| 24/10/2016 | 4.7 |
| 24/10/2016 | 4.7 |
| 24/10/2016 | 4.7 |
| 24/10/2016 | 4.9 |
| 24/10/2016 | 5.3 |
| 24/10/2016 | 5.3 |
| 24/10/2016 | 4.7 |
| 24/10/2016 | 4.1 |
| 24/10/2016 | 3.6 |
| 24/10/2016 | 3.2 |
| 24/10/2016 | 2.8 |
| 25/10/2016 | 2.6 |
| 25/10/2016 | 2.5 |
| 25/10/2016 | 2.5 |
| 25/10/2016 | 2.6 |
| 25/10/2016 | 2.9 |
| 25/10/2016 | 3.6 |
| 25/10/2016 | 4.2 |
| 25/10/2016 | 4.5 |
| 25/10/2016 | 4.8 |
| 25/10/2016 | 4.9 |
| 25/10/2016 | 5 |
| 25/10/2016 | 5 |
| 25/10/2016 | 4.9 |
| 25/10/2016 | 4.8 |
| 25/10/2016 | 4.7 |
| 25/10/2016 | 4.8 |
| 25/10/2016 | 5 |
| 25/10/2016 | 5.3 |
| 25/10/2016 | 5.4 |
| 25/10/2016 | 4.7 |
| 25/10/2016 | 4.1 |
| 25/10/2016 | 3.6 |
| 25/10/2016 | 3.2 |
| 25/10/2016 | 2.9 |
| 26/10/2016 | 2.6 |
| 26/10/2016 | 2.5 |
| 26/10/2016 | 2.5 |
| 26/10/2016 | 2.6 |
| 26/10/2016 | 2.9 |
| 26/10/2016 | 3.6 |
| 26/10/2016 | 4.2 |
| 26/10/2016 | 4.6 |
| 26/10/2016 | 4.8 |
| 26/10/2016 | 5 |
| 26/10/2016 | 5 |
| 26/10/2016 | 5 |
| 26/10/2016 | 4.9 |
| 26/10/2016 | 4.8 |
| 26/10/2016 | 4.8 |
| 26/10/2016 | 4.8 |
| 26/10/2016 | 5 |
| 26/10/2016 | 5.4 |
| 26/10/2016 | 5.4 |
| 26/10/2016 | 4.8 |
| 26/10/2016 | 4.1 |
| 26/10/2016 | 3.7 |
| 26/10/2016 | 3.2 |
| 26/10/2016 | 2.9 |
| 27/10/2016 | 2.7 |
| 27/10/2016 | 2.5 |
| 27/10/2016 | 2.5 |
| 27/10/2016 | 2.6 |
| 27/10/2016 | 2.9 |
| 27/10/2016 | 3.6 |
| 27/10/2016 | 4.2 |
| 27/10/2016 | 4.6 |
| 27/10/2016 | 4.8 |
| 27/10/2016 | 5 |
| 27/10/2016 | 5 |
| 27/10/2016 | 5 |
| 27/10/2016 | 5 |
| 27/10/2016 | 4.9 |
| 27/10/2016 | 4.8 |
| 27/10/2016 | 4.9 |
| 27/10/2016 | 5 |
| 27/10/2016 | 5.4 |
| 27/10/2016 | 5.4 |
| 27/10/2016 | 4.8 |
| 27/10/2016 | 4.2 |
| 27/10/2016 | 3.7 |
| 27/10/2016 | 3.3 |
| 27/10/2016 | 2.9 |
| 28/10/2016 | 2.7 |
| 28/10/2016 | 2.6 |
| 28/10/2016 | 2.5 |
| 28/10/2016 | 2.6 |
| 28/10/2016 | 2.9 |
| 28/10/2016 | 3.6 |
| 28/10/2016 | 4.2 |
| 28/10/2016 | 4.6 |
| 28/10/2016 | 4.8 |
| 28/10/2016 | 5 |
| 28/10/2016 | 5 |
| 28/10/2016 | 5 |
| 28/10/2016 | 4.9 |
| 28/10/2016 | 4.7 |
| 28/10/2016 | 4.7 |
| 28/10/2016 | 4.7 |
| 28/10/2016 | 4.9 |
| 28/10/2016 | 5.2 |
| 28/10/2016 | 5.2 |
| 28/10/2016 | 4.6 |
| 28/10/2016 | 4 |
| 28/10/2016 | 3.5 |
| 28/10/2016 | 3.2 |
| 28/10/2016 | 2.9 |
| 29/10/2016 | 2.7 |
| 29/10/2016 | 2.6 |
| 29/10/2016 | 2.5 |
| 29/10/2016 | 2.5 |
| 29/10/2016 | 2.6 |
| 29/10/2016 | 2.8 |
| 29/10/2016 | 3.1 |
| 29/10/2016 | 3.5 |
| 29/10/2016 | 3.9 |
| 29/10/2016 | 4.1 |
| 29/10/2016 | 4.2 |
| 29/10/2016 | 4.2 |
| 29/10/2016 | 4 |
| 29/10/2016 | 3.9 |
| 29/10/2016 | 3.9 |
| 29/10/2016 | 4 |
| 29/10/2016 | 4.1 |
| 29/10/2016 | 4.5 |
| 29/10/2016 | 4.5 |
| 29/10/2016 | 4.2 |
| 29/10/2016 | 3.6 |
| 29/10/2016 | 3.3 |
| 29/10/2016 | 3 |
| 29/10/2016 | 2.7 |
| 30/10/2016 | 2.5 |
| 30/10/2016 | 2.4 |
| 30/10/2016 | 2.4 |
| 30/10/2016 | 2.4 |
| 30/10/2016 | 2.4 |
| 30/10/2016 | 2.4 |
| 30/10/2016 | 2.5 |
| 30/10/2016 | 2.7 |
| 30/10/2016 | 3 |
| 30/10/2016 | 3.2 |
| 30/10/2016 | 3.4 |
| 30/10/2016 | 3.6 |
| 30/10/2016 | 3.6 |
| 30/10/2016 | 3.5 |
| 30/10/2016 | 3.4 |
| 30/10/2016 | 3.4 |
| 30/10/2016 | 3.6 |
| 30/10/2016 | 4.1 |
| 30/10/2016 | 4.4 |
| 30/10/2016 | 4.3 |
| 30/10/2016 | 3.8 |
| 30/10/2016 | 3.5 |
| 30/10/2016 | 3.3 |
| 30/10/2016 | 3 |
| 30/10/2016 | 2.7 |
| 31/10/2016 | 2.5 |
| 31/10/2016 | 2.4 |
| 31/10/2016 | 2.4 |
| 31/10/2016 | 2.5 |
| 31/10/2016 | 2.9 |
| 31/10/2016 | 3.6 |
| 31/10/2016 | 4.3 |
| 31/10/2016 | 4.7 |
| 31/10/2016 | 4.9 |
| 31/10/2016 | 5 |
| 31/10/2016 | 5 |
| 31/10/2016 | 5 |
| 31/10/2016 | 4.9 |
| 31/10/2016 | 4.9 |
| 31/10/2016 | 4.9 |
| 31/10/2016 | 5.1 |
| 31/10/2016 | 5.6 |
| 31/10/2016 | 5.8 |
| 31/10/2016 | 5.6 |
| 31/10/2016 | 4.7 |
| 31/10/2016 | 4.1 |
| 31/10/2016 | 3.6 |
| 31/10/2016 | 3.2 |
| 31/10/2016 | 2.9 |
| 01/11/2016 | 2.7 |
| 01/11/2016 | 2.5 |
| 01/11/2016 | 2.5 |
| 01/11/2016 | 2.7 |
| 01/11/2016 | 3 |
| 01/11/2016 | 3.7 |
| 01/11/2016 | 4.4 |
| 01/11/2016 | 4.8 |
| 01/11/2016 | 5 |
| 01/11/2016 | 5 |
| 01/11/2016 | 5.1 |
| 01/11/2016 | 5.1 |
| 01/11/2016 | 5 |
| 01/11/2016 | 4.9 |
| 01/11/2016 | 4.9 |
| 01/11/2016 | 5.2 |
| 01/11/2016 | 5.6 |
| 01/11/2016 | 5.9 |
| 01/11/2016 | 5.6 |
| 01/11/2016 | 4.8 |
| 01/11/2016 | 4.2 |
| 01/11/2016 | 3.7 |
| 01/11/2016 | 3.2 |
| 01/11/2016 | 2.9 |
| 02/11/2016 | 2.7 |
| 02/11/2016 | 2.6 |
| 02/11/2016 | 2.5 |
| 02/11/2016 | 2.7 |
| 02/11/2016 | 3 |
| 02/11/2016 | 3.7 |
| 02/11/2016 | 4.4 |
| 02/11/2016 | 4.8 |
| 02/11/2016 | 5 |
| 02/11/2016 | 5.1 |
| 02/11/2016 | 5.1 |
| 02/11/2016 | 5.1 |
| 02/11/2016 | 5 |
| 02/11/2016 | 5 |
| 02/11/2016 | 5 |
| 02/11/2016 | 5.2 |
| 02/11/2016 | 5.7 |
| 02/11/2016 | 5.9 |
| 02/11/2016 | 5.6 |
| 02/11/2016 | 4.8 |
| 02/11/2016 | 4.2 |
| 02/11/2016 | 3.7 |
| 02/11/2016 | 3.2 |
| 02/11/2016 | 2.9 |
| 03/11/2016 | 2.7 |
| 03/11/2016 | 2.6 |
| 03/11/2016 | 2.5 |
| 03/11/2016 | 2.7 |
| 03/11/2016 | 3 |
| 03/11/2016 | 3.7 |
| 03/11/2016 | 4.4 |
| 03/11/2016 | 4.8 |
| 03/11/2016 | 5 |
| 03/11/2016 | 5.1 |
| 03/11/2016 | 5.1 |
| 03/11/2016 | 5.1 |
| 03/11/2016 | 5 |
| 03/11/2016 | 5 |
| 03/11/2016 | 5 |
| 03/11/2016 | 5.3 |
| 03/11/2016 | 5.7 |
| 03/11/2016 | 5.9 |
| 03/11/2016 | 5.6 |
| 03/11/2016 | 4.8 |
| 03/11/2016 | 4.2 |
| 03/11/2016 | 3.7 |
| 03/11/2016 | 3.2 |
| 03/11/2016 | 2.9 |
| 04/11/2016 | 2.7 |
| 04/11/2016 | 2.6 |
| 04/11/2016 | 2.6 |
| 04/11/2016 | 2.7 |
| 04/11/2016 | 3 |
| 04/11/2016 | 3.7 |
| 04/11/2016 | 4.4 |
| 04/11/2016 | 4.8 |
| 04/11/2016 | 5 |
| 04/11/2016 | 5.1 |
| 04/11/2016 | 5.1 |
| 04/11/2016 | 5.1 |
| 04/11/2016 | 5 |
| 04/11/2016 | 4.9 |
| 04/11/2016 | 4.9 |
| 04/11/2016 | 5.1 |
| 04/11/2016 | 5.5 |
| 04/11/2016 | 5.7 |
| 04/11/2016 | 5.4 |
| 04/11/2016 | 4.6 |
| 04/11/2016 | 4 |
| 04/11/2016 | 3.6 |
| 04/11/2016 | 3.2 |
| 04/11/2016 | 2.9 |
| 05/11/2016 | 2.7 |
| 05/11/2016 | 2.6 |
| 05/11/2016 | 2.5 |
| 05/11/2016 | 2.5 |
| 05/11/2016 | 2.6 |
| 05/11/2016 | 2.8 |
| 05/11/2016 | 3.1 |
| 05/11/2016 | 3.5 |
| 05/11/2016 | 3.9 |
| 05/11/2016 | 4.1 |
| 05/11/2016 | 4.2 |
| 05/11/2016 | 4.2 |
| 05/11/2016 | 4.1 |
| 05/11/2016 | 4 |
| 05/11/2016 | 4 |
| 05/11/2016 | 4.2 |
| 05/11/2016 | 4.6 |
| 05/11/2016 | 4.8 |
| 05/11/2016 | 4.7 |
| 05/11/2016 | 4.1 |
| 05/11/2016 | 3.6 |
| 05/11/2016 | 3.3 |
| 05/11/2016 | 3 |
| 05/11/2016 | 2.7 |
| 06/11/2016 | 2.6 |
| 06/11/2016 | 2.5 |
| 06/11/2016 | 2.4 |
| 06/11/2016 | 2.4 |
| 06/11/2016 | 2.4 |
| 06/11/2016 | 2.6 |
| 06/11/2016 | 2.8 |
| 06/11/2016 | 3 |
| 06/11/2016 | 3.3 |
| 06/11/2016 | 3.5 |
| 06/11/2016 | 3.7 |
| 06/11/2016 | 3.7 |
| 06/11/2016 | 3.6 |
| 06/11/2016 | 3.5 |
| 06/11/2016 | 3.6 |
| 06/11/2016 | 3.8 |
| 06/11/2016 | 4.3 |
| 06/11/2016 | 4.5 |
| 06/11/2016 | 4.4 |
| 06/11/2016 | 3.9 |
| 06/11/2016 | 3.6 |
| 06/11/2016 | 3.4 |
| 06/11/2016 | 3 |
| 06/11/2016 | 2.8 |
| 07/11/2016 | 2.6 |
| 07/11/2016 | 2.5 |
| 07/11/2016 | 2.5 |
| 07/11/2016 | 2.6 |
| 07/11/2016 | 2.9 |
| 07/11/2016 | 3.7 |
| 07/11/2016 | 4.4 |
| 07/11/2016 | 4.8 |
| 07/11/2016 | 5 |
| 07/11/2016 | 5.1 |
| 07/11/2016 | 5.1 |
| 07/11/2016 | 5.1 |
| 07/11/2016 | 5 |
| 07/11/2016 | 5 |
| 07/11/2016 | 5 |
| 07/11/2016 | 5.3 |
| 07/11/2016 | 5.8 |
| 07/11/2016 | 5.9 |
| 07/11/2016 | 5.6 |
| 07/11/2016 | 4.9 |
| 07/11/2016 | 4.2 |
| 07/11/2016 | 3.7 |
| 07/11/2016 | 3.3 |
| 07/11/2016 | 2.9 |
| 08/11/2016 | 2.7 |
| 08/11/2016 | 2.6 |
| 08/11/2016 | 2.6 |
| 08/11/2016 | 2.7 |
| 08/11/2016 | 3 |
| 08/11/2016 | 3.8 |
| 08/11/2016 | 4.5 |
| 08/11/2016 | 4.9 |
| 08/11/2016 | 5 |
| 08/11/2016 | 5.1 |
| 08/11/2016 | 5.2 |
| 08/11/2016 | 5.2 |
| 08/11/2016 | 5.1 |
| 08/11/2016 | 5.1 |
| 08/11/2016 | 5.1 |
| 08/11/2016 | 5.4 |
| 08/11/2016 | 5.8 |
| 08/11/2016 | 6 |
| 08/11/2016 | 5.7 |
| 08/11/2016 | 4.9 |
| 08/11/2016 | 4.3 |
| 08/11/2016 | 3.8 |
| 08/11/2016 | 3.3 |
| 08/11/2016 | 3 |
| 09/11/2016 | 2.7 |
| 09/11/2016 | 2.6 |
| 09/11/2016 | 2.6 |
| 09/11/2016 | 2.7 |
| 09/11/2016 | 3 |
| 09/11/2016 | 3.8 |
| 09/11/2016 | 4.5 |
| 09/11/2016 | 4.9 |
| 09/11/2016 | 5.1 |
| 09/11/2016 | 5.2 |
| 09/11/2016 | 5.2 |
| 09/11/2016 | 5.2 |
| 09/11/2016 | 5.1 |
| 09/11/2016 | 5.1 |
| 09/11/2016 | 5.1 |
| 09/11/2016 | 5.5 |
| 09/11/2016 | 5.9 |
| 09/11/2016 | 6 |
| 09/11/2016 | 5.7 |
| 09/11/2016 | 4.9 |
| 09/11/2016 | 4.3 |
| 09/11/2016 | 3.8 |
| 09/11/2016 | 3.3 |
| 09/11/2016 | 3 |
| 10/11/2016 | 2.7 |
| 10/11/2016 | 2.6 |
| 10/11/2016 | 2.6 |
| 10/11/2016 | 2.7 |
| 10/11/2016 | 3 |
| 10/11/2016 | 3.8 |
| 10/11/2016 | 4.5 |
| 10/11/2016 | 4.9 |
| 10/11/2016 | 5.1 |
| 10/11/2016 | 5.2 |
| 10/11/2016 | 5.2 |
| 10/11/2016 | 5.2 |
| 10/11/2016 | 5.2 |
| 10/11/2016 | 5.2 |
| 10/11/2016 | 5.2 |
| 10/11/2016 | 5.5 |
| 10/11/2016 | 5.9 |
| 10/11/2016 | 6 |
| 10/11/2016 | 5.7 |
| 10/11/2016 | 5 |
| 10/11/2016 | 4.3 |
| 10/11/2016 | 3.8 |
| 10/11/2016 | 3.3 |
| 10/11/2016 | 3 |
| 11/11/2016 | 2.8 |
| 11/11/2016 | 2.6 |
| 11/11/2016 | 2.6 |
| 11/11/2016 | 2.7 |
| 11/11/2016 | 3 |
| 11/11/2016 | 3.8 |
| 11/11/2016 | 4.5 |
| 11/11/2016 | 4.9 |
| 11/11/2016 | 5.1 |
| 11/11/2016 | 5.2 |
| 11/11/2016 | 5.2 |
| 11/11/2016 | 5.2 |
| 11/11/2016 | 5.1 |
| 11/11/2016 | 5 |
| 11/11/2016 | 5 |
| 11/11/2016 | 5.4 |
| 11/11/2016 | 5.7 |
| 11/11/2016 | 5.8 |
| 11/11/2016 | 5.5 |
| 11/11/2016 | 4.7 |
| 11/11/2016 | 4.1 |
| 11/11/2016 | 3.7 |
| 11/11/2016 | 3.3 |
| 11/11/2016 | 3 |
| 12/11/2016 | 2.7 |
| 12/11/2016 | 2.6 |
| 12/11/2016 | 2.6 |
| 12/11/2016 | 2.6 |
| 12/11/2016 | 2.6 |
| 12/11/2016 | 2.9 |
| 12/11/2016 | 3.2 |
| 12/11/2016 | 3.6 |
| 12/11/2016 | 4 |
| 12/11/2016 | 4.2 |
| 12/11/2016 | 4.3 |
| 12/11/2016 | 4.3 |
| 12/11/2016 | 4.2 |
| 12/11/2016 | 4.1 |
| 12/11/2016 | 4.1 |
| 12/11/2016 | 4.5 |
| 12/11/2016 | 4.8 |
| 12/11/2016 | 4.9 |
| 12/11/2016 | 4.7 |
| 12/11/2016 | 4.2 |
| 12/11/2016 | 3.7 |
| 12/11/2016 | 3.4 |
| 12/11/2016 | 3.1 |
| 12/11/2016 | 2.8 |
| 13/11/2016 | 2.6 |
| 13/11/2016 | 2.5 |
| 13/11/2016 | 2.5 |
| 13/11/2016 | 2.4 |
| 13/11/2016 | 2.5 |
| 13/11/2016 | 2.6 |
| 13/11/2016 | 2.8 |
| 13/11/2016 | 3.1 |
| 13/11/2016 | 3.4 |
| 13/11/2016 | 3.6 |
| 13/11/2016 | 3.7 |
| 13/11/2016 | 3.8 |
| 13/11/2016 | 3.7 |
| 13/11/2016 | 3.6 |
| 13/11/2016 | 3.7 |
| 13/11/2016 | 4 |
| 13/11/2016 | 4.4 |
| 13/11/2016 | 4.6 |
| 13/11/2016 | 4.4 |
| 13/11/2016 | 4 |
| 13/11/2016 | 3.7 |
| 13/11/2016 | 3.5 |
| 13/11/2016 | 3.1 |
| 13/11/2016 | 2.8 |
| 14/11/2016 | 2.6 |
| 14/11/2016 | 2.5 |
| 14/11/2016 | 2.5 |
| 14/11/2016 | 2.6 |
| 14/11/2016 | 3 |
| 14/11/2016 | 3.8 |
| 14/11/2016 | 4.5 |
| 14/11/2016 | 4.9 |
| 14/11/2016 | 5 |
| 14/11/2016 | 5.2 |
| 14/11/2016 | 5.2 |
| 14/11/2016 | 5.2 |
| 14/11/2016 | 5.2 |
| 14/11/2016 | 5.2 |
| 14/11/2016 | 5.2 |
| 14/11/2016 | 5.6 |
| 14/11/2016 | 6 |
| 14/11/2016 | 6 |
| 14/11/2016 | 5.7 |
| 14/11/2016 | 5 |
| 14/11/2016 | 4.3 |
| 14/11/2016 | 3.8 |
| 14/11/2016 | 3.3 |
| 14/11/2016 | 3 |
| 15/11/2016 | 2.8 |
| 15/11/2016 | 2.6 |
| 15/11/2016 | 2.6 |
| 15/11/2016 | 2.7 |
| 15/11/2016 | 3.1 |
| 15/11/2016 | 3.8 |
| 15/11/2016 | 4.6 |
| 15/11/2016 | 4.9 |
| 15/11/2016 | 5.1 |
| 15/11/2016 | 5.2 |
| 15/11/2016 | 5.3 |
| 15/11/2016 | 5.3 |
| 15/11/2016 | 5.2 |
| 15/11/2016 | 5.2 |
| 15/11/2016 | 5.3 |
| 15/11/2016 | 5.7 |
| 15/11/2016 | 6.1 |
| 15/11/2016 | 6 |
| 15/11/2016 | 5.7 |
| 15/11/2016 | 5 |
| 15/11/2016 | 4.4 |
| 15/11/2016 | 3.9 |
| 15/11/2016 | 3.4 |
| 15/11/2016 | 3 |
| 16/11/2016 | 2.8 |
| 16/11/2016 | 2.7 |
| 16/11/2016 | 2.6 |
| 16/11/2016 | 2.8 |
| 16/11/2016 | 3.1 |
| 16/11/2016 | 3.9 |
| 16/11/2016 | 4.6 |
| 16/11/2016 | 5 |
| 16/11/2016 | 5.2 |
| 16/11/2016 | 5.3 |
| 16/11/2016 | 5.3 |
| 16/11/2016 | 5.3 |
| 16/11/2016 | 5.3 |
| 16/11/2016 | 5.3 |
| 16/11/2016 | 5.3 |
| 16/11/2016 | 5.7 |
| 16/11/2016 | 6.1 |
| 16/11/2016 | 6.1 |
| 16/11/2016 | 5.8 |
| 16/11/2016 | 5 |
| 16/11/2016 | 4.4 |
| 16/11/2016 | 3.9 |
| 16/11/2016 | 3.4 |
| 16/11/2016 | 3 |
| 17/11/2016 | 2.8 |
| 17/11/2016 | 2.7 |
| 17/11/2016 | 2.6 |
| 17/11/2016 | 2.8 |
| 17/11/2016 | 3.1 |
| 17/11/2016 | 3.9 |
| 17/11/2016 | 4.6 |
| 17/11/2016 | 5 |
| 17/11/2016 | 5.2 |
| 17/11/2016 | 5.3 |
| 17/11/2016 | 5.4 |
| 17/11/2016 | 5.4 |
| 17/11/2016 | 5.3 |
| 17/11/2016 | 5.3 |
| 17/11/2016 | 5.4 |
| 17/11/2016 | 5.8 |
| 17/11/2016 | 6.1 |
| 17/11/2016 | 6.1 |
| 17/11/2016 | 5.8 |
| 17/11/2016 | 5.1 |
| 17/11/2016 | 4.4 |
| 17/11/2016 | 3.9 |
| 17/11/2016 | 3.4 |
| 17/11/2016 | 3.1 |
| 18/11/2016 | 2.8 |
| 18/11/2016 | 2.7 |
| 18/11/2016 | 2.7 |
| 18/11/2016 | 2.8 |
| 18/11/2016 | 3.1 |
| 18/11/2016 | 3.9 |
| 18/11/2016 | 4.6 |
| 18/11/2016 | 5 |
| 18/11/2016 | 5.2 |
| 18/11/2016 | 5.3 |
| 18/11/2016 | 5.4 |
| 18/11/2016 | 5.3 |
| 18/11/2016 | 5.2 |
| 18/11/2016 | 5.2 |
| 18/11/2016 | 5.2 |
| 18/11/2016 | 5.7 |
| 18/11/2016 | 5.9 |
| 18/11/2016 | 5.8 |
| 18/11/2016 | 5.5 |
| 18/11/2016 | 4.9 |
| 18/11/2016 | 4.2 |
| 18/11/2016 | 3.8 |
| 18/11/2016 | 3.4 |
| 18/11/2016 | 3 |
| 19/11/2016 | 2.8 |
| 19/11/2016 | 2.7 |
| 19/11/2016 | 2.6 |
| 19/11/2016 | 2.6 |
| 19/11/2016 | 2.7 |
| 19/11/2016 | 2.9 |
| 19/11/2016 | 3.3 |
| 19/11/2016 | 3.7 |
| 19/11/2016 | 4.1 |
| 19/11/2016 | 4.3 |
| 19/11/2016 | 4.4 |
| 19/11/2016 | 4.4 |
| 19/11/2016 | 4.3 |
| 19/11/2016 | 4.2 |
| 19/11/2016 | 4.3 |
| 19/11/2016 | 4.7 |
| 19/11/2016 | 5 |
| 19/11/2016 | 5 |
| 19/11/2016 | 4.8 |
| 19/11/2016 | 4.3 |
| 19/11/2016 | 3.8 |
| 19/11/2016 | 3.5 |
| 19/11/2016 | 3.2 |
| 19/11/2016 | 2.9 |
| 20/11/2016 | 2.7 |
| 20/11/2016 | 2.6 |
| 20/11/2016 | 2.5 |
| 20/11/2016 | 2.5 |
| 20/11/2016 | 2.5 |
| 20/11/2016 | 2.6 |
| 20/11/2016 | 2.9 |
| 20/11/2016 | 3.1 |
| 20/11/2016 | 3.4 |
| 20/11/2016 | 3.6 |
| 20/11/2016 | 3.8 |
| 20/11/2016 | 3.9 |
| 20/11/2016 | 3.8 |
| 20/11/2016 | 3.8 |
| 20/11/2016 | 3.8 |
| 20/11/2016 | 4.3 |
| 20/11/2016 | 4.6 |
| 20/11/2016 | 4.6 |
| 20/11/2016 | 4.5 |
| 20/11/2016 | 4.1 |
| 20/11/2016 | 3.8 |
| 20/11/2016 | 3.5 |
| 20/11/2016 | 3.2 |
| 20/11/2016 | 2.9 |
| 21/11/2016 | 2.7 |
| 21/11/2016 | 2.6 |
| 21/11/2016 | 2.5 |
| 21/11/2016 | 2.7 |
| 21/11/2016 | 3 |
| 21/11/2016 | 3.8 |
| 21/11/2016 | 4.5 |
| 21/11/2016 | 4.9 |
| 21/11/2016 | 5.1 |
| 21/11/2016 | 5.3 |
| 21/11/2016 | 5.3 |
| 21/11/2016 | 5.3 |
| 21/11/2016 | 5.3 |
| 21/11/2016 | 5.3 |
| 21/11/2016 | 5.4 |
| 21/11/2016 | 5.9 |
| 21/11/2016 | 6.2 |
| 21/11/2016 | 6.1 |
| 21/11/2016 | 5.8 |
| 21/11/2016 | 5.1 |
| 21/11/2016 | 4.4 |
| 21/11/2016 | 3.9 |
| 21/11/2016 | 3.4 |
| 21/11/2016 | 3.1 |
| 22/11/2016 | 2.8 |
| 22/11/2016 | 2.7 |
| 22/11/2016 | 2.7 |
| 22/11/2016 | 2.8 |
| 22/11/2016 | 3.1 |
| 22/11/2016 | 3.9 |
| 22/11/2016 | 4.6 |
| 22/11/2016 | 5 |
| 22/11/2016 | 5.2 |
| 22/11/2016 | 5.3 |
| 22/11/2016 | 5.4 |
| 22/11/2016 | 5.4 |
| 22/11/2016 | 5.4 |
| 22/11/2016 | 5.4 |
| 22/11/2016 | 5.5 |
| 22/11/2016 | 6 |
| 22/11/2016 | 6.3 |
| 22/11/2016 | 6.1 |
| 22/11/2016 | 5.8 |
| 22/11/2016 | 5.2 |
| 22/11/2016 | 4.5 |
| 22/11/2016 | 4 |
| 22/11/2016 | 3.5 |
| 22/11/2016 | 3.1 |
| 23/11/2016 | 2.8 |
| 23/11/2016 | 2.7 |
| 23/11/2016 | 2.7 |
| 23/11/2016 | 2.8 |
| 23/11/2016 | 3.1 |
| 23/11/2016 | 3.9 |
| 23/11/2016 | 4.7 |
| 23/11/2016 | 5.1 |
| 23/11/2016 | 5.3 |
| 23/11/2016 | 5.4 |
| 23/11/2016 | 5.4 |
| 23/11/2016 | 5.4 |
| 23/11/2016 | 5.4 |
| 23/11/2016 | 5.4 |
| 23/11/2016 | 5.5 |
| 23/11/2016 | 6 |
| 23/11/2016 | 6.3 |
| 23/11/2016 | 6.2 |
| 23/11/2016 | 5.8 |
| 23/11/2016 | 5.2 |
| 23/11/2016 | 4.5 |
| 23/11/2016 | 4 |
| 23/11/2016 | 3.5 |
| 23/11/2016 | 3.1 |
| 24/11/2016 | 2.9 |
| 24/11/2016 | 2.7 |
| 24/11/2016 | 2.7 |
| 24/11/2016 | 2.8 |
| 24/11/2016 | 3.1 |
| 24/11/2016 | 3.9 |
| 24/11/2016 | 4.7 |
| 24/11/2016 | 5.1 |
| 24/11/2016 | 5.3 |
| 24/11/2016 | 5.4 |
| 24/11/2016 | 5.5 |
| 24/11/2016 | 5.5 |
| 24/11/2016 | 5.4 |
| 24/11/2016 | 5.4 |
| 24/11/2016 | 5.5 |
| 24/11/2016 | 6.1 |
| 24/11/2016 | 6.3 |
| 24/11/2016 | 6.2 |
| 24/11/2016 | 5.8 |
| 24/11/2016 | 5.2 |
| 24/11/2016 | 4.5 |
| 24/11/2016 | 4 |
| 24/11/2016 | 3.5 |
| 24/11/2016 | 3.1 |
| 25/11/2016 | 2.9 |
| 25/11/2016 | 2.7 |
| 25/11/2016 | 2.7 |
| 25/11/2016 | 2.8 |
| 25/11/2016 | 3.1 |
| 25/11/2016 | 3.9 |
| 25/11/2016 | 4.7 |
| 25/11/2016 | 5.1 |
| 25/11/2016 | 5.3 |
| 25/11/2016 | 5.4 |
| 25/11/2016 | 5.5 |
| 25/11/2016 | 5.4 |
| 25/11/2016 | 5.3 |
| 25/11/2016 | 5.3 |
| 25/11/2016 | 5.4 |
| 25/11/2016 | 5.9 |
| 25/11/2016 | 6.1 |
| 25/11/2016 | 5.9 |
| 25/11/2016 | 5.6 |
| 25/11/2016 | 5 |
| 25/11/2016 | 4.3 |
| 25/11/2016 | 3.9 |
| 25/11/2016 | 3.4 |
| 25/11/2016 | 3.1 |
| 26/11/2016 | 2.8 |
| 26/11/2016 | 2.7 |
| 26/11/2016 | 2.7 |
| 26/11/2016 | 2.6 |
| 26/11/2016 | 2.7 |
| 26/11/2016 | 2.9 |
| 26/11/2016 | 3.3 |
| 26/11/2016 | 3.7 |
| 26/11/2016 | 4.1 |
| 26/11/2016 | 4.4 |
| 26/11/2016 | 4.5 |
| 26/11/2016 | 4.5 |
| 26/11/2016 | 4.4 |
| 26/11/2016 | 4.3 |
| 26/11/2016 | 4.4 |
| 26/11/2016 | 4.9 |
| 26/11/2016 | 5.1 |
| 26/11/2016 | 5 |
| 26/11/2016 | 4.8 |
| 26/11/2016 | 4.4 |
| 26/11/2016 | 3.9 |
| 26/11/2016 | 3.6 |
| 26/11/2016 | 3.2 |
| 26/11/2016 | 2.9 |
| 27/11/2016 | 2.7 |
| 27/11/2016 | 2.6 |
| 27/11/2016 | 2.5 |
| 27/11/2016 | 2.5 |
| 27/11/2016 | 2.5 |
| 27/11/2016 | 2.7 |
| 27/11/2016 | 2.9 |
| 27/11/2016 | 3.2 |
| 27/11/2016 | 3.5 |
| 27/11/2016 | 3.7 |
| 27/11/2016 | 3.9 |
| 27/11/2016 | 4 |
| 27/11/2016 | 3.9 |
| 27/11/2016 | 3.8 |
| 27/11/2016 | 3.9 |
| 27/11/2016 | 4.4 |
| 27/11/2016 | 4.7 |
| 27/11/2016 | 4.7 |
| 27/11/2016 | 4.5 |
| 27/11/2016 | 4.2 |
| 27/11/2016 | 3.8 |
| 27/11/2016 | 3.6 |
| 27/11/2016 | 3.2 |
| 27/11/2016 | 2.9 |
| 28/11/2016 | 2.7 |
| 28/11/2016 | 2.6 |
| 28/11/2016 | 2.6 |
| 28/11/2016 | 2.7 |
| 28/11/2016 | 3 |
| 28/11/2016 | 3.8 |
| 28/11/2016 | 4.6 |
| 28/11/2016 | 5 |
| 28/11/2016 | 5.2 |
| 28/11/2016 | 5.3 |
| 28/11/2016 | 5.4 |
| 28/11/2016 | 5.4 |
| 28/11/2016 | 5.4 |
| 28/11/2016 | 5.4 |
| 28/11/2016 | 5.5 |
| 28/11/2016 | 6 |
| 28/11/2016 | 6.3 |
| 28/11/2016 | 6.1 |
| 28/11/2016 | 5.8 |
| 28/11/2016 | 5.2 |
| 28/11/2016 | 4.5 |
| 28/11/2016 | 4 |
| 28/11/2016 | 3.5 |
| 28/11/2016 | 3.1 |
| 29/11/2016 | 2.8 |
| 29/11/2016 | 2.7 |
| 29/11/2016 | 2.7 |
| 29/11/2016 | 2.8 |
| 29/11/2016 | 3.1 |
| 29/11/2016 | 3.9 |
| 29/11/2016 | 4.7 |
| 29/11/2016 | 5.1 |
| 29/11/2016 | 5.2 |
| 29/11/2016 | 5.4 |
| 29/11/2016 | 5.5 |
| 29/11/2016 | 5.5 |
| 29/11/2016 | 5.4 |
| 29/11/2016 | 5.4 |
| 29/11/2016 | 5.5 |
| 29/11/2016 | 6.1 |
| 29/11/2016 | 6.3 |
| 29/11/2016 | 6.2 |
| 29/11/2016 | 5.8 |
| 29/11/2016 | 5.2 |
| 29/11/2016 | 4.5 |
| 29/11/2016 | 4 |
| 29/11/2016 | 3.5 |
| 29/11/2016 | 3.1 |
| 30/11/2016 | 2.9 |
| 30/11/2016 | 2.7 |
| 30/11/2016 | 2.7 |
| 30/11/2016 | 2.8 |
| 30/11/2016 | 3.1 |
| 30/11/2016 | 3.9 |
| 30/11/2016 | 4.7 |
| 30/11/2016 | 5.1 |
| 30/11/2016 | 5.3 |
| 30/11/2016 | 5.4 |
| 30/11/2016 | 5.5 |
| 30/11/2016 | 5.5 |
| 30/11/2016 | 5.4 |
| 30/11/2016 | 5.4 |
| 30/11/2016 | 5.6 |
| 30/11/2016 | 6.1 |
| 30/11/2016 | 6.3 |
| 30/11/2016 | 6.2 |
| 30/11/2016 | 5.8 |
| 30/11/2016 | 5.2 |
| 30/11/2016 | 4.5 |
| 30/11/2016 | 4 |
| 30/11/2016 | 3.5 |
| 30/11/2016 | 3.1 |
| 01/12/2016 | 2.9 |
| 01/12/2016 | 2.7 |
| 01/12/2016 | 2.7 |
| 01/12/2016 | 2.8 |
| 01/12/2016 | 3.1 |
| 01/12/2016 | 3.9 |
| 01/12/2016 | 4.7 |
| 01/12/2016 | 5.1 |
| 01/12/2016 | 5.3 |
| 01/12/2016 | 5.4 |
| 01/12/2016 | 5.5 |
| 01/12/2016 | 5.5 |
| 01/12/2016 | 5.5 |
| 01/12/2016 | 5.5 |
| 01/12/2016 | 5.6 |
| 01/12/2016 | 6.1 |
| 01/12/2016 | 6.3 |
| 01/12/2016 | 6.2 |
| 01/12/2016 | 5.8 |
| 01/12/2016 | 5.2 |
| 01/12/2016 | 4.5 |
| 01/12/2016 | 4 |
| 01/12/2016 | 3.5 |
| 01/12/2016 | 3.2 |
| 02/12/2016 | 2.9 |
| 02/12/2016 | 2.7 |
| 02/12/2016 | 2.7 |
| 02/12/2016 | 2.8 |
| 02/12/2016 | 3.1 |
| 02/12/2016 | 3.9 |
| 02/12/2016 | 4.6 |
| 02/12/2016 | 5.1 |
| 02/12/2016 | 5.3 |
| 02/12/2016 | 5.4 |
| 02/12/2016 | 5.5 |
| 02/12/2016 | 5.5 |
| 02/12/2016 | 5.3 |
| 02/12/2016 | 5.3 |
| 02/12/2016 | 5.4 |
| 02/12/2016 | 5.9 |
| 02/12/2016 | 6.1 |
| 02/12/2016 | 5.9 |
| 02/12/2016 | 5.6 |
| 02/12/2016 | 5 |
| 02/12/2016 | 4.3 |
| 02/12/2016 | 3.9 |
| 02/12/2016 | 3.5 |
| 02/12/2016 | 3.1 |
| 03/12/2016 | 2.9 |
| 03/12/2016 | 2.7 |
| 03/12/2016 | 2.7 |
| 03/12/2016 | 2.6 |
| 03/12/2016 | 2.7 |
| 03/12/2016 | 2.9 |
| 03/12/2016 | 3.3 |
| 03/12/2016 | 3.7 |
| 03/12/2016 | 4.1 |
| 03/12/2016 | 4.4 |
| 03/12/2016 | 4.5 |
| 03/12/2016 | 4.5 |
| 03/12/2016 | 4.4 |
| 03/12/2016 | 4.3 |
| 03/12/2016 | 4.4 |
| 03/12/2016 | 4.9 |
| 03/12/2016 | 5.1 |
| 03/12/2016 | 5 |
| 03/12/2016 | 4.8 |
| 03/12/2016 | 4.4 |
| 03/12/2016 | 3.9 |
| 03/12/2016 | 3.6 |
| 03/12/2016 | 3.2 |
| 03/12/2016 | 2.9 |
| 04/12/2016 | 2.7 |
| 04/12/2016 | 2.6 |
| 04/12/2016 | 2.5 |
| 04/12/2016 | 2.5 |
| 04/12/2016 | 2.5 |
| 04/12/2016 | 2.7 |
| 04/12/2016 | 2.9 |
| 04/12/2016 | 3.2 |
| 04/12/2016 | 3.5 |
| 04/12/2016 | 3.7 |
| 04/12/2016 | 3.9 |
| 04/12/2016 | 4 |
| 04/12/2016 | 3.9 |
| 04/12/2016 | 3.8 |
| 04/12/2016 | 3.9 |
| 04/12/2016 | 4.4 |
| 04/12/2016 | 4.7 |
| 04/12/2016 | 4.7 |
| 04/12/2016 | 4.5 |
| 04/12/2016 | 4.2 |
| 04/12/2016 | 3.9 |
| 04/12/2016 | 3.6 |
| 04/12/2016 | 3.3 |
| 04/12/2016 | 3 |
| 05/12/2016 | 2.7 |
| 05/12/2016 | 2.6 |
| 05/12/2016 | 2.6 |
| 05/12/2016 | 2.7 |
| 05/12/2016 | 3 |
| 05/12/2016 | 3.8 |
| 05/12/2016 | 4.6 |
| 05/12/2016 | 5 |
| 05/12/2016 | 5.2 |
| 05/12/2016 | 5.3 |
| 05/12/2016 | 5.4 |
| 05/12/2016 | 5.4 |
| 05/12/2016 | 5.4 |
| 05/12/2016 | 5.4 |
| 05/12/2016 | 5.5 |
| 05/12/2016 | 6 |
| 05/12/2016 | 6.2 |
| 05/12/2016 | 6.1 |
| 05/12/2016 | 5.8 |
| 05/12/2016 | 5.2 |
| 05/12/2016 | 4.5 |
| 05/12/2016 | 4 |
| 05/12/2016 | 3.5 |
| 05/12/2016 | 3.1 |
| 06/12/2016 | 2.9 |
| 06/12/2016 | 2.7 |
| 06/12/2016 | 2.7 |
| 06/12/2016 | 2.8 |
| 06/12/2016 | 3.1 |
| 06/12/2016 | 3.9 |
| 06/12/2016 | 4.6 |
| 06/12/2016 | 5 |
| 06/12/2016 | 5.2 |
| 06/12/2016 | 5.4 |
| 06/12/2016 | 5.5 |
| 06/12/2016 | 5.5 |
| 06/12/2016 | 5.4 |
| 06/12/2016 | 5.4 |
| 06/12/2016 | 5.6 |
| 06/12/2016 | 6.1 |
| 06/12/2016 | 6.3 |
| 06/12/2016 | 6.1 |
| 06/12/2016 | 5.8 |
| 06/12/2016 | 5.2 |
| 06/12/2016 | 4.5 |
| 06/12/2016 | 4 |
| 06/12/2016 | 3.5 |
| 06/12/2016 | 3.1 |
| 07/12/2016 | 2.9 |
| 07/12/2016 | 2.7 |
| 07/12/2016 | 2.7 |
| 07/12/2016 | 2.8 |
| 07/12/2016 | 3.1 |
| 07/12/2016 | 3.9 |
| 07/12/2016 | 4.7 |
| 07/12/2016 | 5.1 |
| 07/12/2016 | 5.3 |
| 07/12/2016 | 5.4 |
| 07/12/2016 | 5.5 |
| 07/12/2016 | 5.5 |
| 07/12/2016 | 5.4 |
| 07/12/2016 | 5.5 |
| 07/12/2016 | 5.6 |
| 07/12/2016 | 6.1 |
| 07/12/2016 | 6.3 |
| 07/12/2016 | 6.2 |
| 07/12/2016 | 5.8 |
| 07/12/2016 | 5.2 |
| 07/12/2016 | 4.5 |
| 07/12/2016 | 4 |
| 07/12/2016 | 3.5 |
| 07/12/2016 | 3.2 |
| 08/12/2016 | 2.9 |
| 08/12/2016 | 2.7 |
| 08/12/2016 | 2.7 |
| 08/12/2016 | 2.8 |
| 08/12/2016 | 3.1 |
| 08/12/2016 | 3.9 |
| 08/12/2016 | 4.7 |
| 08/12/2016 | 5.1 |
| 08/12/2016 | 5.3 |
| 08/12/2016 | 5.4 |
| 08/12/2016 | 5.5 |
| 08/12/2016 | 5.5 |
| 08/12/2016 | 5.5 |
| 08/12/2016 | 5.5 |
| 08/12/2016 | 5.6 |
| 08/12/2016 | 6.1 |
| 08/12/2016 | 6.3 |
| 08/12/2016 | 6.2 |
| 08/12/2016 | 5.9 |
| 08/12/2016 | 5.2 |
| 08/12/2016 | 4.6 |
| 08/12/2016 | 4 |
| 08/12/2016 | 3.5 |
| 08/12/2016 | 3.2 |
| 09/12/2016 | 2.9 |
| 09/12/2016 | 2.7 |
| 09/12/2016 | 2.7 |
| 09/12/2016 | 2.8 |
| 09/12/2016 | 3.1 |
| 09/12/2016 | 3.9 |
| 09/12/2016 | 4.6 |
| 09/12/2016 | 5 |
| 09/12/2016 | 5.3 |
| 09/12/2016 | 5.4 |
| 09/12/2016 | 5.5 |
| 09/12/2016 | 5.5 |
| 09/12/2016 | 5.4 |
| 09/12/2016 | 5.3 |
| 09/12/2016 | 5.4 |
| 09/12/2016 | 5.9 |
| 09/12/2016 | 6.1 |
| 09/12/2016 | 5.9 |
| 09/12/2016 | 5.6 |
| 09/12/2016 | 5 |
| 09/12/2016 | 4.3 |
| 09/12/2016 | 3.9 |
| 09/12/2016 | 3.5 |
| 09/12/2016 | 3.1 |
| 10/12/2016 | 2.9 |
| 10/12/2016 | 2.7 |
| 10/12/2016 | 2.7 |
| 10/12/2016 | 2.6 |
| 10/12/2016 | 2.7 |
| 10/12/2016 | 2.9 |
| 10/12/2016 | 3.3 |
| 10/12/2016 | 3.7 |
| 10/12/2016 | 4.1 |
| 10/12/2016 | 4.4 |
| 10/12/2016 | 4.5 |
| 10/12/2016 | 4.5 |
| 10/12/2016 | 4.4 |
| 10/12/2016 | 4.3 |
| 10/12/2016 | 4.4 |
| 10/12/2016 | 4.9 |
| 10/12/2016 | 5 |
| 10/12/2016 | 5 |
| 10/12/2016 | 4.8 |
| 10/12/2016 | 4.4 |
| 10/12/2016 | 3.9 |
| 10/12/2016 | 3.6 |
| 10/12/2016 | 3.3 |
| 10/12/2016 | 3 |
| 11/12/2016 | 2.7 |
| 11/12/2016 | 2.6 |
| 11/12/2016 | 2.5 |
| 11/12/2016 | 2.5 |
| 11/12/2016 | 2.5 |
| 11/12/2016 | 2.6 |
| 11/12/2016 | 2.9 |
| 11/12/2016 | 3.2 |
| 11/12/2016 | 3.5 |
| 11/12/2016 | 3.7 |
| 11/12/2016 | 3.9 |
| 11/12/2016 | 4 |
| 11/12/2016 | 3.9 |
| 11/12/2016 | 3.9 |
| 11/12/2016 | 4 |
| 11/12/2016 | 4.4 |
| 11/12/2016 | 4.6 |
| 11/12/2016 | 4.7 |
| 11/12/2016 | 4.5 |
| 11/12/2016 | 4.2 |
| 11/12/2016 | 3.9 |
| 11/12/2016 | 3.6 |
| 11/12/2016 | 3.3 |
| 11/12/2016 | 3 |
| 12/12/2016 | 2.7 |
| 12/12/2016 | 2.6 |
| 12/12/2016 | 2.6 |
| 12/12/2016 | 2.7 |
| 12/12/2016 | 3 |
| 12/12/2016 | 3.8 |
| 12/12/2016 | 4.5 |
| 12/12/2016 | 4.9 |
| 12/12/2016 | 5.2 |
| 12/12/2016 | 5.3 |
| 12/12/2016 | 5.4 |
| 12/12/2016 | 5.4 |
| 12/12/2016 | 5.4 |
| 12/12/2016 | 5.4 |
| 12/12/2016 | 5.5 |
| 12/12/2016 | 6 |
| 12/12/2016 | 6.2 |
| 12/12/2016 | 6.1 |
| 12/12/2016 | 5.8 |
| 12/12/2016 | 5.2 |
| 12/12/2016 | 4.5 |
| 12/12/2016 | 4 |
| 12/12/2016 | 3.5 |
| 12/12/2016 | 3.1 |
| 13/12/2016 | 2.9 |
| 13/12/2016 | 2.7 |
| 13/12/2016 | 2.7 |
| 13/12/2016 | 2.8 |
| 13/12/2016 | 3.1 |
| 13/12/2016 | 3.9 |
| 13/12/2016 | 4.6 |
| 13/12/2016 | 5 |
| 13/12/2016 | 5.2 |
| 13/12/2016 | 5.4 |
| 13/12/2016 | 5.5 |
| 13/12/2016 | 5.5 |
| 13/12/2016 | 5.4 |
| 13/12/2016 | 5.5 |
| 13/12/2016 | 5.6 |
| 13/12/2016 | 6 |
| 13/12/2016 | 6.2 |
| 13/12/2016 | 6.1 |
| 13/12/2016 | 5.9 |
| 13/12/2016 | 5.2 |
| 13/12/2016 | 4.5 |
| 13/12/2016 | 4 |
| 13/12/2016 | 3.5 |
| 13/12/2016 | 3.2 |
| 14/12/2016 | 2.9 |
| 14/12/2016 | 2.7 |
| 14/12/2016 | 2.7 |
| 14/12/2016 | 2.8 |
| 14/12/2016 | 3.1 |
| 14/12/2016 | 3.9 |
| 14/12/2016 | 4.6 |
| 14/12/2016 | 5 |
| 14/12/2016 | 5.3 |
| 14/12/2016 | 5.4 |
| 14/12/2016 | 5.5 |
| 14/12/2016 | 5.5 |
| 14/12/2016 | 5.5 |
| 14/12/2016 | 5.5 |
| 14/12/2016 | 5.6 |
| 14/12/2016 | 6.1 |
| 14/12/2016 | 6.2 |
| 14/12/2016 | 6.2 |
| 14/12/2016 | 5.9 |
| 14/12/2016 | 5.2 |
| 14/12/2016 | 4.6 |
| 14/12/2016 | 4 |
| 14/12/2016 | 3.5 |
| 14/12/2016 | 3.2 |
| 15/12/2016 | 2.9 |
| 15/12/2016 | 2.7 |
| 15/12/2016 | 2.7 |
| 15/12/2016 | 2.8 |
| 15/12/2016 | 3.1 |
| 15/12/2016 | 3.9 |
| 15/12/2016 | 4.6 |
| 15/12/2016 | 5 |
| 15/12/2016 | 5.3 |
| 15/12/2016 | 5.4 |
| 15/12/2016 | 5.5 |
| 15/12/2016 | 5.5 |
| 15/12/2016 | 5.5 |
| 15/12/2016 | 5.5 |
| 15/12/2016 | 5.6 |
| 15/12/2016 | 6.1 |
| 15/12/2016 | 6.2 |
| 15/12/2016 | 6.2 |
| 15/12/2016 | 5.9 |
| 15/12/2016 | 5.2 |
| 15/12/2016 | 4.6 |
| 15/12/2016 | 4.1 |
| 15/12/2016 | 3.6 |
| 15/12/2016 | 3.2 |
| 16/12/2016 | 2.9 |
| 16/12/2016 | 2.8 |
| 16/12/2016 | 2.7 |
| 16/12/2016 | 2.8 |
| 16/12/2016 | 3.1 |
| 16/12/2016 | 3.8 |
| 16/12/2016 | 4.6 |
| 16/12/2016 | 5 |
| 16/12/2016 | 5.2 |
| 16/12/2016 | 5.4 |
| 16/12/2016 | 5.5 |
| 16/12/2016 | 5.5 |
| 16/12/2016 | 5.4 |
| 16/12/2016 | 5.4 |
| 16/12/2016 | 5.5 |
| 16/12/2016 | 5.9 |
| 16/12/2016 | 6 |
| 16/12/2016 | 5.9 |
| 16/12/2016 | 5.6 |
| 16/12/2016 | 5 |
| 16/12/2016 | 4.4 |
| 16/12/2016 | 3.9 |
| 16/12/2016 | 3.5 |
| 16/12/2016 | 3.1 |
| 17/12/2016 | 2.9 |
| 17/12/2016 | 2.7 |
| 17/12/2016 | 2.7 |
| 17/12/2016 | 2.6 |
| 17/12/2016 | 2.7 |
| 17/12/2016 | 2.9 |
| 17/12/2016 | 3.3 |
| 17/12/2016 | 3.7 |
| 17/12/2016 | 4.1 |
| 17/12/2016 | 4.4 |
| 17/12/2016 | 4.5 |
| 17/12/2016 | 4.5 |
| 17/12/2016 | 4.4 |
| 17/12/2016 | 4.3 |
| 17/12/2016 | 4.5 |
| 17/12/2016 | 4.9 |
| 17/12/2016 | 5 |
| 17/12/2016 | 5 |
| 17/12/2016 | 4.8 |
| 17/12/2016 | 4.4 |
| 17/12/2016 | 3.9 |
| 17/12/2016 | 3.6 |
| 17/12/2016 | 3.3 |
| 17/12/2016 | 3 |
| 18/12/2016 | 2.7 |
| 18/12/2016 | 2.6 |
| 18/12/2016 | 2.5 |
| 18/12/2016 | 2.5 |
| 18/12/2016 | 2.5 |
| 18/12/2016 | 2.6 |
| 18/12/2016 | 2.9 |
| 18/12/2016 | 3.1 |
| 18/12/2016 | 3.5 |
| 18/12/2016 | 3.7 |
| 18/12/2016 | 3.9 |
| 18/12/2016 | 4 |
| 18/12/2016 | 3.9 |
| 18/12/2016 | 3.9 |
| 18/12/2016 | 4 |
| 18/12/2016 | 4.4 |
| 18/12/2016 | 4.6 |
| 18/12/2016 | 4.7 |
| 18/12/2016 | 4.5 |
| 18/12/2016 | 4.2 |
| 18/12/2016 | 3.9 |
| 18/12/2016 | 3.6 |
| 18/12/2016 | 3.3 |
| 18/12/2016 | 3 |
| 19/12/2016 | 2.7 |
| 19/12/2016 | 2.6 |
| 19/12/2016 | 2.6 |
| 19/12/2016 | 2.7 |
| 19/12/2016 | 3 |
| 19/12/2016 | 3.8 |
| 19/12/2016 | 4.5 |
| 19/12/2016 | 4.9 |
| 19/12/2016 | 5.1 |
| 19/12/2016 | 5.3 |
| 19/12/2016 | 5.4 |
| 19/12/2016 | 5.5 |
| 19/12/2016 | 5.4 |
| 19/12/2016 | 5.4 |
| 19/12/2016 | 5.6 |
| 19/12/2016 | 6 |
| 19/12/2016 | 6.1 |
| 19/12/2016 | 6.1 |
| 19/12/2016 | 5.8 |
| 19/12/2016 | 5.2 |
| 19/12/2016 | 4.5 |
| 19/12/2016 | 4 |
| 19/12/2016 | 3.5 |
| 19/12/2016 | 3.2 |
| 20/12/2016 | 2.9 |
| 20/12/2016 | 2.7 |
| 20/12/2016 | 2.7 |
| 20/12/2016 | 2.8 |
| 20/12/2016 | 3.1 |
| 20/12/2016 | 3.8 |
| 20/12/2016 | 4.6 |
| 20/12/2016 | 5 |
| 20/12/2016 | 5.2 |
| 20/12/2016 | 5.4 |
| 20/12/2016 | 5.5 |
| 20/12/2016 | 5.5 |
| 20/12/2016 | 5.5 |
| 20/12/2016 | 5.5 |
| 20/12/2016 | 5.6 |
| 20/12/2016 | 6 |
| 20/12/2016 | 6.2 |
| 20/12/2016 | 6.1 |
| 20/12/2016 | 5.9 |
| 20/12/2016 | 5.2 |
| 20/12/2016 | 4.6 |
| 20/12/2016 | 4 |
| 20/12/2016 | 3.5 |
| 20/12/2016 | 3.2 |
| 21/12/2016 | 2.9 |
| 21/12/2016 | 2.7 |
| 21/12/2016 | 2.7 |
| 21/12/2016 | 2.8 |
| 21/12/2016 | 3.1 |
| 21/12/2016 | 3.8 |
| 21/12/2016 | 4.6 |
| 21/12/2016 | 5 |
| 21/12/2016 | 5.2 |
| 21/12/2016 | 5.4 |
| 21/12/2016 | 5.5 |
| 21/12/2016 | 5.5 |
| 21/12/2016 | 5.5 |
| 21/12/2016 | 5.5 |
| 21/12/2016 | 5.6 |
| 21/12/2016 | 6 |
| 21/12/2016 | 6.2 |
| 21/12/2016 | 6.2 |
| 21/12/2016 | 5.9 |
| 21/12/2016 | 5.2 |
| 21/12/2016 | 4.6 |
| 21/12/2016 | 4.1 |
| 21/12/2016 | 3.6 |
| 21/12/2016 | 3.2 |
| 22/12/2016 | 2.9 |
| 22/12/2016 | 2.8 |
| 22/12/2016 | 2.7 |
| 22/12/2016 | 2.8 |
| 22/12/2016 | 3.1 |
| 22/12/2016 | 3.8 |
| 22/12/2016 | 4.6 |
| 22/12/2016 | 5 |
| 22/12/2016 | 5.3 |
| 22/12/2016 | 5.4 |
| 22/12/2016 | 5.5 |
| 22/12/2016 | 5.6 |
| 22/12/2016 | 5.5 |
| 22/12/2016 | 5.5 |
| 22/12/2016 | 5.7 |
| 22/12/2016 | 6.1 |
| 22/12/2016 | 6.2 |
| 22/12/2016 | 6.2 |
| 22/12/2016 | 5.9 |
| 22/12/2016 | 5.2 |
| 22/12/2016 | 4.6 |
| 22/12/2016 | 4.1 |
| 22/12/2016 | 3.6 |
| 22/12/2016 | 3.2 |
| 23/12/2016 | 2.9 |
| 23/12/2016 | 2.7 |
| 23/12/2016 | 2.7 |
| 23/12/2016 | 2.8 |
| 23/12/2016 | 3.1 |
| 23/12/2016 | 3.7 |
| 23/12/2016 | 4.4 |
| 23/12/2016 | 4.8 |
| 23/12/2016 | 5.1 |
| 23/12/2016 | 5.3 |
| 23/12/2016 | 5.4 |
| 23/12/2016 | 5.4 |
| 23/12/2016 | 5.3 |
| 23/12/2016 | 5.3 |
| 23/12/2016 | 5.4 |
| 23/12/2016 | 5.8 |
| 23/12/2016 | 5.8 |
| 23/12/2016 | 5.7 |
| 23/12/2016 | 5.5 |
| 23/12/2016 | 4.9 |
| 23/12/2016 | 4.3 |
| 23/12/2016 | 3.9 |
| 23/12/2016 | 3.5 |
| 23/12/2016 | 2.9 |
| 24/12/2016 | 2.6 |
| 24/12/2016 | 2.5 |
| 24/12/2016 | 2.5 |
| 24/12/2016 | 2.5 |
| 24/12/2016 | 2.6 |
| 24/12/2016 | 2.7 |
| 24/12/2016 | 3 |
| 24/12/2016 | 3.5 |
| 24/12/2016 | 3.9 |
| 24/12/2016 | 4.2 |
| 24/12/2016 | 4.3 |
| 24/12/2016 | 4.3 |
| 24/12/2016 | 4.2 |
| 24/12/2016 | 3.9 |
| 24/12/2016 | 3.8 |
| 24/12/2016 | 3.9 |
| 24/12/2016 | 3.9 |
| 24/12/2016 | 3.8 |
| 24/12/2016 | 3.6 |
| 24/12/2016 | 3.4 |
| 24/12/2016 | 3.3 |
| 24/12/2016 | 3.1 |
| 24/12/2016 | 2.9 |
| 24/12/2016 | 2.7 |
| 25/12/2016 | 2.5 |
| 25/12/2016 | 2.4 |
| 25/12/2016 | 2.4 |
| 25/12/2016 | 2.4 |
| 25/12/2016 | 2.4 |
| 25/12/2016 | 2.5 |
| 25/12/2016 | 2.6 |
| 25/12/2016 | 2.8 |
| 25/12/2016 | 3.2 |
| 25/12/2016 | 3.5 |
| 25/12/2016 | 3.7 |
| 25/12/2016 | 3.8 |
| 25/12/2016 | 3.6 |
| 25/12/2016 | 3.5 |
| 25/12/2016 | 3.6 |
| 25/12/2016 | 3.8 |
| 25/12/2016 | 3.9 |
| 25/12/2016 | 3.9 |
| 25/12/2016 | 3.8 |
| 25/12/2016 | 3.6 |
| 25/12/2016 | 3.4 |
| 25/12/2016 | 3.2 |
| 25/12/2016 | 2.9 |
| 25/12/2016 | 2.7 |
| 26/12/2016 | 2.5 |
| 26/12/2016 | 2.4 |
| 26/12/2016 | 2.4 |
| 26/12/2016 | 2.4 |
| 26/12/2016 | 2.4 |
| 26/12/2016 | 2.5 |
| 26/12/2016 | 2.6 |
| 26/12/2016 | 2.8 |
| 26/12/2016 | 3.2 |
| 26/12/2016 | 3.5 |
| 26/12/2016 | 3.7 |
| 26/12/2016 | 3.8 |
| 26/12/2016 | 3.6 |
| 26/12/2016 | 3.5 |
| 26/12/2016 | 3.6 |
| 26/12/2016 | 3.8 |
| 26/12/2016 | 3.9 |
| 26/12/2016 | 3.9 |
| 26/12/2016 | 3.8 |
| 26/12/2016 | 3.6 |
| 26/12/2016 | 3.4 |
| 26/12/2016 | 3.2 |
| 26/12/2016 | 2.9 |
| 26/12/2016 | 2.9 |
| 27/12/2016 | 2.6 |
| 27/12/2016 | 2.5 |
| 27/12/2016 | 2.5 |
| 27/12/2016 | 2.5 |
| 27/12/2016 | 2.7 |
| 27/12/2016 | 3 |
| 27/12/2016 | 3.5 |
| 27/12/2016 | 3.9 |
| 27/12/2016 | 4.3 |
| 27/12/2016 | 4.5 |
| 27/12/2016 | 4.6 |
| 27/12/2016 | 4.6 |
| 27/12/2016 | 4.5 |
| 27/12/2016 | 4.5 |
| 27/12/2016 | 4.6 |
| 27/12/2016 | 5 |
| 27/12/2016 | 5.1 |
| 27/12/2016 | 5.2 |
| 27/12/2016 | 5 |
| 27/12/2016 | 4.4 |
| 27/12/2016 | 3.9 |
| 27/12/2016 | 3.6 |
| 27/12/2016 | 3.3 |
| 27/12/2016 | 2.9 |
| 28/12/2016 | 2.6 |
| 28/12/2016 | 2.5 |
| 28/12/2016 | 2.5 |
| 28/12/2016 | 2.5 |
| 28/12/2016 | 2.7 |
| 28/12/2016 | 3 |
| 28/12/2016 | 3.5 |
| 28/12/2016 | 3.9 |
| 28/12/2016 | 4.3 |
| 28/12/2016 | 4.5 |
| 28/12/2016 | 4.6 |
| 28/12/2016 | 4.6 |
| 28/12/2016 | 4.5 |
| 28/12/2016 | 4.5 |
| 28/12/2016 | 4.6 |
| 28/12/2016 | 5 |
| 28/12/2016 | 5.1 |
| 28/12/2016 | 5.2 |
| 28/12/2016 | 5 |
| 28/12/2016 | 4.4 |
| 28/12/2016 | 3.9 |
| 28/12/2016 | 3.6 |
| 28/12/2016 | 3.3 |
| 28/12/2016 | 2.9 |
| 29/12/2016 | 2.6 |
| 29/12/2016 | 2.5 |
| 29/12/2016 | 2.5 |
| 29/12/2016 | 2.5 |
| 29/12/2016 | 2.7 |
| 29/12/2016 | 3 |
| 29/12/2016 | 3.5 |
| 29/12/2016 | 3.9 |
| 29/12/2016 | 4.3 |
| 29/12/2016 | 4.5 |
| 29/12/2016 | 4.6 |
| 29/12/2016 | 4.6 |
| 29/12/2016 | 4.5 |
| 29/12/2016 | 4.5 |
| 29/12/2016 | 4.6 |
| 29/12/2016 | 5 |
| 29/12/2016 | 5.1 |
| 29/12/2016 | 5.2 |
| 29/12/2016 | 5 |
| 29/12/2016 | 4.4 |
| 29/12/2016 | 4 |
| 29/12/2016 | 3.6 |
| 29/12/2016 | 3.3 |
| 29/12/2016 | 2.9 |
| 30/12/2016 | 2.6 |
| 30/12/2016 | 2.5 |
| 30/12/2016 | 2.5 |
| 30/12/2016 | 2.5 |
| 30/12/2016 | 2.7 |
| 30/12/2016 | 3 |
| 30/12/2016 | 3.5 |
| 30/12/2016 | 3.9 |
| 30/12/2016 | 4.3 |
| 30/12/2016 | 4.5 |
| 30/12/2016 | 4.6 |
| 30/12/2016 | 4.6 |
| 30/12/2016 | 4.5 |
| 30/12/2016 | 4.5 |
| 30/12/2016 | 4.6 |
| 30/12/2016 | 5 |
| 30/12/2016 | 5.1 |
| 30/12/2016 | 5.2 |
| 30/12/2016 | 5 |
| 30/12/2016 | 4.4 |
| 30/12/2016 | 4 |
| 30/12/2016 | 3.6 |
| 30/12/2016 | 3.3 |
| 30/12/2016 | 2.9 |
| 31/12/2016 | 2.6 |
| 31/12/2016 | 2.5 |
| 31/12/2016 | 2.5 |
| 31/12/2016 | 2.4 |
| 31/12/2016 | 2.5 |
| 31/12/2016 | 2.7 |
| 31/12/2016 | 2.9 |
| 31/12/2016 | 3.2 |
| 31/12/2016 | 3.6 |
| 31/12/2016 | 3.9 |
| 31/12/2016 | 4 |
| 31/12/2016 | 4.1 |
| 31/12/2016 | 4 |
| 31/12/2016 | 4 |
| 31/12/2016 | 4 |
| 31/12/2016 | 4.4 |
| 31/12/2016 | 4.6 |
| 31/12/2016 | 4.5 |
| 31/12/2016 | 4.2 |
| 31/12/2016 | 3.8 |
| 31/12/2016 | 3.4 |
| 31/12/2016 | 3.3 |
| 31/12/2016 | 3.1 |